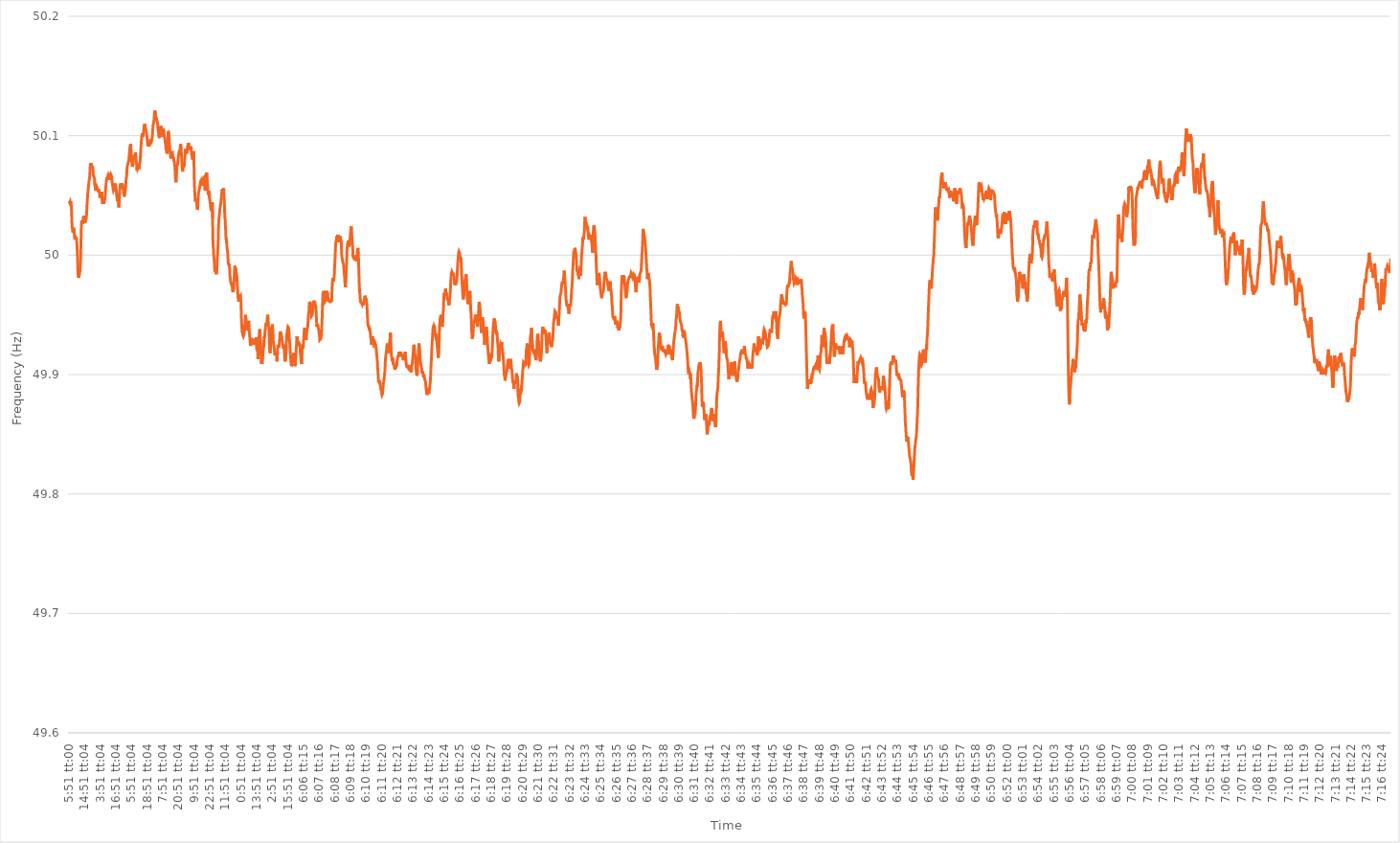
| Category | Series 0 |
|---|---|
| 0.24375 | 50.045 |
| 0.24376157407407406 | 50.045 |
| 0.24377314814814813 | 50.044 |
| 0.24378472222222222 | 50.044 |
| 0.2437962962962963 | 50.045 |
| 0.285462962962963 | 50.044 |
| 0.32712962962963 | 50.045 |
| 0.368796296296296 | 50.045 |
| 0.410462962962963 | 50.043 |
| 0.45212962962963 | 50.04 |
| 0.493796296296296 | 50.034 |
| 0.535462962962963 | 50.028 |
| 0.57712962962963 | 50.023 |
| 0.618796296296296 | 50.022 |
| 0.660462962962963 | 50.021 |
| 0.70212962962963 | 50.019 |
| 0.743796296296296 | 50.021 |
| 0.785462962962963 | 50.021 |
| 0.82712962962963 | 50.023 |
| 0.868796296296296 | 50.023 |
| 0.910462962962963 | 50.019 |
| 0.95212962962963 | 50.017 |
| 0.993796296296296 | 50.014 |
| 1900-01-01 00:51:04 | 50.013 |
| 1900-01-01 01:51:04 | 50.014 |
| 1900-01-01 02:51:04 | 50.014 |
| 1900-01-01 03:51:04 | 50.015 |
| 1900-01-01 04:51:04 | 50.015 |
| 1900-01-01 05:51:04 | 50.015 |
| 1900-01-01 06:51:04 | 50.014 |
| 1900-01-01 07:51:04 | 50.011 |
| 1900-01-01 08:51:04 | 50.008 |
| 1900-01-01 09:51:04 | 50.003 |
| 1900-01-01 10:51:04 | 49.998 |
| 1900-01-01 11:51:04 | 49.991 |
| 1900-01-01 12:51:04 | 49.984 |
| 1900-01-01 13:51:04 | 49.982 |
| 1900-01-01 14:51:04 | 49.981 |
| 1900-01-01 15:51:04 | 49.982 |
| 1900-01-01 16:51:04 | 49.982 |
| 1900-01-01 17:51:04 | 49.983 |
| 1900-01-01 18:51:04 | 49.985 |
| 1900-01-01 19:51:04 | 49.986 |
| 1900-01-01 20:51:04 | 49.987 |
| 1900-01-01 21:51:04 | 49.991 |
| 1900-01-01 22:51:04 | 49.997 |
| 1900-01-01 23:51:04 | 50.008 |
| 1900-01-02 00:51:04 | 50.017 |
| 1900-01-02 01:51:04 | 50.025 |
| 1900-01-02 02:51:04 | 50.029 |
| 1900-01-02 03:51:04 | 50.029 |
| 1900-01-02 04:51:04 | 50.028 |
| 1900-01-02 05:51:04 | 50.026 |
| 1900-01-02 06:51:04 | 50.028 |
| 1900-01-02 07:51:04 | 50.028 |
| 1900-01-02 08:51:04 | 50.03 |
| 1900-01-02 09:51:04 | 50.032 |
| 1900-01-02 10:51:04 | 50.033 |
| 1900-01-02 11:51:04 | 50.032 |
| 1900-01-02 12:51:04 | 50.029 |
| 1900-01-02 13:51:04 | 50.027 |
| 1900-01-02 14:51:04 | 50.029 |
| 1900-01-02 15:51:04 | 50.027 |
| 1900-01-02 16:51:04 | 50.027 |
| 1900-01-02 17:51:04 | 50.03 |
| 1900-01-02 18:51:04 | 50.029 |
| 1900-01-02 19:51:04 | 50.029 |
| 1900-01-02 20:51:04 | 50.032 |
| 1900-01-02 21:51:04 | 50.033 |
| 1900-01-02 22:51:04 | 50.037 |
| 1900-01-02 23:51:04 | 50.042 |
| 1900-01-03 00:51:04 | 50.045 |
| 1900-01-03 01:51:04 | 50.049 |
| 1900-01-03 02:51:04 | 50.052 |
| 1900-01-03 03:51:04 | 50.053 |
| 1900-01-03 04:51:04 | 50.056 |
| 1900-01-03 05:51:04 | 50.058 |
| 1900-01-03 06:51:04 | 50.06 |
| 1900-01-03 07:51:04 | 50.062 |
| 1900-01-03 08:51:04 | 50.062 |
| 1900-01-03 09:51:04 | 50.065 |
| 1900-01-03 10:51:04 | 50.068 |
| 1900-01-03 11:51:04 | 50.073 |
| 1900-01-03 12:51:04 | 50.076 |
| 1900-01-03 13:51:04 | 50.075 |
| 1900-01-03 14:51:04 | 50.077 |
| 1900-01-03 15:51:04 | 50.077 |
| 1900-01-03 16:51:04 | 50.076 |
| 1900-01-03 17:51:04 | 50.075 |
| 1900-01-03 18:51:04 | 50.075 |
| 1900-01-03 19:51:04 | 50.075 |
| 1900-01-03 20:51:04 | 50.074 |
| 1900-01-03 21:51:04 | 50.074 |
| 1900-01-03 22:51:04 | 50.073 |
| 1900-01-03 23:51:04 | 50.068 |
| 1900-01-04 00:51:04 | 50.067 |
| 1900-01-04 01:51:04 | 50.066 |
| 1900-01-04 02:51:04 | 50.066 |
| 1900-01-04 03:51:04 | 50.065 |
| 1900-01-04 04:51:04 | 50.064 |
| 1900-01-04 05:51:04 | 50.059 |
| 1900-01-04 06:51:04 | 50.058 |
| 1900-01-04 07:51:04 | 50.057 |
| 1900-01-04 08:51:04 | 50.055 |
| 1900-01-04 09:51:04 | 50.054 |
| 1900-01-04 10:51:04 | 50.057 |
| 1900-01-04 11:51:04 | 50.057 |
| 1900-01-04 12:51:04 | 50.058 |
| 1900-01-04 13:51:04 | 50.058 |
| 1900-01-04 14:51:04 | 50.057 |
| 1900-01-04 15:51:04 | 50.056 |
| 1900-01-04 16:51:04 | 50.055 |
| 1900-01-04 17:51:04 | 50.054 |
| 1900-01-04 18:51:04 | 50.055 |
| 1900-01-04 19:51:04 | 50.055 |
| 1900-01-04 20:51:04 | 50.053 |
| 1900-01-04 21:51:04 | 50.055 |
| 1900-01-04 22:51:04 | 50.054 |
| 1900-01-04 23:51:04 | 50.053 |
| 1900-01-05 00:51:04 | 50.051 |
| 1900-01-05 01:51:04 | 50.048 |
| 1900-01-05 02:51:04 | 50.049 |
| 1900-01-05 03:51:04 | 50.051 |
| 1900-01-05 04:51:04 | 50.051 |
| 1900-01-05 05:51:04 | 50.051 |
| 1900-01-05 06:51:04 | 50.051 |
| 1900-01-05 07:51:04 | 50.051 |
| 1900-01-05 08:51:04 | 50.053 |
| 1900-01-05 09:51:04 | 50.05 |
| 1900-01-05 10:51:04 | 50.046 |
| 1900-01-05 11:51:04 | 50.044 |
| 1900-01-05 12:51:04 | 50.043 |
| 1900-01-05 13:51:04 | 50.045 |
| 1900-01-05 14:51:04 | 50.046 |
| 1900-01-05 15:51:04 | 50.046 |
| 1900-01-05 16:51:04 | 50.044 |
| 1900-01-05 17:51:04 | 50.043 |
| 1900-01-05 18:51:04 | 50.044 |
| 1900-01-05 19:51:04 | 50.045 |
| 1900-01-05 20:51:04 | 50.045 |
| 1900-01-05 21:51:04 | 50.048 |
| 1900-01-05 22:51:04 | 50.05 |
| 1900-01-05 23:51:04 | 50.054 |
| 1900-01-06 00:51:04 | 50.057 |
| 1900-01-06 01:51:04 | 50.058 |
| 1900-01-06 02:51:04 | 50.061 |
| 1900-01-06 03:51:04 | 50.063 |
| 1900-01-06 04:51:04 | 50.064 |
| 1900-01-06 05:51:04 | 50.065 |
| 1900-01-06 06:51:04 | 50.064 |
| 1900-01-06 07:51:04 | 50.065 |
| 1900-01-06 08:51:04 | 50.065 |
| 1900-01-06 09:51:04 | 50.064 |
| 1900-01-06 10:51:04 | 50.066 |
| 1900-01-06 11:51:04 | 50.067 |
| 1900-01-06 12:51:04 | 50.067 |
| 1900-01-06 13:51:04 | 50.066 |
| 1900-01-06 14:51:04 | 50.065 |
| 1900-01-06 15:51:04 | 50.063 |
| 1900-01-06 16:51:04 | 50.065 |
| 1900-01-06 17:51:04 | 50.067 |
| 1900-01-06 18:51:04 | 50.067 |
| 1900-01-06 19:51:04 | 50.068 |
| 1900-01-06 20:51:04 | 50.068 |
| 1900-01-06 21:51:04 | 50.067 |
| 1900-01-06 22:51:04 | 50.067 |
| 1900-01-06 23:51:04 | 50.066 |
| 1900-01-07 00:51:04 | 50.065 |
| 1900-01-07 01:51:04 | 50.061 |
| 1900-01-07 02:51:04 | 50.06 |
| 1900-01-07 03:51:04 | 50.058 |
| 1900-01-07 04:51:04 | 50.057 |
| 1900-01-07 05:51:04 | 50.055 |
| 1900-01-07 06:51:04 | 50.054 |
| 1900-01-07 07:51:04 | 50.054 |
| 1900-01-07 08:51:04 | 50.055 |
| 1900-01-07 09:51:04 | 50.055 |
| 1900-01-07 10:51:04 | 50.056 |
| 1900-01-07 11:51:04 | 50.058 |
| 1900-01-07 12:51:04 | 50.057 |
| 1900-01-07 13:51:04 | 50.058 |
| 1900-01-07 14:51:04 | 50.06 |
| 1900-01-07 15:51:04 | 50.057 |
| 1900-01-07 16:51:04 | 50.056 |
| 1900-01-07 17:51:04 | 50.055 |
| 1900-01-07 18:51:04 | 50.052 |
| 1900-01-07 19:51:04 | 50.05 |
| 1900-01-07 20:51:04 | 50.048 |
| 1900-01-07 21:51:04 | 50.048 |
| 1900-01-07 22:51:04 | 50.048 |
| 1900-01-07 23:51:04 | 50.049 |
| 1900-01-08 00:51:04 | 50.047 |
| 1900-01-08 01:51:04 | 50.046 |
| 1900-01-08 02:51:04 | 50.043 |
| 1900-01-08 03:51:04 | 50.04 |
| 1900-01-08 04:51:04 | 50.042 |
| 1900-01-08 05:51:04 | 50.046 |
| 1900-01-08 06:51:04 | 50.05 |
| 1900-01-08 07:51:04 | 50.055 |
| 1900-01-08 08:51:04 | 50.058 |
| 1900-01-08 09:51:04 | 50.059 |
| 1900-01-08 10:51:04 | 50.06 |
| 1900-01-08 11:51:04 | 50.058 |
| 1900-01-08 12:51:04 | 50.056 |
| 1900-01-08 13:51:04 | 50.058 |
| 1900-01-08 14:51:04 | 50.057 |
| 1900-01-08 15:51:04 | 50.057 |
| 1900-01-08 16:51:04 | 50.06 |
| 1900-01-08 17:51:04 | 50.06 |
| 1900-01-08 18:51:04 | 50.058 |
| 1900-01-08 19:51:04 | 50.057 |
| 1900-01-08 20:51:04 | 50.056 |
| 1900-01-08 21:51:04 | 50.054 |
| 1900-01-08 22:51:04 | 50.052 |
| 1900-01-08 23:51:04 | 50.051 |
| 1900-01-09 00:51:04 | 50.049 |
| 1900-01-09 01:51:04 | 50.049 |
| 1900-01-09 02:51:04 | 50.051 |
| 1900-01-09 03:51:04 | 50.052 |
| 1900-01-09 04:51:04 | 50.053 |
| 1900-01-09 05:51:04 | 50.055 |
| 1900-01-09 06:51:04 | 50.058 |
| 1900-01-09 07:51:04 | 50.062 |
| 1900-01-09 08:51:04 | 50.064 |
| 1900-01-09 09:51:04 | 50.065 |
| 1900-01-09 10:51:04 | 50.068 |
| 1900-01-09 11:51:04 | 50.072 |
| 1900-01-09 12:51:04 | 50.074 |
| 1900-01-09 13:51:04 | 50.074 |
| 1900-01-09 14:51:04 | 50.076 |
| 1900-01-09 15:51:04 | 50.077 |
| 1900-01-09 16:51:04 | 50.077 |
| 1900-01-09 17:51:04 | 50.077 |
| 1900-01-09 18:51:04 | 50.079 |
| 1900-01-09 19:51:04 | 50.082 |
| 1900-01-09 20:51:04 | 50.084 |
| 1900-01-09 21:51:04 | 50.086 |
| 1900-01-09 22:51:04 | 50.089 |
| 1900-01-09 23:51:04 | 50.091 |
| 1900-01-10 00:51:04 | 50.092 |
| 1900-01-10 01:51:04 | 50.093 |
| 1900-01-10 02:51:04 | 50.092 |
| 1900-01-10 03:51:04 | 50.088 |
| 1900-01-10 04:51:04 | 50.083 |
| 1900-01-10 05:51:04 | 50.081 |
| 1900-01-10 06:51:04 | 50.077 |
| 1900-01-10 07:51:04 | 50.076 |
| 1900-01-10 08:51:04 | 50.074 |
| 1900-01-10 09:51:04 | 50.074 |
| 1900-01-10 10:51:04 | 50.074 |
| 1900-01-10 11:51:04 | 50.077 |
| 1900-01-10 12:51:04 | 50.08 |
| 1900-01-10 13:51:04 | 50.081 |
| 1900-01-10 14:51:04 | 50.083 |
| 1900-01-10 15:51:04 | 50.084 |
| 1900-01-10 16:51:04 | 50.082 |
| 1900-01-10 17:51:04 | 50.082 |
| 1900-01-10 18:51:04 | 50.083 |
| 1900-01-10 19:51:04 | 50.084 |
| 1900-01-10 20:51:04 | 50.086 |
| 1900-01-10 21:51:04 | 50.084 |
| 1900-01-10 22:51:04 | 50.082 |
| 1900-01-10 23:51:04 | 50.079 |
| 1900-01-11 00:51:04 | 50.077 |
| 1900-01-11 01:51:04 | 50.074 |
| 1900-01-11 02:51:04 | 50.071 |
| 1900-01-11 03:51:04 | 50.073 |
| 1900-01-11 04:51:04 | 50.072 |
| 1900-01-11 05:51:04 | 50.072 |
| 1900-01-11 06:51:04 | 50.073 |
| 1900-01-11 07:51:04 | 50.073 |
| 1900-01-11 08:51:04 | 50.074 |
| 1900-01-11 09:51:04 | 50.073 |
| 1900-01-11 10:51:04 | 50.072 |
| 1900-01-11 11:51:04 | 50.075 |
| 1900-01-11 12:51:04 | 50.076 |
| 1900-01-11 13:51:04 | 50.076 |
| 1900-01-11 14:51:04 | 50.078 |
| 1900-01-11 15:51:04 | 50.081 |
| 1900-01-11 16:51:04 | 50.085 |
| 1900-01-11 17:51:04 | 50.089 |
| 1900-01-11 18:51:04 | 50.092 |
| 1900-01-11 19:51:04 | 50.096 |
| 1900-01-11 20:51:04 | 50.097 |
| 1900-01-11 21:51:04 | 50.1 |
| 1900-01-11 22:51:04 | 50.1 |
| 1900-01-11 23:51:04 | 50.102 |
| 1900-01-12 00:51:04 | 50.1 |
| 1900-01-12 01:51:04 | 50.099 |
| 1900-01-12 02:51:04 | 50.1 |
| 1900-01-12 03:51:04 | 50.1 |
| 1900-01-12 04:51:04 | 50.104 |
| 1900-01-12 05:51:04 | 50.106 |
| 1900-01-12 06:51:04 | 50.108 |
| 1900-01-12 07:51:04 | 50.109 |
| 1900-01-12 08:51:04 | 50.11 |
| 1900-01-12 09:51:04 | 50.109 |
| 1900-01-12 10:51:04 | 50.108 |
| 1900-01-12 11:51:04 | 50.107 |
| 1900-01-12 12:51:04 | 50.107 |
| 1900-01-12 13:51:04 | 50.105 |
| 1900-01-12 14:51:04 | 50.104 |
| 1900-01-12 15:51:04 | 50.104 |
| 1900-01-12 16:51:04 | 50.1 |
| 1900-01-12 17:51:04 | 50.099 |
| 1900-01-12 18:51:04 | 50.097 |
| 1900-01-12 19:51:04 | 50.094 |
| 1900-01-12 20:51:04 | 50.094 |
| 1900-01-12 21:51:04 | 50.091 |
| 1900-01-12 22:51:04 | 50.092 |
| 1900-01-12 23:51:04 | 50.093 |
| 1900-01-13 00:51:04 | 50.092 |
| 1900-01-13 01:51:04 | 50.091 |
| 1900-01-13 02:51:04 | 50.091 |
| 1900-01-13 03:51:04 | 50.091 |
| 1900-01-13 04:51:04 | 50.094 |
| 1900-01-13 05:51:04 | 50.095 |
| 1900-01-13 06:51:04 | 50.096 |
| 1900-01-13 07:51:04 | 50.097 |
| 1900-01-13 08:51:04 | 50.094 |
| 1900-01-13 09:51:04 | 50.097 |
| 1900-01-13 10:51:04 | 50.097 |
| 1900-01-13 11:51:04 | 50.096 |
| 1900-01-13 12:51:04 | 50.097 |
| 1900-01-13 13:51:04 | 50.097 |
| 1900-01-13 14:51:04 | 50.1 |
| 1900-01-13 15:51:04 | 50.104 |
| 1900-01-13 16:51:04 | 50.106 |
| 1900-01-13 17:51:04 | 50.109 |
| 1900-01-13 18:51:04 | 50.11 |
| 1900-01-13 19:51:04 | 50.111 |
| 1900-01-13 20:51:04 | 50.111 |
| 1900-01-13 21:51:04 | 50.114 |
| 1900-01-13 22:51:04 | 50.118 |
| 1900-01-13 23:51:04 | 50.12 |
| 1900-01-14 00:51:04 | 50.121 |
| 1900-01-14 01:51:04 | 50.121 |
| 1900-01-14 02:51:04 | 50.119 |
| 1900-01-14 03:51:04 | 50.117 |
| 1900-01-14 04:51:04 | 50.113 |
| 1900-01-14 05:51:04 | 50.113 |
| 1900-01-14 06:51:04 | 50.115 |
| 1900-01-14 07:51:04 | 50.113 |
| 1900-01-14 08:51:04 | 50.113 |
| 1900-01-14 09:51:04 | 50.113 |
| 1900-01-14 10:51:04 | 50.111 |
| 1900-01-14 11:51:04 | 50.109 |
| 1900-01-14 12:51:04 | 50.105 |
| 1900-01-14 13:51:04 | 50.104 |
| 1900-01-14 14:51:04 | 50.103 |
| 1900-01-14 15:51:04 | 50.1 |
| 1900-01-14 16:51:04 | 50.099 |
| 1900-01-14 17:51:04 | 50.098 |
| 1900-01-14 18:51:04 | 50.1 |
| 1900-01-14 19:51:04 | 50.104 |
| 1900-01-14 20:51:04 | 50.106 |
| 1900-01-14 21:51:04 | 50.108 |
| 1900-01-14 22:51:04 | 50.108 |
| 1900-01-14 23:51:04 | 50.107 |
| 1900-01-15 00:51:04 | 50.108 |
| 1900-01-15 01:51:04 | 50.106 |
| 1900-01-15 02:51:04 | 50.104 |
| 1900-01-15 03:51:04 | 50.102 |
| 1900-01-15 04:51:04 | 50.099 |
| 1900-01-15 05:51:04 | 50.101 |
| 1900-01-15 06:51:04 | 50.103 |
| 1900-01-15 07:51:04 | 50.104 |
| 1900-01-15 08:51:04 | 50.106 |
| 1900-01-15 09:51:04 | 50.106 |
| 1900-01-15 10:51:04 | 50.105 |
| 1900-01-15 11:51:04 | 50.104 |
| 1900-01-15 12:51:04 | 50.101 |
| 1900-01-15 13:51:04 | 50.099 |
| 1900-01-15 14:51:04 | 50.099 |
| 1900-01-15 15:51:04 | 50.098 |
| 1900-01-15 16:51:04 | 50.095 |
| 1900-01-15 17:51:04 | 50.094 |
| 1900-01-15 18:51:04 | 50.092 |
| 1900-01-15 19:51:04 | 50.089 |
| 1900-01-15 20:51:04 | 50.089 |
| 1900-01-15 21:51:04 | 50.089 |
| 1900-01-15 22:51:04 | 50.086 |
| 1900-01-15 23:51:04 | 50.085 |
| 1900-01-16 00:51:04 | 50.087 |
| 1900-01-16 01:51:04 | 50.094 |
| 1900-01-16 02:51:04 | 50.098 |
| 1900-01-16 03:51:04 | 50.1 |
| 1900-01-16 04:51:04 | 50.104 |
| 1900-01-16 05:51:04 | 50.103 |
| 1900-01-16 06:51:04 | 50.102 |
| 1900-01-16 07:51:04 | 50.101 |
| 1900-01-16 08:51:04 | 50.095 |
| 1900-01-16 09:51:04 | 50.092 |
| 1900-01-16 10:51:04 | 50.089 |
| 1900-01-16 11:51:04 | 50.087 |
| 1900-01-16 12:51:04 | 50.085 |
| 1900-01-16 13:51:04 | 50.082 |
| 1900-01-16 14:51:04 | 50.081 |
| 1900-01-16 15:51:04 | 50.081 |
| 1900-01-16 16:51:04 | 50.084 |
| 1900-01-16 17:51:04 | 50.086 |
| 1900-01-16 18:51:04 | 50.085 |
| 1900-01-16 19:51:04 | 50.087 |
| 1900-01-16 20:51:04 | 50.086 |
| 1900-01-16 21:51:04 | 50.085 |
| 1900-01-16 22:51:04 | 50.083 |
| 1900-01-16 23:51:04 | 50.081 |
| 1900-01-17 00:51:04 | 50.082 |
| 1900-01-17 01:51:04 | 50.081 |
| 1900-01-17 02:51:04 | 50.079 |
| 1900-01-17 03:51:04 | 50.079 |
| 1900-01-17 04:51:04 | 50.078 |
| 1900-01-17 05:51:04 | 50.075 |
| 1900-01-17 06:51:04 | 50.074 |
| 1900-01-17 07:51:04 | 50.07 |
| 1900-01-17 08:51:04 | 50.065 |
| 1900-01-17 09:51:04 | 50.063 |
| 1900-01-17 10:51:04 | 50.061 |
| 1900-01-17 11:51:04 | 50.064 |
| 1900-01-17 12:51:04 | 50.066 |
| 1900-01-17 13:51:04 | 50.071 |
| 1900-01-17 14:51:04 | 50.074 |
| 1900-01-17 15:51:04 | 50.075 |
| 1900-01-17 16:51:04 | 50.076 |
| 1900-01-17 17:51:04 | 50.077 |
| 1900-01-17 18:51:04 | 50.08 |
| 1900-01-17 19:51:04 | 50.081 |
| 1900-01-17 20:51:04 | 50.084 |
| 1900-01-17 21:51:04 | 50.084 |
| 1900-01-17 22:51:04 | 50.086 |
| 1900-01-17 23:51:04 | 50.087 |
| 1900-01-18 00:51:04 | 50.087 |
| 1900-01-18 01:51:04 | 50.087 |
| 1900-01-18 02:51:04 | 50.088 |
| 1900-01-18 03:51:04 | 50.091 |
| 1900-01-18 04:51:04 | 50.093 |
| 1900-01-18 05:51:04 | 50.092 |
| 1900-01-18 06:51:04 | 50.091 |
| 1900-01-18 07:51:04 | 50.086 |
| 1900-01-18 08:51:04 | 50.083 |
| 1900-01-18 09:51:04 | 50.078 |
| 1900-01-18 10:51:04 | 50.073 |
| 1900-01-18 11:51:04 | 50.072 |
| 1900-01-18 12:51:04 | 50.07 |
| 1900-01-18 13:51:04 | 50.071 |
| 1900-01-18 14:51:04 | 50.075 |
| 1900-01-18 15:51:04 | 50.074 |
| 1900-01-18 16:51:04 | 50.074 |
| 1900-01-18 17:51:04 | 50.075 |
| 1900-01-18 18:51:04 | 50.074 |
| 1900-01-18 19:51:04 | 50.077 |
| 1900-01-18 20:51:04 | 50.08 |
| 1900-01-18 21:51:04 | 50.082 |
| 1900-01-18 22:51:04 | 50.087 |
| 1900-01-18 23:51:04 | 50.088 |
| 1900-01-19 00:51:04 | 50.089 |
| 1900-01-19 01:51:04 | 50.089 |
| 1900-01-19 02:51:04 | 50.087 |
| 1900-01-19 03:51:04 | 50.087 |
| 1900-01-19 04:51:04 | 50.085 |
| 1900-01-19 05:51:04 | 50.087 |
| 1900-01-19 06:51:04 | 50.088 |
| 1900-01-19 07:51:04 | 50.091 |
| 1900-01-19 08:51:04 | 50.091 |
| 1900-01-19 09:51:04 | 50.091 |
| 1900-01-19 10:51:04 | 50.093 |
| 1900-01-19 11:51:04 | 50.094 |
| 1900-01-19 12:51:04 | 50.094 |
| 1900-01-19 13:51:04 | 50.09 |
| 1900-01-19 14:51:04 | 50.089 |
| 1900-01-19 15:51:04 | 50.088 |
| 1900-01-19 16:51:04 | 50.089 |
| 1900-01-19 17:51:04 | 50.091 |
| 1900-01-19 18:51:04 | 50.089 |
| 1900-01-19 19:51:04 | 50.089 |
| 1900-01-19 20:51:04 | 50.091 |
| 1900-01-19 21:51:04 | 50.09 |
| 1900-01-19 22:51:04 | 50.089 |
| 1900-01-19 23:51:04 | 50.084 |
| 1900-01-20 00:51:04 | 50.084 |
| 1900-01-20 01:51:04 | 50.083 |
| 1900-01-20 02:51:04 | 50.081 |
| 1900-01-20 03:51:04 | 50.08 |
| 1900-01-20 04:51:04 | 50.082 |
| 1900-01-20 05:51:04 | 50.083 |
| 1900-01-20 06:51:04 | 50.086 |
| 1900-01-20 07:51:04 | 50.087 |
| 1900-01-20 08:51:04 | 50.084 |
| 1900-01-20 09:51:04 | 50.067 |
| 1900-01-20 10:51:04 | 50.06 |
| 1900-01-20 11:51:04 | 50.054 |
| 1900-01-20 12:51:04 | 50.05 |
| 1900-01-20 13:51:04 | 50.048 |
| 1900-01-20 14:51:04 | 50.045 |
| 1900-01-20 15:51:04 | 50.047 |
| 1900-01-20 16:51:04 | 50.047 |
| 1900-01-20 17:51:04 | 50.046 |
| 1900-01-20 18:51:04 | 50.046 |
| 1900-01-20 19:51:04 | 50.044 |
| 1900-01-20 20:51:04 | 50.041 |
| 1900-01-20 21:51:04 | 50.039 |
| 1900-01-20 22:51:04 | 50.038 |
| 1900-01-20 23:51:04 | 50.039 |
| 1900-01-21 00:51:04 | 50.043 |
| 1900-01-21 01:51:04 | 50.049 |
| 1900-01-21 02:51:04 | 50.052 |
| 1900-01-21 03:51:04 | 50.053 |
| 1900-01-21 04:51:04 | 50.053 |
| 1900-01-21 05:51:04 | 50.055 |
| 1900-01-21 06:51:04 | 50.055 |
| 1900-01-21 07:51:04 | 50.057 |
| 1900-01-21 08:51:04 | 50.059 |
| 1900-01-21 09:51:04 | 50.06 |
| 1900-01-21 10:51:04 | 50.062 |
| 1900-01-21 11:51:04 | 50.062 |
| 1900-01-21 12:51:04 | 50.062 |
| 1900-01-21 13:51:04 | 50.063 |
| 1900-01-21 14:51:04 | 50.06 |
| 1900-01-21 15:51:04 | 50.06 |
| 1900-01-21 16:51:04 | 50.058 |
| 1900-01-21 17:51:04 | 50.059 |
| 1900-01-21 18:51:04 | 50.062 |
| 1900-01-21 19:51:04 | 50.062 |
| 1900-01-21 20:51:04 | 50.063 |
| 1900-01-21 21:51:04 | 50.062 |
| 1900-01-21 22:51:04 | 50.063 |
| 1900-01-21 23:51:04 | 50.063 |
| 1900-01-22 00:51:04 | 50.064 |
| 1900-01-22 01:51:04 | 50.063 |
| 1900-01-22 02:51:04 | 50.059 |
| 1900-01-22 03:51:04 | 50.056 |
| 1900-01-22 04:51:04 | 50.054 |
| 1900-01-22 05:51:04 | 50.057 |
| 1900-01-22 06:51:04 | 50.059 |
| 1900-01-22 07:51:04 | 50.064 |
| 1900-01-22 08:51:04 | 50.068 |
| 1900-01-22 09:51:04 | 50.068 |
| 1900-01-22 10:51:04 | 50.069 |
| 1900-01-22 11:51:04 | 50.064 |
| 1900-01-22 12:51:04 | 50.063 |
| 1900-01-22 13:51:04 | 50.059 |
| 1900-01-22 14:51:04 | 50.058 |
| 1900-01-22 15:51:04 | 50.053 |
| 1900-01-22 16:51:04 | 50.051 |
| 1900-01-22 17:51:04 | 50.051 |
| 1900-01-22 18:51:04 | 50.054 |
| 1900-01-22 19:51:04 | 50.05 |
| 1900-01-22 20:51:04 | 50.053 |
| 1900-01-22 21:51:04 | 50.048 |
| 1900-01-22 22:51:04 | 50.046 |
| 1900-01-22 23:51:04 | 50.046 |
| 1900-01-23 00:51:04 | 50.043 |
| 1900-01-23 01:51:04 | 50.041 |
| 1900-01-23 02:51:04 | 50.039 |
| 1900-01-23 03:51:04 | 50.037 |
| 1900-01-23 04:51:04 | 50.039 |
| 1900-01-23 05:51:04 | 50.041 |
| 1900-01-23 06:51:04 | 50.044 |
| 1900-01-23 07:51:04 | 50.042 |
| 1900-01-23 08:51:04 | 50.044 |
| 1900-01-23 09:51:04 | 50.031 |
| 1900-01-23 10:51:04 | 50.016 |
| 1900-01-23 11:51:04 | 50.008 |
| 1900-01-23 12:51:04 | 50.007 |
| 1900-01-23 13:51:04 | 50.001 |
| 1900-01-23 14:51:04 | 49.998 |
| 1900-01-23 15:51:04 | 49.996 |
| 1900-01-23 16:51:04 | 49.994 |
| 1900-01-23 17:51:04 | 49.989 |
| 1900-01-23 18:51:04 | 49.986 |
| 1900-01-23 19:51:04 | 49.986 |
| 1900-01-23 20:51:04 | 49.987 |
| 1900-01-23 21:51:04 | 49.987 |
| 1900-01-23 22:51:04 | 49.987 |
| 1900-01-23 23:51:04 | 49.985 |
| 1900-01-24 00:51:04 | 49.984 |
| 1900-01-24 01:51:04 | 49.987 |
| 1900-01-24 02:51:04 | 49.989 |
| 1900-01-24 03:51:04 | 49.996 |
| 1900-01-24 04:51:04 | 50 |
| 1900-01-24 05:51:04 | 50.004 |
| 1900-01-24 06:51:04 | 50.008 |
| 1900-01-24 07:51:04 | 50.013 |
| 1900-01-24 08:51:04 | 50.024 |
| 1900-01-24 09:51:04 | 50.028 |
| 1900-01-24 10:51:04 | 50.031 |
| 1900-01-24 11:51:04 | 50.033 |
| 1900-01-24 12:51:04 | 50.035 |
| 1900-01-24 13:51:04 | 50.038 |
| 1900-01-24 14:51:04 | 50.039 |
| 1900-01-24 15:51:04 | 50.041 |
| 1900-01-24 16:51:04 | 50.042 |
| 1900-01-24 17:51:04 | 50.044 |
| 1900-01-24 18:51:04 | 50.046 |
| 1900-01-24 19:51:04 | 50.047 |
| 1900-01-24 20:51:04 | 50.051 |
| 1900-01-24 21:51:04 | 50.052 |
| 1900-01-24 22:51:04 | 50.055 |
| 1900-01-24 23:51:04 | 50.054 |
| 1900-01-25 00:51:04 | 50.055 |
| 1900-01-25 01:51:04 | 50.052 |
| 1900-01-25 02:51:04 | 50.054 |
| 1900-01-25 03:51:04 | 50.054 |
| 1900-01-25 04:51:04 | 50.056 |
| 1900-01-25 05:51:04 | 50.053 |
| 1900-01-25 06:51:04 | 50.048 |
| 1900-01-25 07:51:04 | 50.044 |
| 1900-01-25 08:51:04 | 50.036 |
| 1900-01-25 09:51:04 | 50.032 |
| 1900-01-25 10:51:04 | 50.03 |
| 1900-01-25 11:51:04 | 50.025 |
| 1900-01-25 12:51:04 | 50.021 |
| 1900-01-25 13:51:04 | 50.015 |
| 1900-01-25 14:51:04 | 50.013 |
| 1900-01-25 15:51:04 | 50.014 |
| 1900-01-25 16:51:04 | 50.01 |
| 1900-01-25 17:51:04 | 50.008 |
| 1900-01-25 18:51:04 | 50.005 |
| 1900-01-25 19:51:04 | 50.004 |
| 1900-01-25 20:51:04 | 50.002 |
| 1900-01-25 21:51:04 | 49.998 |
| 1900-01-25 22:51:04 | 49.994 |
| 1900-01-25 23:51:04 | 49.992 |
| 1900-01-26 00:51:04 | 49.992 |
| 1900-01-26 01:51:04 | 49.993 |
| 1900-01-26 02:51:04 | 49.991 |
| 1900-01-26 03:51:04 | 49.99 |
| 1900-01-26 04:51:04 | 49.987 |
| 1900-01-26 05:51:04 | 49.982 |
| 1900-01-26 06:51:04 | 49.981 |
| 1900-01-26 07:51:04 | 49.981 |
| 1900-01-26 08:51:04 | 49.977 |
| 1900-01-26 09:51:04 | 49.976 |
| 1900-01-26 10:51:04 | 49.977 |
| 1900-01-26 11:51:04 | 49.977 |
| 1900-01-26 12:51:04 | 49.975 |
| 1900-01-26 13:51:04 | 49.975 |
| 1900-01-26 14:51:04 | 49.973 |
| 1900-01-26 15:51:04 | 49.97 |
| 1900-01-26 16:51:04 | 49.97 |
| 1900-01-26 17:51:04 | 49.969 |
| 1900-01-26 18:51:04 | 49.969 |
| 1900-01-26 19:51:04 | 49.973 |
| 1900-01-26 20:51:04 | 49.976 |
| 1900-01-26 21:51:04 | 49.98 |
| 1900-01-26 22:51:04 | 49.984 |
| 1900-01-26 23:51:04 | 49.99 |
| 1900-01-27 00:51:04 | 49.991 |
| 1900-01-27 01:51:04 | 49.991 |
| 1900-01-27 02:51:04 | 49.988 |
| 1900-01-27 03:51:04 | 49.989 |
| 1900-01-27 04:51:04 | 49.989 |
| 1900-01-27 05:51:04 | 49.986 |
| 1900-01-27 06:51:04 | 49.985 |
| 1900-01-27 07:51:04 | 49.983 |
| 1900-01-27 08:51:04 | 49.982 |
| 1900-01-27 09:51:04 | 49.976 |
| 1900-01-27 10:51:04 | 49.973 |
| 1900-01-27 11:51:04 | 49.97 |
| 1900-01-27 12:51:04 | 49.966 |
| 1900-01-27 13:51:04 | 49.964 |
| 1900-01-27 14:51:04 | 49.965 |
| 1900-01-27 15:51:04 | 49.961 |
| 1900-01-27 16:51:04 | 49.961 |
| 1900-01-27 17:51:04 | 49.965 |
| 1900-01-27 18:51:04 | 49.967 |
| 1900-01-27 19:51:04 | 49.965 |
| 1900-01-27 20:51:04 | 49.965 |
| 1900-01-27 21:51:04 | 49.965 |
| 1900-01-27 22:51:04 | 49.966 |
| 1900-01-27 23:51:04 | 49.962 |
| 1900-01-28 00:51:04 | 49.961 |
| 1900-01-28 01:51:04 | 49.95 |
| 1900-01-28 02:51:04 | 49.944 |
| 1900-01-28 03:51:04 | 49.941 |
| 1900-01-28 04:51:04 | 49.936 |
| 1900-01-28 05:51:04 | 49.936 |
| 1900-01-28 06:51:04 | 49.935 |
| 1900-01-28 07:51:04 | 49.933 |
| 1900-01-28 08:51:04 | 49.933 |
| 1900-01-28 09:51:04 | 49.932 |
| 1900-01-28 10:51:04 | 49.932 |
| 1900-01-28 11:51:04 | 49.932 |
| 1900-01-28 12:51:04 | 49.934 |
| 1900-01-28 13:51:04 | 49.937 |
| 1900-01-28 14:51:04 | 49.94 |
| 1900-01-28 15:51:04 | 49.942 |
| 1900-01-28 16:51:04 | 49.945 |
| 1900-01-28 17:51:04 | 49.949 |
| 1900-01-28 18:51:04 | 49.95 |
| 1900-01-28 19:51:04 | 49.944 |
| 1900-01-28 20:51:04 | 49.941 |
| 1900-01-28 21:51:04 | 49.939 |
| 1900-01-28 22:51:04 | 49.937 |
| 1900-01-28 23:51:04 | 49.937 |
| 1900-01-29 00:51:04 | 49.938 |
| 1900-01-29 01:51:04 | 49.94 |
| 1900-01-29 02:51:04 | 49.941 |
| 1900-01-29 03:51:04 | 49.942 |
| 1900-01-29 04:51:04 | 49.944 |
| 1900-01-29 05:51:04 | 49.943 |
| 1900-01-29 06:51:04 | 49.945 |
| 1900-01-29 07:51:04 | 49.94 |
| 1900-01-29 08:51:04 | 49.937 |
| 1900-01-29 09:51:04 | 49.934 |
| 1900-01-29 10:51:04 | 49.932 |
| 1900-01-29 11:51:04 | 49.929 |
| 1900-01-29 12:51:04 | 49.927 |
| 1900-01-29 13:51:04 | 49.924 |
| 1900-01-29 14:51:04 | 49.927 |
| 1900-01-29 15:51:04 | 49.928 |
| 1900-01-29 16:51:04 | 49.928 |
| 1900-01-29 17:51:04 | 49.928 |
| 1900-01-29 18:51:04 | 49.929 |
| 1900-01-29 19:51:04 | 49.929 |
| 1900-01-29 20:51:04 | 49.928 |
| 1900-01-29 21:51:04 | 49.929 |
| 1900-01-29 22:51:04 | 49.93 |
| 1900-01-29 23:51:04 | 49.929 |
| 1900-01-30 00:51:04 | 49.925 |
| 1900-01-30 01:51:04 | 49.926 |
| 1900-01-30 02:51:04 | 49.925 |
| 1900-01-30 03:51:04 | 49.926 |
| 1900-01-30 04:51:04 | 49.928 |
| 1900-01-30 05:51:04 | 49.929 |
| 1900-01-30 06:51:04 | 49.927 |
| 1900-01-30 07:51:04 | 49.925 |
| 1900-01-30 08:51:04 | 49.926 |
| 1900-01-30 09:51:04 | 49.928 |
| 1900-01-30 10:51:04 | 49.93 |
| 1900-01-30 11:51:04 | 49.931 |
| 1900-01-30 12:51:04 | 49.925 |
| 1900-01-30 13:51:04 | 49.922 |
| 1900-01-30 14:51:04 | 49.921 |
| 1900-01-30 15:51:04 | 49.924 |
| 1900-01-30 16:51:04 | 49.92 |
| 1900-01-30 17:51:04 | 49.919 |
| 1900-01-30 18:51:04 | 49.913 |
| 1900-01-30 19:51:04 | 49.914 |
| 1900-01-30 20:51:04 | 49.918 |
| 1900-01-30 21:51:04 | 49.924 |
| 1900-01-30 22:51:04 | 49.928 |
| 1900-01-30 23:51:04 | 49.934 |
| 1900-01-31 00:51:04 | 49.936 |
| 1900-01-31 01:51:04 | 49.938 |
| 1900-01-31 02:51:04 | 49.936 |
| 1900-01-31 03:51:04 | 49.933 |
| 1900-01-31 04:51:04 | 49.928 |
| 1900-01-31 05:51:04 | 49.922 |
| 1900-01-31 06:51:04 | 49.917 |
| 1900-01-31 07:51:04 | 49.91 |
| 1900-01-31 08:51:04 | 49.909 |
| 1900-01-31 09:51:04 | 49.91 |
| 1900-01-31 10:51:04 | 49.909 |
| 1900-01-31 11:51:04 | 49.912 |
| 1900-01-31 12:51:04 | 49.913 |
| 1900-01-31 13:51:04 | 49.916 |
| 1900-01-31 14:51:04 | 49.917 |
| 1900-01-31 15:51:04 | 49.923 |
| 1900-01-31 16:51:04 | 49.924 |
| 1900-01-31 17:51:04 | 49.923 |
| 1900-01-31 18:51:04 | 49.929 |
| 1900-01-31 19:51:04 | 49.932 |
| 1900-01-31 20:51:04 | 49.931 |
| 1900-01-31 21:51:04 | 49.934 |
| 1900-01-31 22:51:04 | 49.937 |
| 1900-01-31 23:51:04 | 49.938 |
| 1900-02-01 00:51:04 | 49.941 |
| 1900-02-01 01:51:04 | 49.943 |
| 1900-02-01 02:51:04 | 49.943 |
| 1900-02-01 03:51:04 | 49.941 |
| 1900-02-01 04:51:04 | 49.942 |
| 1900-02-01 05:51:04 | 49.943 |
| 1900-02-01 06:51:04 | 49.946 |
| 1900-02-01 07:51:04 | 49.949 |
| 1900-02-01 08:51:04 | 49.95 |
| 1900-02-01 09:51:04 | 49.949 |
| 1900-02-01 10:51:04 | 49.945 |
| 1900-02-01 11:51:04 | 49.941 |
| 1900-02-01 12:51:04 | 49.94 |
| 1900-02-01 13:51:04 | 49.939 |
| 1900-02-01 14:51:04 | 49.931 |
| 1900-02-01 15:51:04 | 49.924 |
| 1900-02-01 16:51:04 | 49.92 |
| 1900-02-01 17:51:04 | 49.918 |
| 1900-02-01 18:51:04 | 49.919 |
| 1900-02-01 19:51:04 | 49.921 |
| 1900-02-01 20:51:04 | 49.926 |
| 1900-02-01 21:51:04 | 49.929 |
| 1900-02-01 22:51:04 | 49.935 |
| 1900-02-01 23:51:04 | 49.939 |
| 1900-02-02 00:51:04 | 49.938 |
| 1900-02-02 01:51:04 | 49.94 |
| 1900-02-02 02:51:04 | 49.942 |
| 1900-02-02 03:51:04 | 49.939 |
| 1900-02-02 04:51:04 | 49.938 |
| 1900-02-02 05:51:04 | 49.933 |
| 1900-02-02 06:51:04 | 49.927 |
| 1900-02-02 07:51:04 | 49.927 |
| 1900-02-02 08:51:04 | 49.924 |
| 1900-02-02 09:51:04 | 49.923 |
| 1900-02-02 10:51:04 | 49.921 |
| 1900-02-02 11:51:04 | 49.918 |
| 1900-02-02 12:51:04 | 49.916 |
| 1900-02-02 13:51:04 | 49.917 |
| 1900-02-02 14:51:04 | 49.917 |
| 1900-02-02 15:51:04 | 49.919 |
| 1900-02-02 16:51:04 | 49.919 |
| 1900-02-02 17:51:04 | 49.917 |
| 1900-02-02 18:51:04 | 49.919 |
| 1900-02-02 19:51:04 | 49.916 |
| 1900-02-02 20:51:04 | 49.911 |
| 1900-02-02 21:51:04 | 49.913 |
| 1900-02-02 22:51:04 | 49.919 |
| 1900-02-02 23:51:04 | 49.923 |
| 1900-02-03 00:51:04 | 49.925 |
| 1900-02-03 01:51:04 | 49.925 |
| 1900-02-03 02:51:04 | 49.923 |
| 1900-02-03 03:51:04 | 49.924 |
| 1900-02-03 04:51:04 | 49.923 |
| 1900-02-03 05:51:04 | 49.924 |
| 1900-02-03 06:51:04 | 49.929 |
| 1900-02-03 07:51:04 | 49.93 |
| 1900-02-03 08:51:04 | 49.934 |
| 1900-02-03 09:51:04 | 49.936 |
| 1900-02-03 10:51:04 | 49.936 |
| 1900-02-03 11:51:04 | 49.935 |
| 1900-02-03 12:51:04 | 49.934 |
| 1900-02-03 13:51:04 | 49.934 |
| 1900-02-03 14:51:04 | 49.933 |
| 1900-02-03 15:51:04 | 49.931 |
| 1900-02-03 16:51:04 | 49.929 |
| 1900-02-03 17:51:04 | 49.929 |
| 1900-02-03 18:51:04 | 49.926 |
| 1900-02-03 19:51:04 | 49.926 |
| 1900-02-03 20:51:04 | 49.926 |
| 1900-02-03 21:51:04 | 49.922 |
| 1900-02-03 22:51:04 | 49.925 |
| 1900-02-03 23:51:04 | 49.924 |
| 1900-02-04 00:51:04 | 49.922 |
| 1900-02-04 01:51:04 | 49.921 |
| 1900-02-04 02:51:04 | 49.916 |
| 1900-02-04 03:51:04 | 49.912 |
| 1900-02-04 04:51:04 | 49.911 |
| 1900-02-04 05:51:04 | 49.912 |
| 1900-02-04 06:51:04 | 49.913 |
| 1900-02-04 07:51:04 | 49.913 |
| 1900-02-04 08:51:04 | 49.919 |
| 1900-02-04 09:51:04 | 49.927 |
| 1900-02-04 10:51:04 | 49.933 |
| 1900-02-04 11:51:04 | 49.933 |
| 1900-02-04 12:51:04 | 49.935 |
| 1900-02-04 13:51:04 | 49.938 |
| 1900-02-04 14:51:04 | 49.939 |
| 1900-02-04 15:51:04 | 49.94 |
| 1900-02-04 16:51:04 | 49.94 |
| 1900-02-04 17:51:04 | 49.94 |
| 1900-02-04 18:51:04 | 49.939 |
| 1900-02-04 19:51:04 | 49.937 |
| 1900-02-04 20:51:04 | 49.931 |
| 1900-02-04 21:51:04 | 49.929 |
| 1900-02-04 22:51:04 | 49.927 |
| 1900-02-04 23:51:04 | 49.923 |
| 1900-02-05 00:51:04 | 49.919 |
| 1900-02-05 01:51:04 | 49.916 |
| 1900-02-05 02:51:04 | 49.913 |
| 1900-02-05 03:51:04 | 49.91 |
| 1900-02-05 04:51:04 | 49.908 |
| 1900-02-05 05:51:04 | 49.907 |
| 1900-02-05 06:51:04 | 49.907 |
| 1900-02-05 07:51:04 | 49.907 |
| 1900-02-05 08:51:04 | 49.909 |
| 1900-02-05 09:51:04 | 49.911 |
| 1900-02-05 10:51:04 | 49.913 |
| 1900-02-05 11:51:04 | 49.914 |
| 1900-02-05 12:51:04 | 49.915 |
| 1900-02-05 13:51:04 | 49.917 |
| 1900-02-05 14:51:04 | 49.918 |
| 1900-02-05 15:51:04 | 49.918 |
| 1900-02-05 16:51:04 | 49.912 |
| 1900-02-05 17:51:04 | 49.911 |
| 1900-02-05 18:51:04 | 49.907 |
| 1900-02-05 19:51:04 | 49.907 |
| 1900-02-05 20:51:04 | 49.909 |
| 1900-02-05 21:51:04 | 49.913 |
| 1900-02-05 22:51:04 | 49.914 |
| 1900-02-05 23:51:04 | 49.921 |
| 1900-02-06 00:51:04 | 49.923 |
| 1900-02-06 01:51:04 | 49.927 |
| 1900-02-06 02:51:04 | 49.932 |
| 1900-02-06 03:51:04 | 49.932 |
| 1900-02-06 04:51:04 | 49.929 |
| 1900-02-06 05:51:04 | 49.929 |
| 1900-02-06 06:51:04 | 49.929 |
| 1900-02-06 07:51:04 | 49.927 |
| 1900-02-06 08:51:04 | 49.927 |
| 1900-02-06 09:51:04 | 49.926 |
| 1900-02-06 10:51:04 | 49.924 |
| 1900-02-06 11:51:04 | 49.926 |
| 1900-02-06 12:51:04 | 49.926 |
| 0.25416666666666665 | 49.926 |
| 0.25417824074074075 | 49.925 |
| 0.2541898148148148 | 49.919 |
| 0.2542013888888889 | 49.919 |
| 0.254212962962963 | 49.915 |
| 0.254224537037037 | 49.912 |
| 0.2542361111111111 | 49.91 |
| 0.2542476851851852 | 49.909 |
| 0.25425925925925924 | 49.91 |
| 0.25427083333333333 | 49.918 |
| 0.25428240740740743 | 49.922 |
| 0.25429398148148147 | 49.925 |
| 0.25430555555555556 | 49.924 |
| 0.25431712962962966 | 49.922 |
| 0.2543287037037037 | 49.924 |
| 0.2543402777777778 | 49.927 |
| 0.2543518518518519 | 49.931 |
| 0.2543634259259259 | 49.935 |
| 0.254375 | 49.935 |
| 0.25438657407407406 | 49.939 |
| 0.25439814814814815 | 49.939 |
| 0.2544097222222222 | 49.939 |
| 0.2544212962962963 | 49.935 |
| 0.2544328703703704 | 49.932 |
| 0.2544444444444444 | 49.931 |
| 0.2544560185185185 | 49.929 |
| 0.2544675925925926 | 49.93 |
| 0.25447916666666665 | 49.934 |
| 0.25449074074074074 | 49.937 |
| 0.25450231481481483 | 49.938 |
| 0.2545138888888889 | 49.938 |
| 0.25452546296296297 | 49.939 |
| 0.25453703703703706 | 49.943 |
| 0.2545486111111111 | 49.946 |
| 0.2545601851851852 | 49.95 |
| 0.2545717592592593 | 49.951 |
| 0.25458333333333333 | 49.953 |
| 0.2545949074074074 | 49.958 |
| 0.2546064814814815 | 49.961 |
| 0.25461805555555556 | 49.961 |
| 0.2546296296296296 | 49.96 |
| 0.2546412037037037 | 49.959 |
| 0.2546527777777778 | 49.958 |
| 0.2546643518518518 | 49.958 |
| 0.2546759259259259 | 49.957 |
| 0.2546875 | 49.953 |
| 0.25469907407407405 | 49.949 |
| 0.25471064814814814 | 49.949 |
| 0.25472222222222224 | 49.949 |
| 0.2547337962962963 | 49.95 |
| 0.25474537037037037 | 49.952 |
| 0.25475694444444447 | 49.957 |
| 0.2547685185185185 | 49.96 |
| 0.2547800925925926 | 49.96 |
| 0.2547916666666667 | 49.961 |
| 0.25480324074074073 | 49.962 |
| 0.2548148148148148 | 49.961 |
| 0.2548263888888889 | 49.961 |
| 0.25483796296296296 | 49.96 |
| 0.25484953703703705 | 49.961 |
| 0.2548611111111111 | 49.96 |
| 0.2548726851851852 | 49.957 |
| 0.2548842592592592 | 49.958 |
| 0.2548958333333333 | 49.955 |
| 0.2549074074074074 | 49.953 |
| 0.25491898148148145 | 49.947 |
| 0.25493055555555555 | 49.943 |
| 0.25494212962962964 | 49.94 |
| 0.2549537037037037 | 49.941 |
| 0.2549652777777778 | 49.941 |
| 0.25497685185185187 | 49.942 |
| 0.2549884259259259 | 49.94 |
| 0.255 | 49.94 |
| 0.2550115740740741 | 49.94 |
| 0.25502314814814814 | 49.938 |
| 0.25503472222222223 | 49.936 |
| 0.2550462962962963 | 49.936 |
| 0.25505787037037037 | 49.932 |
| 0.25506944444444446 | 49.929 |
| 0.25508101851851855 | 49.929 |
| 0.2550925925925926 | 49.929 |
| 0.25510416666666663 | 49.929 |
| 0.2551157407407407 | 49.93 |
| 0.2551273148148148 | 49.931 |
| 0.25513888888888886 | 49.932 |
| 0.25515046296296295 | 49.934 |
| 0.25516203703703705 | 49.939 |
| 0.2551736111111111 | 49.945 |
| 0.2551851851851852 | 49.952 |
| 0.2551967592592593 | 49.959 |
| 0.2552083333333333 | 49.964 |
| 0.2552199074074074 | 49.968 |
| 0.2552314814814815 | 49.969 |
| 0.25524305555555554 | 49.97 |
| 0.25525462962962964 | 49.969 |
| 0.25526620370370373 | 49.968 |
| 0.25527777777777777 | 49.966 |
| 0.25528935185185186 | 49.962 |
| 0.25530092592592596 | 49.961 |
| 0.2553125 | 49.961 |
| 0.2553240740740741 | 49.962 |
| 0.25533564814814813 | 49.963 |
| 0.2553472222222222 | 49.963 |
| 0.25535879629629626 | 49.966 |
| 0.25537037037037036 | 49.968 |
| 0.25538194444444445 | 49.97 |
| 0.2553935185185185 | 49.968 |
| 0.2554050925925926 | 49.969 |
| 0.2554166666666667 | 49.969 |
| 0.2554282407407407 | 49.967 |
| 0.2554398148148148 | 49.964 |
| 0.2554513888888889 | 49.963 |
| 0.25546296296296295 | 49.961 |
| 0.25547453703703704 | 49.962 |
| 0.25548611111111114 | 49.962 |
| 0.2554976851851852 | 49.962 |
| 0.25550925925925927 | 49.962 |
| 0.25552083333333336 | 49.961 |
| 0.2555324074074074 | 49.96 |
| 0.2555439814814815 | 49.961 |
| 0.2555555555555556 | 49.961 |
| 0.25556712962962963 | 49.962 |
| 0.25557870370370367 | 49.961 |
| 0.25559027777777776 | 49.962 |
| 0.25560185185185186 | 49.961 |
| 0.2556134259259259 | 49.964 |
| 0.255625 | 49.972 |
| 0.2556365740740741 | 49.975 |
| 0.2556481481481481 | 49.978 |
| 0.2556597222222222 | 49.981 |
| 0.2556712962962963 | 49.981 |
| 0.25568287037037035 | 49.979 |
| 0.25569444444444445 | 49.978 |
| 0.25570601851851854 | 49.979 |
| 0.2557175925925926 | 49.981 |
| 0.2557291666666667 | 49.984 |
| 0.25574074074074077 | 49.99 |
| 0.2557523148148148 | 49.993 |
| 0.2557638888888889 | 49.998 |
| 0.255775462962963 | 50.004 |
| 0.25578703703703703 | 50.008 |
| 0.2557986111111111 | 50.011 |
| 0.25581018518518517 | 50.011 |
| 0.25582175925925926 | 50.013 |
| 0.2558333333333333 | 50.014 |
| 0.2558449074074074 | 50.016 |
| 0.2558564814814815 | 50.015 |
| 0.25586805555555553 | 50.015 |
| 0.2558796296296296 | 50.015 |
| 0.2558912037037037 | 50.017 |
| 0.25590277777777776 | 50.016 |
| 0.25591435185185185 | 50.013 |
| 0.25592592592592595 | 50.011 |
| 0.2559375 | 50.012 |
| 0.2559490740740741 | 50.011 |
| 0.2559606481481482 | 50.012 |
| 0.2559722222222222 | 50.014 |
| 0.2559837962962963 | 50.016 |
| 0.2559953703703704 | 50.015 |
| 0.25600694444444444 | 50.014 |
| 0.25601851851851853 | 50.013 |
| 0.25603009259259263 | 50.013 |
| 0.25604166666666667 | 50.012 |
| 0.2560532407407407 | 50.005 |
| 0.2560648148148148 | 50 |
| 0.2560763888888889 | 49.998 |
| 0.25608796296296293 | 49.997 |
| 0.25609953703703703 | 49.996 |
| 0.2561111111111111 | 49.994 |
| 0.25612268518518516 | 49.994 |
| 0.25613425925925926 | 49.993 |
| 0.25614583333333335 | 49.992 |
| 0.2561574074074074 | 49.989 |
| 0.2561689814814815 | 49.989 |
| 0.2561805555555556 | 49.984 |
| 0.2561921296296296 | 49.982 |
| 0.2562037037037037 | 49.978 |
| 0.2562152777777778 | 49.976 |
| 0.25622685185185184 | 49.973 |
| 0.25623842592592594 | 49.974 |
| 0.25625000000000003 | 49.978 |
| 0.25626157407407407 | 49.981 |
| 0.25627314814814817 | 49.99 |
| 0.2562847222222222 | 49.993 |
| 0.2562962962962963 | 50.002 |
| 0.25630787037037034 | 50.006 |
| 0.25631944444444443 | 50.008 |
| 0.2563310185185185 | 50.008 |
| 0.25634259259259257 | 50.011 |
| 0.25635416666666666 | 50.012 |
| 0.25636574074074076 | 50.011 |
| 0.2563773148148148 | 50.011 |
| 0.2563888888888889 | 50.007 |
| 0.256400462962963 | 50.009 |
| 0.256412037037037 | 50.008 |
| 0.2564236111111111 | 50.011 |
| 0.2564351851851852 | 50.014 |
| 0.25644675925925925 | 50.015 |
| 0.25645833333333334 | 50.018 |
| 0.25646990740740744 | 50.021 |
| 0.2564814814814815 | 50.023 |
| 0.25649305555555557 | 50.024 |
| 0.25650462962962967 | 50.021 |
| 0.2565162037037037 | 50.017 |
| 0.25652777777777774 | 50.013 |
| 0.25653935185185184 | 50.011 |
| 0.25655092592592593 | 50.008 |
| 0.25656249999999997 | 50.005 |
| 0.25657407407407407 | 49.999 |
| 0.25658564814814816 | 50 |
| 0.2565972222222222 | 49.998 |
| 0.2566087962962963 | 49.997 |
| 0.2566203703703704 | 49.998 |
| 0.2566319444444444 | 49.999 |
| 0.2566435185185185 | 49.996 |
| 0.2566550925925926 | 49.996 |
| 0.25666666666666665 | 49.996 |
| 0.25667824074074075 | 49.996 |
| 0.25668981481481484 | 50 |
| 0.2567013888888889 | 49.999 |
| 0.256712962962963 | 49.995 |
| 0.25672453703703707 | 49.995 |
| 0.2567361111111111 | 49.996 |
| 0.25674768518518515 | 49.998 |
| 0.25675925925925924 | 50.001 |
| 0.25677083333333334 | 50.004 |
| 0.2567824074074074 | 50.004 |
| 0.25679398148148147 | 50.006 |
| 0.25680555555555556 | 50.005 |
| 0.2568171296296296 | 50 |
| 0.2568287037037037 | 49.992 |
| 0.2568402777777778 | 49.984 |
| 0.25685185185185183 | 49.977 |
| 0.2568634259259259 | 49.972 |
| 0.256875 | 49.969 |
| 0.25688657407407406 | 49.967 |
| 0.25689814814814815 | 49.963 |
| 0.25690972222222225 | 49.961 |
| 0.2569212962962963 | 49.96 |
| 0.2569328703703704 | 49.961 |
| 0.2569444444444445 | 49.961 |
| 0.2569560185185185 | 49.961 |
| 0.2569675925925926 | 49.961 |
| 0.2569791666666667 | 49.959 |
| 0.25699074074074074 | 49.96 |
| 0.2570023148148148 | 49.961 |
| 0.2570138888888889 | 49.96 |
| 0.25702546296296297 | 49.959 |
| 0.257037037037037 | 49.959 |
| 0.2570486111111111 | 49.958 |
| 0.2570601851851852 | 49.96 |
| 0.25707175925925924 | 49.961 |
| 0.25708333333333333 | 49.961 |
| 0.2570949074074074 | 49.964 |
| 0.25710648148148146 | 49.966 |
| 0.25711805555555556 | 49.966 |
| 0.25712962962962965 | 49.965 |
| 0.2571412037037037 | 49.962 |
| 0.2571527777777778 | 49.962 |
| 0.2571643518518519 | 49.964 |
| 0.2571759259259259 | 49.962 |
| 0.2571875 | 49.962 |
| 0.2571990740740741 | 49.959 |
| 0.25721064814814815 | 49.954 |
| 0.25722222222222224 | 49.95 |
| 0.2572337962962963 | 49.946 |
| 0.2572453703703704 | 49.942 |
| 0.2572569444444444 | 49.942 |
| 0.2572685185185185 | 49.94 |
| 0.2572800925925926 | 49.941 |
| 0.25729166666666664 | 49.94 |
| 0.25730324074074074 | 49.937 |
| 0.25731481481481483 | 49.939 |
| 0.25732638888888887 | 49.938 |
| 0.25733796296296296 | 49.937 |
| 0.25734953703703706 | 49.937 |
| 0.2573611111111111 | 49.934 |
| 0.2573726851851852 | 49.931 |
| 0.2573842592592593 | 49.93 |
| 0.2573958333333333 | 49.928 |
| 0.2574074074074074 | 49.925 |
| 0.2574189814814815 | 49.926 |
| 0.25743055555555555 | 49.929 |
| 0.25744212962962965 | 49.931 |
| 0.2574537037037037 | 49.932 |
| 0.2574652777777778 | 49.931 |
| 0.2574768518518518 | 49.928 |
| 0.2574884259259259 | 49.927 |
| 0.2575 | 49.926 |
| 0.25751157407407405 | 49.925 |
| 0.25752314814814814 | 49.925 |
| 0.25753472222222223 | 49.925 |
| 0.2575462962962963 | 49.925 |
| 0.25755787037037037 | 49.927 |
| 0.25756944444444446 | 49.927 |
| 0.2575810185185185 | 49.927 |
| 0.2575925925925926 | 49.925 |
| 0.2576041666666667 | 49.924 |
| 0.25761574074074073 | 49.923 |
| 0.2576273148148148 | 49.92 |
| 0.2576388888888889 | 49.917 |
| 0.25765046296296296 | 49.916 |
| 0.25766203703703705 | 49.913 |
| 0.25767361111111114 | 49.911 |
| 0.2576851851851852 | 49.906 |
| 0.2576967592592592 | 49.903 |
| 0.2577083333333333 | 49.9 |
| 0.2577199074074074 | 49.896 |
| 0.25773148148148145 | 49.894 |
| 0.25774305555555554 | 49.894 |
| 0.25775462962962964 | 49.894 |
| 0.2577662037037037 | 49.893 |
| 0.2577777777777778 | 49.895 |
| 0.25778935185185187 | 49.894 |
| 0.2578009259259259 | 49.892 |
| 0.2578125 | 49.89 |
| 0.2578240740740741 | 49.889 |
| 0.25783564814814813 | 49.887 |
| 0.2578472222222222 | 49.888 |
| 0.2578587962962963 | 49.887 |
| 0.25787037037037036 | 49.884 |
| 0.25788194444444446 | 49.883 |
| 0.25789351851851855 | 49.883 |
| 0.2579050925925926 | 49.884 |
| 0.2579166666666667 | 49.887 |
| 0.2579282407407408 | 49.889 |
| 0.2579398148148148 | 49.892 |
| 0.25795138888888886 | 49.893 |
| 0.25796296296296295 | 49.893 |
| 0.25797453703703704 | 49.896 |
| 0.2579861111111111 | 49.898 |
| 0.2579976851851852 | 49.898 |
| 0.25800925925925927 | 49.902 |
| 0.2580208333333333 | 49.906 |
| 0.2580324074074074 | 49.911 |
| 0.2580439814814815 | 49.914 |
| 0.25805555555555554 | 49.916 |
| 0.25806712962962963 | 49.917 |
| 0.2580787037037037 | 49.919 |
| 0.25809027777777777 | 49.921 |
| 0.25810185185185186 | 49.924 |
| 0.25811342592592595 | 49.925 |
| 0.258125 | 49.926 |
| 0.2581365740740741 | 49.925 |
| 0.2581481481481482 | 49.921 |
| 0.2581597222222222 | 49.92 |
| 0.2581712962962963 | 49.919 |
| 0.25818287037037035 | 49.918 |
| 0.25819444444444445 | 49.922 |
| 0.2582060185185185 | 49.925 |
| 0.2582175925925926 | 49.926 |
| 0.2582291666666667 | 49.928 |
| 0.2582407407407407 | 49.93 |
| 0.2582523148148148 | 49.931 |
| 0.2582638888888889 | 49.935 |
| 0.25827546296296294 | 49.93 |
| 0.25828703703703704 | 49.925 |
| 0.25829861111111113 | 49.92 |
| 0.25831018518518517 | 49.916 |
| 0.25832175925925926 | 49.915 |
| 0.25833333333333336 | 49.912 |
| 0.2583449074074074 | 49.911 |
| 0.2583564814814815 | 49.912 |
| 0.2583680555555556 | 49.914 |
| 0.2583796296296296 | 49.912 |
| 0.2583912037037037 | 49.908 |
| 0.25840277777777776 | 49.908 |
| 0.25841435185185185 | 49.909 |
| 0.2584259259259259 | 49.909 |
| 0.2584375 | 49.907 |
| 0.2584490740740741 | 49.907 |
| 0.2584606481481481 | 49.904 |
| 0.2584722222222222 | 49.905 |
| 0.2584837962962963 | 49.905 |
| 0.25849537037037035 | 49.906 |
| 0.25850694444444444 | 49.905 |
| 0.25851851851851854 | 49.908 |
| 0.2585300925925926 | 49.907 |
| 0.25854166666666667 | 49.907 |
| 0.25855324074074076 | 49.909 |
| 0.2585648148148148 | 49.912 |
| 0.2585763888888889 | 49.913 |
| 0.258587962962963 | 49.913 |
| 0.25859953703703703 | 49.915 |
| 0.2586111111111111 | 49.915 |
| 0.2586226851851852 | 49.916 |
| 0.25863425925925926 | 49.917 |
| 0.2586458333333333 | 49.919 |
| 0.2586574074074074 | 49.919 |
| 0.2586689814814815 | 49.918 |
| 0.2586805555555555 | 49.919 |
| 0.2586921296296296 | 49.919 |
| 0.2587037037037037 | 49.917 |
| 0.25871527777777775 | 49.919 |
| 0.25872685185185185 | 49.919 |
| 0.25873842592592594 | 49.918 |
| 0.25875 | 49.918 |
| 0.2587615740740741 | 49.915 |
| 0.25877314814814817 | 49.915 |
| 0.2587847222222222 | 49.917 |
| 0.2587962962962963 | 49.916 |
| 0.2588078703703704 | 49.915 |
| 0.25881944444444444 | 49.915 |
| 0.25883101851851853 | 49.914 |
| 0.2588425925925926 | 49.912 |
| 0.25885416666666666 | 49.914 |
| 0.25886574074074076 | 49.912 |
| 0.25887731481481485 | 49.912 |
| 0.2588888888888889 | 49.913 |
| 0.25890046296296293 | 49.915 |
| 0.258912037037037 | 49.917 |
| 0.2589236111111111 | 49.919 |
| 0.25893518518518516 | 49.918 |
| 0.25894675925925925 | 49.916 |
| 0.25895833333333335 | 49.914 |
| 0.2589699074074074 | 49.911 |
| 0.2589814814814815 | 49.908 |
| 0.2589930555555556 | 49.908 |
| 0.2590046296296296 | 49.908 |
| 0.2590162037037037 | 49.906 |
| 0.2590277777777778 | 49.908 |
| 0.25903935185185184 | 49.908 |
| 0.25905092592592593 | 49.906 |
| 0.25906250000000003 | 49.906 |
| 0.25907407407407407 | 49.906 |
| 0.25908564814814816 | 49.905 |
| 0.25909722222222226 | 49.906 |
| 0.2591087962962963 | 49.905 |
| 0.25912037037037033 | 49.906 |
| 0.25913194444444443 | 49.907 |
| 0.2591435185185185 | 49.908 |
| 0.25915509259259256 | 49.907 |
| 0.25916666666666666 | 49.906 |
| 0.25917824074074075 | 49.905 |
| 0.2591898148148148 | 49.902 |
| 0.2592013888888889 | 49.903 |
| 0.259212962962963 | 49.905 |
| 0.259224537037037 | 49.907 |
| 0.2592361111111111 | 49.908 |
| 0.2592476851851852 | 49.909 |
| 0.25925925925925924 | 49.912 |
| 0.25927083333333334 | 49.913 |
| 0.25928240740740743 | 49.916 |
| 0.2592939814814815 | 49.919 |
| 0.25930555555555557 | 49.923 |
| 0.25931712962962966 | 49.925 |
| 0.2593287037037037 | 49.925 |
| 0.2593402777777778 | 49.923 |
| 0.25935185185185183 | 49.921 |
| 0.25936342592592593 | 49.917 |
| 0.25937499999999997 | 49.916 |
| 0.25938657407407406 | 49.915 |
| 0.25939814814814816 | 49.911 |
| 0.2594097222222222 | 49.907 |
| 0.2594212962962963 | 49.904 |
| 0.2594328703703704 | 49.905 |
| 0.2594444444444444 | 49.901 |
| 0.2594560185185185 | 49.899 |
| 0.2594675925925926 | 49.899 |
| 0.25947916666666665 | 49.901 |
| 0.25949074074074074 | 49.907 |
| 0.25950231481481484 | 49.911 |
| 0.2595138888888889 | 49.915 |
| 0.25952546296296297 | 49.918 |
| 0.25953703703703707 | 49.922 |
| 0.2595486111111111 | 49.926 |
| 0.2595601851851852 | 49.925 |
| 0.2595717592592593 | 49.924 |
| 0.25958333333333333 | 49.921 |
| 0.25959490740740737 | 49.918 |
| 0.25960648148148147 | 49.914 |
| 0.25961805555555556 | 49.911 |
| 0.2596296296296296 | 49.91 |
| 0.2596412037037037 | 49.908 |
| 0.2596527777777778 | 49.907 |
| 0.2596643518518518 | 49.906 |
| 0.2596759259259259 | 49.905 |
| 0.2596875 | 49.902 |
| 0.25969907407407405 | 49.903 |
| 0.25971064814814815 | 49.901 |
| 0.25972222222222224 | 49.902 |
| 0.2597337962962963 | 49.901 |
| 0.2597453703703704 | 49.9 |
| 0.25975694444444447 | 49.898 |
| 0.2597685185185185 | 49.9 |
| 0.2597800925925926 | 49.9 |
| 0.2597916666666667 | 49.898 |
| 0.25980324074074074 | 49.897 |
| 0.25981481481481483 | 49.897 |
| 0.2598263888888889 | 49.895 |
| 0.25983796296296297 | 49.895 |
| 0.259849537037037 | 49.894 |
| 0.2598611111111111 | 49.891 |
| 0.2598726851851852 | 49.888 |
| 0.25988425925925923 | 49.887 |
| 0.2598958333333333 | 49.885 |
| 0.2599074074074074 | 49.883 |
| 0.25991898148148146 | 49.883 |
| 0.25993055555555555 | 49.884 |
| 0.25994212962962965 | 49.887 |
| 0.2599537037037037 | 49.887 |
| 0.2599652777777778 | 49.887 |
| 0.2599768518518519 | 49.886 |
| 0.2599884259259259 | 49.884 |
| 0.26 | 49.884 |
| 0.2600115740740741 | 49.885 |
| 0.26002314814814814 | 49.887 |
| 0.26003472222222224 | 49.889 |
| 0.26004629629629633 | 49.891 |
| 0.26005787037037037 | 49.893 |
| 0.2600694444444444 | 49.896 |
| 0.2600810185185185 | 49.901 |
| 0.2600925925925926 | 49.906 |
| 0.26010416666666664 | 49.91 |
| 0.26011574074074073 | 49.915 |
| 0.2601273148148148 | 49.92 |
| 0.26013888888888886 | 49.923 |
| 0.26015046296296296 | 49.928 |
| 0.26016203703703705 | 49.931 |
| 0.2601736111111111 | 49.935 |
| 0.2601851851851852 | 49.939 |
| 0.2601967592592593 | 49.94 |
| 0.2602083333333333 | 49.941 |
| 0.2602199074074074 | 49.94 |
| 0.2602314814814815 | 49.941 |
| 0.26024305555555555 | 49.941 |
| 0.26025462962962964 | 49.94 |
| 0.26026620370370374 | 49.938 |
| 0.2602777777777778 | 49.935 |
| 0.26028935185185187 | 49.933 |
| 0.2603009259259259 | 49.932 |
| 0.2603125 | 49.932 |
| 0.26032407407407404 | 49.933 |
| 0.26033564814814814 | 49.934 |
| 0.26034722222222223 | 49.934 |
| 0.26035879629629627 | 49.929 |
| 0.26037037037037036 | 49.924 |
| 0.26038194444444446 | 49.923 |
| 0.2603935185185185 | 49.92 |
| 0.2604050925925926 | 49.918 |
| 0.2604166666666667 | 49.914 |
| 0.2604282407407407 | 49.915 |
| 0.2604398148148148 | 49.916 |
| 0.2604513888888889 | 49.921 |
| 0.26046296296296295 | 49.927 |
| 0.26047453703703705 | 49.936 |
| 0.26048611111111114 | 49.942 |
| 0.2604976851851852 | 49.945 |
| 0.2605092592592593 | 49.947 |
| 0.26052083333333337 | 49.947 |
| 0.2605324074074074 | 49.949 |
| 0.26054398148148145 | 49.95 |
| 0.26055555555555554 | 49.949 |
| 0.26056712962962963 | 49.945 |
| 0.2605787037037037 | 49.943 |
| 0.26059027777777777 | 49.941 |
| 0.26060185185185186 | 49.94 |
| 0.2606134259259259 | 49.941 |
| 0.260625 | 49.943 |
| 0.2606365740740741 | 49.949 |
| 0.26064814814814813 | 49.953 |
| 0.2606597222222222 | 49.956 |
| 0.2606712962962963 | 49.962 |
| 0.26068287037037036 | 49.967 |
| 0.26069444444444445 | 49.968 |
| 0.26070601851851855 | 49.968 |
| 0.2607175925925926 | 49.966 |
| 0.2607291666666667 | 49.966 |
| 0.2607407407407408 | 49.97 |
| 0.2607523148148148 | 49.972 |
| 0.2607638888888889 | 49.97 |
| 0.260775462962963 | 49.969 |
| 0.26078703703703704 | 49.969 |
| 0.2607986111111111 | 49.968 |
| 0.2608101851851852 | 49.968 |
| 0.26082175925925927 | 49.965 |
| 0.2608333333333333 | 49.963 |
| 0.2608449074074074 | 49.964 |
| 0.2608564814814815 | 49.964 |
| 0.26086805555555553 | 49.962 |
| 0.26087962962962963 | 49.961 |
| 0.2608912037037037 | 49.959 |
| 0.26090277777777776 | 49.958 |
| 0.26091435185185186 | 49.958 |
| 0.26092592592592595 | 49.961 |
| 0.2609375 | 49.964 |
| 0.2609490740740741 | 49.965 |
| 0.2609606481481482 | 49.968 |
| 0.2609722222222222 | 49.972 |
| 0.2609837962962963 | 49.976 |
| 0.2609953703703704 | 49.98 |
| 0.26100694444444444 | 49.983 |
| 0.2610185185185185 | 49.986 |
| 0.2610300925925926 | 49.985 |
| 0.26104166666666667 | 49.986 |
| 0.2610532407407407 | 49.986 |
| 0.2610648148148148 | 49.985 |
| 0.2610763888888889 | 49.983 |
| 0.26108796296296294 | 49.983 |
| 0.26109953703703703 | 49.984 |
| 0.2611111111111111 | 49.985 |
| 0.26112268518518517 | 49.984 |
| 0.26113425925925926 | 49.982 |
| 0.26114583333333335 | 49.979 |
| 0.2611574074074074 | 49.976 |
| 0.2611689814814815 | 49.977 |
| 0.2611805555555556 | 49.975 |
| 0.2611921296296296 | 49.976 |
| 0.2612037037037037 | 49.975 |
| 0.2612152777777778 | 49.975 |
| 0.26122685185185185 | 49.977 |
| 0.26123842592592594 | 49.977 |
| 0.26125 | 49.978 |
| 0.2612615740740741 | 49.978 |
| 0.2612731481481481 | 49.982 |
| 0.2612847222222222 | 49.987 |
| 0.2612962962962963 | 49.991 |
| 0.26130787037037034 | 49.994 |
| 0.26131944444444444 | 49.997 |
| 0.26133101851851853 | 50 |
| 0.26134259259259257 | 50.002 |
| 0.26135416666666667 | 50.003 |
| 0.26136574074074076 | 50.003 |
| 0.2613773148148148 | 50.002 |
| 0.2613888888888889 | 50.002 |
| 0.261400462962963 | 50 |
| 0.261412037037037 | 49.998 |
| 0.2614236111111111 | 49.997 |
| 0.2614351851851852 | 49.998 |
| 0.26144675925925925 | 49.997 |
| 0.26145833333333335 | 49.994 |
| 0.26146990740740744 | 49.989 |
| 0.2614814814814815 | 49.982 |
| 0.2614930555555555 | 49.979 |
| 0.2615046296296296 | 49.975 |
| 0.2615162037037037 | 49.971 |
| 0.26152777777777775 | 49.968 |
| 0.26153935185185184 | 49.965 |
| 0.26155092592592594 | 49.963 |
| 0.2615625 | 49.964 |
| 0.26157407407407407 | 49.965 |
| 0.26158564814814816 | 49.967 |
| 0.2615972222222222 | 49.969 |
| 0.2616087962962963 | 49.971 |
| 0.2616203703703704 | 49.974 |
| 0.26163194444444443 | 49.978 |
| 0.2616435185185185 | 49.981 |
| 0.2616550925925926 | 49.982 |
| 0.26166666666666666 | 49.983 |
| 0.26167824074074075 | 49.984 |
| 0.26168981481481485 | 49.982 |
| 0.2617013888888889 | 49.979 |
| 0.261712962962963 | 49.973 |
| 0.261724537037037 | 49.967 |
| 0.2617361111111111 | 49.964 |
| 0.26174768518518515 | 49.962 |
| 0.26175925925925925 | 49.959 |
| 0.26177083333333334 | 49.959 |
| 0.2617824074074074 | 49.96 |
| 0.2617939814814815 | 49.96 |
| 0.26180555555555557 | 49.96 |
| 0.2618171296296296 | 49.961 |
| 0.2618287037037037 | 49.964 |
| 0.2618402777777778 | 49.965 |
| 0.26185185185185184 | 49.97 |
| 0.26186342592592593 | 49.964 |
| 0.261875 | 49.962 |
| 0.26188657407407406 | 49.955 |
| 0.26189814814814816 | 49.953 |
| 0.26190972222222225 | 49.949 |
| 0.2619212962962963 | 49.941 |
| 0.2619328703703704 | 49.936 |
| 0.2619444444444445 | 49.934 |
| 0.2619560185185185 | 49.93 |
| 0.26196759259259256 | 49.93 |
| 0.26197916666666665 | 49.93 |
| 0.26199074074074075 | 49.933 |
| 0.2620023148148148 | 49.937 |
| 0.2620138888888889 | 49.94 |
| 0.262025462962963 | 49.942 |
| 0.262037037037037 | 49.942 |
| 0.2620486111111111 | 49.944 |
| 0.2620601851851852 | 49.945 |
| 0.26207175925925924 | 49.945 |
| 0.26208333333333333 | 49.948 |
| 0.26209490740740743 | 49.95 |
| 0.26210648148148147 | 49.949 |
| 0.26211805555555556 | 49.948 |
| 0.26212962962962966 | 49.949 |
| 0.2621412037037037 | 49.95 |
| 0.2621527777777778 | 49.948 |
| 0.2621643518518519 | 49.945 |
| 0.2621759259259259 | 49.942 |
| 0.2621875 | 49.941 |
| 0.26219907407407406 | 49.94 |
| 0.26221064814814815 | 49.943 |
| 0.2622222222222222 | 49.944 |
| 0.2622337962962963 | 49.946 |
| 0.2622453703703704 | 49.952 |
| 0.2622569444444444 | 49.958 |
| 0.2622685185185185 | 49.961 |
| 0.2622800925925926 | 49.96 |
| 0.26229166666666665 | 49.959 |
| 0.26230324074074074 | 49.957 |
| 0.26231481481481483 | 49.954 |
| 0.2623263888888889 | 49.951 |
| 0.26233796296296297 | 49.946 |
| 0.26234953703703706 | 49.941 |
| 0.2623611111111111 | 49.936 |
| 0.2623726851851852 | 49.935 |
| 0.2623842592592593 | 49.939 |
| 0.26239583333333333 | 49.942 |
| 0.2624074074074074 | 49.947 |
| 0.2624189814814815 | 49.948 |
| 0.26243055555555556 | 49.948 |
| 0.2624421296296296 | 49.948 |
| 0.2624537037037037 | 49.944 |
| 0.2624652777777778 | 49.939 |
| 0.2624768518518518 | 49.934 |
| 0.2624884259259259 | 49.933 |
| 0.2625 | 49.93 |
| 0.26251157407407405 | 49.925 |
| 0.26252314814814814 | 49.925 |
| 0.26253472222222224 | 49.929 |
| 0.2625462962962963 | 49.936 |
| 0.26255787037037037 | 49.938 |
| 0.26256944444444447 | 49.938 |
| 0.2625810185185185 | 49.939 |
| 0.2625925925925926 | 49.94 |
| 0.2626041666666667 | 49.938 |
| 0.26261574074074073 | 49.937 |
| 0.2626273148148148 | 49.932 |
| 0.2626388888888889 | 49.93 |
| 0.26265046296296296 | 49.925 |
| 0.26266203703703705 | 49.923 |
| 0.2626736111111111 | 49.92 |
| 0.2626851851851852 | 49.917 |
| 0.2626967592592592 | 49.913 |
| 0.2627083333333333 | 49.912 |
| 0.2627199074074074 | 49.911 |
| 0.26273148148148145 | 49.909 |
| 0.26274305555555555 | 49.912 |
| 0.26275462962962964 | 49.912 |
| 0.2627662037037037 | 49.914 |
| 0.2627777777777778 | 49.915 |
| 0.26278935185185187 | 49.915 |
| 0.2628009259259259 | 49.914 |
| 0.2628125 | 49.915 |
| 0.2628240740740741 | 49.914 |
| 0.26283564814814814 | 49.914 |
| 0.26284722222222223 | 49.915 |
| 0.2628587962962963 | 49.922 |
| 0.26287037037037037 | 49.924 |
| 0.26288194444444446 | 49.932 |
| 0.26289351851851855 | 49.935 |
| 0.2629050925925926 | 49.939 |
| 0.26291666666666663 | 49.942 |
| 0.2629282407407407 | 49.944 |
| 0.2629398148148148 | 49.944 |
| 0.26295138888888886 | 49.947 |
| 0.26296296296296295 | 49.946 |
| 0.26297453703703705 | 49.945 |
| 0.2629861111111111 | 49.945 |
| 0.2629976851851852 | 49.944 |
| 0.2630092592592593 | 49.94 |
| 0.2630208333333333 | 49.936 |
| 0.2630324074074074 | 49.935 |
| 0.2630439814814815 | 49.937 |
| 0.26305555555555554 | 49.934 |
| 0.26306712962962964 | 49.935 |
| 0.26307870370370373 | 49.933 |
| 0.26309027777777777 | 49.931 |
| 0.26310185185185186 | 49.928 |
| 0.26311342592592596 | 49.925 |
| 0.263125 | 49.922 |
| 0.2631365740740741 | 49.915 |
| 0.26314814814814813 | 49.912 |
| 0.2631597222222222 | 49.911 |
| 0.26317129629629626 | 49.913 |
| 0.26318287037037036 | 49.915 |
| 0.26319444444444445 | 49.917 |
| 0.2632060185185185 | 49.92 |
| 0.2632175925925926 | 49.923 |
| 0.2632291666666667 | 49.925 |
| 0.2632407407407407 | 49.926 |
| 0.2632523148148148 | 49.926 |
| 0.2632638888888889 | 49.925 |
| 0.26327546296296295 | 49.925 |
| 0.26328703703703704 | 49.927 |
| 0.26329861111111114 | 49.926 |
| 0.2633101851851852 | 49.922 |
| 0.26332175925925927 | 49.92 |
| 0.26333333333333336 | 49.919 |
| 0.2633449074074074 | 49.917 |
| 0.2633564814814815 | 49.915 |
| 0.2633680555555556 | 49.91 |
| 0.26337962962962963 | 49.909 |
| 0.26339120370370367 | 49.904 |
| 0.26340277777777776 | 49.9 |
| 0.26341435185185186 | 49.899 |
| 0.2634259259259259 | 49.898 |
| 0.2634375 | 49.895 |
| 0.2634490740740741 | 49.896 |
| 0.2634606481481481 | 49.897 |
| 0.2634722222222222 | 49.897 |
| 0.2634837962962963 | 49.9 |
| 0.26349537037037035 | 49.901 |
| 0.26350694444444445 | 49.902 |
| 0.26351851851851854 | 49.902 |
| 0.2635300925925926 | 49.904 |
| 0.2635416666666667 | 49.907 |
| 0.26355324074074077 | 49.907 |
| 0.2635648148148148 | 49.911 |
| 0.2635763888888889 | 49.913 |
| 0.263587962962963 | 49.912 |
| 0.26359953703703703 | 49.911 |
| 0.26361111111111113 | 49.911 |
| 0.26362268518518517 | 49.91 |
| 0.26363425925925926 | 49.909 |
| 0.2636458333333333 | 49.907 |
| 0.2636574074074074 | 49.905 |
| 0.2636689814814815 | 49.91 |
| 0.26368055555555553 | 49.912 |
| 0.2636921296296296 | 49.913 |
| 0.2637037037037037 | 49.912 |
| 0.26371527777777776 | 49.909 |
| 0.26372685185185185 | 49.905 |
| 0.26373842592592595 | 49.905 |
| 0.26375 | 49.904 |
| 0.2637615740740741 | 49.901 |
| 0.2637731481481482 | 49.897 |
| 0.2637847222222222 | 49.895 |
| 0.2637962962962963 | 49.893 |
| 0.2638078703703704 | 49.894 |
| 0.26381944444444444 | 49.893 |
| 0.26383101851851853 | 49.893 |
| 0.26384259259259263 | 49.888 |
| 0.26385416666666667 | 49.89 |
| 0.2638657407407407 | 49.895 |
| 0.2638773148148148 | 49.894 |
| 0.2638888888888889 | 49.892 |
| 0.26390046296296293 | 49.894 |
| 0.26391203703703703 | 49.893 |
| 0.2639236111111111 | 49.893 |
| 0.26393518518518516 | 49.895 |
| 0.26394675925925926 | 49.9 |
| 0.26395833333333335 | 49.901 |
| 0.2639699074074074 | 49.897 |
| 0.2639814814814815 | 49.899 |
| 0.2639930555555556 | 49.898 |
| 0.2640046296296296 | 49.895 |
| 0.2640162037037037 | 49.889 |
| 0.2640277777777778 | 49.882 |
| 0.26403935185185184 | 49.881 |
| 0.26405092592592594 | 49.88 |
| 0.26406250000000003 | 49.877 |
| 0.26407407407407407 | 49.876 |
| 0.26408564814814817 | 49.876 |
| 0.2640972222222222 | 49.877 |
| 0.2641087962962963 | 49.88 |
| 0.26412037037037034 | 49.883 |
| 0.26413194444444443 | 49.884 |
| 0.2641435185185185 | 49.887 |
| 0.26415509259259257 | 49.888 |
| 0.26416666666666666 | 49.888 |
| 0.26417824074074076 | 49.887 |
| 0.2641898148148148 | 49.888 |
| 0.2642013888888889 | 49.894 |
| 0.264212962962963 | 49.896 |
| 0.264224537037037 | 49.899 |
| 0.2642361111111111 | 49.903 |
| 0.2642476851851852 | 49.905 |
| 0.26425925925925925 | 49.908 |
| 0.26427083333333334 | 49.91 |
| 0.26428240740740744 | 49.91 |
| 0.2642939814814815 | 49.91 |
| 0.26430555555555557 | 49.909 |
| 0.26431712962962967 | 49.908 |
| 0.2643287037037037 | 49.908 |
| 0.26434027777777774 | 49.909 |
| 0.26435185185185184 | 49.908 |
| 0.26436342592592593 | 49.907 |
| 0.26437499999999997 | 49.911 |
| 0.26438657407407407 | 49.916 |
| 0.26439814814814816 | 49.92 |
| 0.2644097222222222 | 49.92 |
| 0.2644212962962963 | 49.923 |
| 0.2644328703703704 | 49.926 |
| 0.2644444444444444 | 49.925 |
| 0.2644560185185185 | 49.925 |
| 0.2644675925925926 | 49.921 |
| 0.26447916666666665 | 49.917 |
| 0.26449074074074075 | 49.911 |
| 0.26450231481481484 | 49.911 |
| 0.2645138888888889 | 49.908 |
| 0.264525462962963 | 49.908 |
| 0.26453703703703707 | 49.909 |
| 0.2645486111111111 | 49.915 |
| 0.26456018518518515 | 49.921 |
| 0.26457175925925924 | 49.924 |
| 0.26458333333333334 | 49.931 |
| 0.2645949074074074 | 49.933 |
| 0.26460648148148147 | 49.934 |
| 0.26461805555555556 | 49.936 |
| 0.2646296296296296 | 49.939 |
| 0.2646412037037037 | 49.937 |
| 0.2646527777777778 | 49.933 |
| 0.26466435185185183 | 49.93 |
| 0.2646759259259259 | 49.927 |
| 0.2646875 | 49.922 |
| 0.26469907407407406 | 49.92 |
| 0.26471064814814815 | 49.919 |
| 0.26472222222222225 | 49.919 |
| 0.2647337962962963 | 49.919 |
| 0.2647453703703704 | 49.918 |
| 0.2647569444444445 | 49.918 |
| 0.2647685185185185 | 49.918 |
| 0.2647800925925926 | 49.919 |
| 0.2647916666666667 | 49.918 |
| 0.26480324074074074 | 49.916 |
| 0.2648148148148148 | 49.914 |
| 0.2648263888888889 | 49.914 |
| 0.26483796296296297 | 49.912 |
| 0.264849537037037 | 49.913 |
| 0.2648611111111111 | 49.916 |
| 0.2648726851851852 | 49.92 |
| 0.26488425925925924 | 49.928 |
| 0.26489583333333333 | 49.932 |
| 0.2649074074074074 | 49.933 |
| 0.26491898148148146 | 49.934 |
| 0.26493055555555556 | 49.931 |
| 0.26494212962962965 | 49.929 |
| 0.2649537037037037 | 49.928 |
| 0.2649652777777778 | 49.925 |
| 0.2649768518518519 | 49.921 |
| 0.2649884259259259 | 49.917 |
| 0.265 | 49.917 |
| 0.2650115740740741 | 49.913 |
| 0.26502314814814815 | 49.913 |
| 0.2650347222222222 | 49.911 |
| 0.2650462962962963 | 49.911 |
| 0.2650578703703704 | 49.913 |
| 0.2650694444444444 | 49.916 |
| 0.2650810185185185 | 49.918 |
| 0.2650925925925926 | 49.923 |
| 0.26510416666666664 | 49.929 |
| 0.26511574074074074 | 49.935 |
| 0.26512731481481483 | 49.938 |
| 0.26513888888888887 | 49.94 |
| 0.26515046296296296 | 49.939 |
| 0.26516203703703706 | 49.937 |
| 0.2651736111111111 | 49.937 |
| 0.2651851851851852 | 49.934 |
| 0.2651967592592593 | 49.935 |
| 0.2652083333333333 | 49.935 |
| 0.2652199074074074 | 49.936 |
| 0.2652314814814815 | 49.935 |
| 0.26524305555555555 | 49.937 |
| 0.26525462962962965 | 49.937 |
| 0.26526620370370374 | 49.936 |
| 0.2652777777777778 | 49.934 |
| 0.2652893518518518 | 49.93 |
| 0.2653009259259259 | 49.927 |
| 0.2653125 | 49.922 |
| 0.26532407407407405 | 49.919 |
| 0.26533564814814814 | 49.918 |
| 0.26534722222222223 | 49.923 |
| 0.2653587962962963 | 49.925 |
| 0.26537037037037037 | 49.926 |
| 0.26538194444444446 | 49.928 |
| 0.2653935185185185 | 49.931 |
| 0.2654050925925926 | 49.933 |
| 0.2654166666666667 | 49.935 |
| 0.26542824074074073 | 49.935 |
| 0.2654398148148148 | 49.934 |
| 0.2654513888888889 | 49.931 |
| 0.26546296296296296 | 49.929 |
| 0.26547453703703705 | 49.929 |
| 0.26548611111111114 | 49.926 |
| 0.2654976851851852 | 49.926 |
| 0.2655092592592592 | 49.925 |
| 0.2655208333333333 | 49.925 |
| 0.2655324074074074 | 49.924 |
| 0.26554398148148145 | 49.923 |
| 0.26555555555555554 | 49.926 |
| 0.26556712962962964 | 49.926 |
| 0.2655787037037037 | 49.928 |
| 0.2655902777777778 | 49.929 |
| 0.26560185185185187 | 49.932 |
| 0.2656134259259259 | 49.936 |
| 0.265625 | 49.942 |
| 0.2656365740740741 | 49.944 |
| 0.26564814814814813 | 49.946 |
| 0.2656597222222222 | 49.947 |
| 0.2656712962962963 | 49.95 |
| 0.26568287037037036 | 49.951 |
| 0.26569444444444446 | 49.953 |
| 0.26570601851851855 | 49.953 |
| 0.2657175925925926 | 49.953 |
| 0.2657291666666667 | 49.952 |
| 0.2657407407407408 | 49.949 |
| 0.2657523148148148 | 49.948 |
| 0.26576388888888886 | 49.947 |
| 0.26577546296296295 | 49.949 |
| 0.26578703703703704 | 49.949 |
| 0.2657986111111111 | 49.947 |
| 0.2658101851851852 | 49.947 |
| 0.26582175925925927 | 49.946 |
| 0.2658333333333333 | 49.943 |
| 0.2658449074074074 | 49.941 |
| 0.2658564814814815 | 49.943 |
| 0.26586805555555554 | 49.948 |
| 0.26587962962962963 | 49.95 |
| 0.2658912037037037 | 49.954 |
| 0.26590277777777777 | 49.959 |
| 0.26591435185185186 | 49.963 |
| 0.26592592592592595 | 49.966 |
| 0.2659375 | 49.966 |
| 0.2659490740740741 | 49.966 |
| 0.2659606481481482 | 49.968 |
| 0.2659722222222222 | 49.969 |
| 0.26598379629629626 | 49.969 |
| 0.26599537037037035 | 49.975 |
| 0.26600694444444445 | 49.976 |
| 0.2660185185185185 | 49.977 |
| 0.2660300925925926 | 49.978 |
| 0.2660416666666667 | 49.976 |
| 0.2660532407407407 | 49.976 |
| 0.2660648148148148 | 49.977 |
| 0.2660763888888889 | 49.979 |
| 0.26608796296296294 | 49.982 |
| 0.26609953703703704 | 49.985 |
| 0.26611111111111113 | 49.987 |
| 0.26612268518518517 | 49.985 |
| 0.26613425925925926 | 49.983 |
| 0.26614583333333336 | 49.979 |
| 0.2661574074074074 | 49.975 |
| 0.2661689814814815 | 49.972 |
| 0.2661805555555556 | 49.967 |
| 0.2661921296296296 | 49.963 |
| 0.2662037037037037 | 49.962 |
| 0.2662152777777778 | 49.962 |
| 0.26622685185185185 | 49.958 |
| 0.2662384259259259 | 49.957 |
| 0.26625 | 49.958 |
| 0.2662615740740741 | 49.959 |
| 0.2662731481481481 | 49.958 |
| 0.2662847222222222 | 49.956 |
| 0.2662962962962963 | 49.955 |
| 0.26630787037037035 | 49.956 |
| 0.26631944444444444 | 49.951 |
| 0.26633101851851854 | 49.952 |
| 0.2663425925925926 | 49.955 |
| 0.26635416666666667 | 49.959 |
| 0.26636574074074076 | 49.959 |
| 0.2663773148148148 | 49.958 |
| 0.2663888888888889 | 49.957 |
| 0.266400462962963 | 49.958 |
| 0.26641203703703703 | 49.961 |
| 0.2664236111111111 | 49.963 |
| 0.2664351851851852 | 49.968 |
| 0.26644675925925926 | 49.971 |
| 0.2664583333333333 | 49.973 |
| 0.2664699074074074 | 49.976 |
| 0.2664814814814815 | 49.979 |
| 0.2664930555555555 | 49.987 |
| 0.2665046296296296 | 49.99 |
| 0.2665162037037037 | 49.994 |
| 0.26652777777777775 | 49.998 |
| 0.26653935185185185 | 50.002 |
| 0.26655092592592594 | 50.003 |
| 0.2665625 | 50.003 |
| 0.2665740740740741 | 50.004 |
| 0.26658564814814817 | 50.006 |
| 0.2665972222222222 | 50.006 |
| 0.2666087962962963 | 50.005 |
| 0.2666203703703704 | 50.003 |
| 0.26663194444444444 | 50.001 |
| 0.26664351851851853 | 50.002 |
| 0.2666550925925926 | 49.998 |
| 0.26666666666666666 | 49.993 |
| 0.26667824074074076 | 49.988 |
| 0.26668981481481485 | 49.987 |
| 0.2667013888888889 | 49.987 |
| 0.26671296296296293 | 49.986 |
| 0.266724537037037 | 49.987 |
| 0.2667361111111111 | 49.987 |
| 0.26674768518518516 | 49.983 |
| 0.26675925925925925 | 49.982 |
| 0.26677083333333335 | 49.98 |
| 0.2667824074074074 | 49.984 |
| 0.2667939814814815 | 49.987 |
| 0.2668055555555556 | 49.988 |
| 0.2668171296296296 | 49.988 |
| 0.2668287037037037 | 49.987 |
| 0.2668402777777778 | 49.985 |
| 0.26685185185185184 | 49.983 |
| 0.26686342592592593 | 49.985 |
| 0.26687500000000003 | 49.991 |
| 0.26688657407407407 | 49.996 |
| 0.26689814814814816 | 50.001 |
| 0.26690972222222226 | 50.002 |
| 0.2669212962962963 | 50.006 |
| 0.26693287037037033 | 50.008 |
| 0.26694444444444443 | 50.011 |
| 0.2669560185185185 | 50.014 |
| 0.26696759259259256 | 50.015 |
| 0.26697916666666666 | 50.013 |
| 0.26699074074074075 | 50.015 |
| 0.2670023148148148 | 50.017 |
| 0.2670138888888889 | 50.018 |
| 0.267025462962963 | 50.023 |
| 0.267037037037037 | 50.028 |
| 0.2670486111111111 | 50.032 |
| 0.2670601851851852 | 50.031 |
| 0.26707175925925924 | 50.031 |
| 0.26708333333333334 | 50.028 |
| 0.26709490740740743 | 50.027 |
| 0.2671064814814815 | 50.026 |
| 0.26711805555555557 | 50.027 |
| 0.26712962962962966 | 50.024 |
| 0.2671412037037037 | 50.022 |
| 0.2671527777777778 | 50.021 |
| 0.26716435185185183 | 50.024 |
| 0.26717592592592593 | 50.023 |
| 0.26718749999999997 | 50.02 |
| 0.26719907407407406 | 50.016 |
| 0.26721064814814816 | 50.015 |
| 0.2672222222222222 | 50.013 |
| 0.2672337962962963 | 50.014 |
| 0.2672453703703704 | 50.016 |
| 0.2672569444444444 | 50.017 |
| 0.2672685185185185 | 50.017 |
| 0.2672800925925926 | 50.017 |
| 0.26729166666666665 | 50.016 |
| 0.26730324074074074 | 50.017 |
| 0.26731481481481484 | 50.016 |
| 0.2673263888888889 | 50.015 |
| 0.26733796296296297 | 50.012 |
| 0.26734953703703707 | 50.012 |
| 0.2673611111111111 | 50.01 |
| 0.2673726851851852 | 50.007 |
| 0.2673842592592593 | 50.004 |
| 0.26739583333333333 | 50.002 |
| 0.26740740740740737 | 50.009 |
| 0.26741898148148147 | 50.016 |
| 0.26743055555555556 | 50.023 |
| 0.2674421296296296 | 50.024 |
| 0.2674537037037037 | 50.025 |
| 0.2674652777777778 | 50.024 |
| 0.2674768518518518 | 50.023 |
| 0.2674884259259259 | 50.021 |
| 0.2675 | 50.017 |
| 0.26751157407407405 | 50.012 |
| 0.26752314814814815 | 50.008 |
| 0.26753472222222224 | 50.003 |
| 0.2675462962962963 | 50 |
| 0.2675578703703704 | 49.993 |
| 0.26756944444444447 | 49.988 |
| 0.2675810185185185 | 49.983 |
| 0.2675925925925926 | 49.978 |
| 0.2676041666666667 | 49.975 |
| 0.26761574074074074 | 49.977 |
| 0.26762731481481483 | 49.979 |
| 0.26763888888888887 | 49.979 |
| 0.26765046296296297 | 49.979 |
| 0.267662037037037 | 49.983 |
| 0.2676736111111111 | 49.985 |
| 0.2676851851851852 | 49.985 |
| 0.26769675925925923 | 49.984 |
| 0.2677083333333333 | 49.981 |
| 0.2677199074074074 | 49.977 |
| 0.26773148148148146 | 49.974 |
| 0.26774305555555555 | 49.972 |
| 0.26775462962962965 | 49.971 |
| 0.2677662037037037 | 49.968 |
| 0.2677777777777778 | 49.967 |
| 0.2677893518518519 | 49.965 |
| 0.2678009259259259 | 49.964 |
| 0.2678125 | 49.965 |
| 0.2678240740740741 | 49.966 |
| 0.26783564814814814 | 49.968 |
| 0.26784722222222224 | 49.968 |
| 0.26785879629629633 | 49.968 |
| 0.26787037037037037 | 49.968 |
| 0.2678819444444444 | 49.97 |
| 0.2678935185185185 | 49.973 |
| 0.2679050925925926 | 49.977 |
| 0.26791666666666664 | 49.979 |
| 0.26792824074074073 | 49.982 |
| 0.2679398148148148 | 49.983 |
| 0.26795138888888886 | 49.985 |
| 0.26796296296296296 | 49.986 |
| 0.26797453703703705 | 49.985 |
| 0.2679861111111111 | 49.985 |
| 0.2679976851851852 | 49.984 |
| 0.2680092592592593 | 49.981 |
| 0.2680208333333333 | 49.981 |
| 0.2680324074074074 | 49.981 |
| 0.2680439814814815 | 49.979 |
| 0.26805555555555555 | 49.979 |
| 0.26806712962962964 | 49.978 |
| 0.26807870370370374 | 49.975 |
| 0.2680902777777778 | 49.975 |
| 0.26810185185185187 | 49.973 |
| 0.2681134259259259 | 49.972 |
| 0.268125 | 49.97 |
| 0.26813657407407404 | 49.97 |
| 0.26814814814814814 | 49.97 |
| 0.26815972222222223 | 49.972 |
| 0.26817129629629627 | 49.975 |
| 0.26818287037037036 | 49.978 |
| 0.26819444444444446 | 49.977 |
| 0.2682060185185185 | 49.972 |
| 0.2682175925925926 | 49.971 |
| 0.2682291666666667 | 49.971 |
| 0.2682407407407407 | 49.968 |
| 0.2682523148148148 | 49.965 |
| 0.2682638888888889 | 49.96 |
| 0.26827546296296295 | 49.958 |
| 0.26828703703703705 | 49.956 |
| 0.26829861111111114 | 49.95 |
| 0.2683101851851852 | 49.948 |
| 0.2683217592592593 | 49.948 |
| 0.26833333333333337 | 49.948 |
| 0.2683449074074074 | 49.947 |
| 0.26835648148148145 | 49.947 |
| 0.26836805555555554 | 49.948 |
| 0.26837962962962963 | 49.948 |
| 0.2683912037037037 | 49.949 |
| 0.26840277777777777 | 49.947 |
| 0.26841435185185186 | 49.944 |
| 0.2684259259259259 | 49.942 |
| 0.2684375 | 49.943 |
| 0.2684490740740741 | 49.943 |
| 0.26846064814814813 | 49.944 |
| 0.2684722222222222 | 49.944 |
| 0.2684837962962963 | 49.943 |
| 0.26849537037037036 | 49.945 |
| 0.26850694444444445 | 49.944 |
| 0.26851851851851855 | 49.941 |
| 0.2685300925925926 | 49.939 |
| 0.2685416666666667 | 49.94 |
| 0.2685532407407408 | 49.939 |
| 0.2685648148148148 | 49.938 |
| 0.2685763888888889 | 49.937 |
| 0.26858796296296295 | 49.938 |
| 0.26859953703703704 | 49.94 |
| 0.2686111111111111 | 49.94 |
| 0.2686226851851852 | 49.939 |
| 0.26863425925925927 | 49.941 |
| 0.2686458333333333 | 49.944 |
| 0.2686574074074074 | 49.946 |
| 0.2686689814814815 | 49.951 |
| 0.26868055555555553 | 49.962 |
| 0.26869212962962963 | 49.971 |
| 0.2687037037037037 | 49.976 |
| 0.26871527777777776 | 49.978 |
| 0.26872685185185186 | 49.982 |
| 0.26873842592592595 | 49.983 |
| 0.26875 | 49.98 |
| 0.2687615740740741 | 49.98 |
| 0.2687731481481482 | 49.979 |
| 0.2687847222222222 | 49.98 |
| 0.2687962962962963 | 49.982 |
| 0.2688078703703704 | 49.983 |
| 0.26881944444444444 | 49.981 |
| 0.2688310185185185 | 49.979 |
| 0.2688425925925926 | 49.977 |
| 0.26885416666666667 | 49.974 |
| 0.2688657407407407 | 49.972 |
| 0.2688773148148148 | 49.969 |
| 0.2688888888888889 | 49.966 |
| 0.26890046296296294 | 49.964 |
| 0.26891203703703703 | 49.964 |
| 0.2689236111111111 | 49.966 |
| 0.26893518518518517 | 49.968 |
| 0.26894675925925926 | 49.969 |
| 0.26895833333333335 | 49.971 |
| 0.2689699074074074 | 49.975 |
| 0.2689814814814815 | 49.977 |
| 0.2689930555555556 | 49.978 |
| 0.2690046296296296 | 49.978 |
| 0.2690162037037037 | 49.98 |
| 0.2690277777777778 | 49.98 |
| 0.26903935185185185 | 49.98 |
| 0.26905092592592594 | 49.98 |
| 0.2690625 | 49.982 |
| 0.2690740740740741 | 49.982 |
| 0.2690856481481481 | 49.982 |
| 0.2690972222222222 | 49.982 |
| 0.2691087962962963 | 49.982 |
| 0.26912037037037034 | 49.984 |
| 0.26913194444444444 | 49.985 |
| 0.26914351851851853 | 49.985 |
| 0.26915509259259257 | 49.984 |
| 0.26916666666666667 | 49.983 |
| 0.26917824074074076 | 49.982 |
| 0.2691898148148148 | 49.982 |
| 0.2692013888888889 | 49.981 |
| 0.269212962962963 | 49.982 |
| 0.269224537037037 | 49.984 |
| 0.2692361111111111 | 49.983 |
| 0.2692476851851852 | 49.984 |
| 0.26925925925925925 | 49.984 |
| 0.26927083333333335 | 49.984 |
| 0.26928240740740744 | 49.983 |
| 0.2692939814814815 | 49.982 |
| 0.2693055555555555 | 49.981 |
| 0.2693171296296296 | 49.978 |
| 0.2693287037037037 | 49.974 |
| 0.26934027777777775 | 49.97 |
| 0.26935185185185184 | 49.969 |
| 0.26936342592592594 | 49.97 |
| 0.269375 | 49.973 |
| 0.26938657407407407 | 49.977 |
| 0.26939814814814816 | 49.979 |
| 0.2694097222222222 | 49.979 |
| 0.2694212962962963 | 49.978 |
| 0.2694328703703704 | 49.981 |
| 0.26944444444444443 | 49.982 |
| 0.2694560185185185 | 49.98 |
| 0.2694675925925926 | 49.979 |
| 0.26947916666666666 | 49.977 |
| 0.26949074074074075 | 49.978 |
| 0.26950231481481485 | 49.978 |
| 0.2695138888888889 | 49.98 |
| 0.269525462962963 | 49.984 |
| 0.269537037037037 | 49.984 |
| 0.2695486111111111 | 49.985 |
| 0.26956018518518515 | 49.985 |
| 0.26957175925925925 | 49.985 |
| 0.26958333333333334 | 49.987 |
| 0.2695949074074074 | 49.991 |
| 0.2696064814814815 | 49.995 |
| 0.26961805555555557 | 50 |
| 0.2696296296296296 | 50.002 |
| 0.2696412037037037 | 50.006 |
| 0.2696527777777778 | 50.011 |
| 0.26966435185185184 | 50.018 |
| 0.26967592592592593 | 50.022 |
| 0.2696875 | 50.021 |
| 0.26969907407407406 | 50.021 |
| 0.26971064814814816 | 50.019 |
| 0.26972222222222225 | 50.017 |
| 0.2697337962962963 | 50.016 |
| 0.2697453703703704 | 50.016 |
| 0.2697569444444445 | 50.016 |
| 0.2697685185185185 | 50.011 |
| 0.26978009259259256 | 50.008 |
| 0.26979166666666665 | 50.003 |
| 0.26980324074074075 | 50.001 |
| 0.2698148148148148 | 49.997 |
| 0.2698263888888889 | 49.993 |
| 0.269837962962963 | 49.988 |
| 0.269849537037037 | 49.987 |
| 0.2698611111111111 | 49.983 |
| 0.2698726851851852 | 49.98 |
| 0.26988425925925924 | 49.983 |
| 0.26989583333333333 | 49.984 |
| 0.26990740740740743 | 49.985 |
| 0.26991898148148147 | 49.984 |
| 0.26993055555555556 | 49.982 |
| 0.26994212962962966 | 49.981 |
| 0.2699537037037037 | 49.98 |
| 0.2699652777777778 | 49.978 |
| 0.2699768518518519 | 49.975 |
| 0.2699884259259259 | 49.972 |
| 0.27 | 49.965 |
| 0.27001157407407406 | 49.961 |
| 0.27002314814814815 | 49.954 |
| 0.2700347222222222 | 49.95 |
| 0.2700462962962963 | 49.943 |
| 0.2700578703703704 | 49.941 |
| 0.2700694444444444 | 49.941 |
| 0.2700810185185185 | 49.94 |
| 0.2700925925925926 | 49.94 |
| 0.27010416666666665 | 49.942 |
| 0.27011574074074074 | 49.943 |
| 0.27012731481481483 | 49.94 |
| 0.2701388888888889 | 49.938 |
| 0.27015046296296297 | 49.932 |
| 0.27016203703703706 | 49.928 |
| 0.2701736111111111 | 49.923 |
| 0.2701851851851852 | 49.921 |
| 0.2701967592592593 | 49.917 |
| 0.27020833333333333 | 49.917 |
| 0.2702199074074074 | 49.916 |
| 0.2702314814814815 | 49.915 |
| 0.27024305555555556 | 49.912 |
| 0.2702546296296296 | 49.912 |
| 0.2702662037037037 | 49.908 |
| 0.2702777777777778 | 49.905 |
| 0.2702893518518518 | 49.904 |
| 0.2703009259259259 | 49.905 |
| 0.2703125 | 49.906 |
| 0.27032407407407405 | 49.907 |
| 0.27033564814814814 | 49.914 |
| 0.27034722222222224 | 49.919 |
| 0.2703587962962963 | 49.923 |
| 0.27037037037037037 | 49.926 |
| 0.27038194444444447 | 49.929 |
| 0.2703935185185185 | 49.933 |
| 0.2704050925925926 | 49.935 |
| 0.2704166666666667 | 49.934 |
| 0.27042824074074073 | 49.934 |
| 0.2704398148148148 | 49.933 |
| 0.2704513888888889 | 49.93 |
| 0.27046296296296296 | 49.927 |
| 0.27047453703703705 | 49.925 |
| 0.2704861111111111 | 49.923 |
| 0.2704976851851852 | 49.922 |
| 0.2705092592592592 | 49.921 |
| 0.2705208333333333 | 49.92 |
| 0.2705324074074074 | 49.923 |
| 0.27054398148148145 | 49.924 |
| 0.27055555555555555 | 49.923 |
| 0.27056712962962964 | 49.922 |
| 0.2705787037037037 | 49.92 |
| 0.2705902777777778 | 49.92 |
| 0.27060185185185187 | 49.919 |
| 0.2706134259259259 | 49.921 |
| 0.270625 | 49.921 |
| 0.2706365740740741 | 49.92 |
| 0.27064814814814814 | 49.92 |
| 0.27065972222222223 | 49.921 |
| 0.2706712962962963 | 49.919 |
| 0.27068287037037037 | 49.919 |
| 0.27069444444444446 | 49.918 |
| 0.27070601851851855 | 49.917 |
| 0.2707175925925926 | 49.917 |
| 0.27072916666666663 | 49.918 |
| 0.2707407407407407 | 49.919 |
| 0.2707523148148148 | 49.919 |
| 0.27076388888888886 | 49.919 |
| 0.27077546296296295 | 49.917 |
| 0.27078703703703705 | 49.92 |
| 0.2707986111111111 | 49.923 |
| 0.2708101851851852 | 49.925 |
| 0.2708217592592593 | 49.924 |
| 0.2708333333333333 | 49.923 |
| 0.2708449074074074 | 49.923 |
| 0.2708564814814815 | 49.924 |
| 0.27086805555555554 | 49.919 |
| 0.27087962962962964 | 49.918 |
| 0.27089120370370373 | 49.917 |
| 0.27090277777777777 | 49.917 |
| 0.27091435185185186 | 49.92 |
| 0.27092592592592596 | 49.921 |
| 0.2709375 | 49.918 |
| 0.2709490740740741 | 49.916 |
| 0.27096064814814813 | 49.917 |
| 0.2709722222222222 | 49.914 |
| 0.27098379629629626 | 49.913 |
| 0.27099537037037036 | 49.913 |
| 0.27100694444444445 | 49.912 |
| 0.2710185185185185 | 49.916 |
| 0.2710300925925926 | 49.918 |
| 0.2710416666666667 | 49.923 |
| 0.2710532407407407 | 49.926 |
| 0.2710648148148148 | 49.929 |
| 0.2710763888888889 | 49.93 |
| 0.27108796296296295 | 49.932 |
| 0.27109953703703704 | 49.932 |
| 0.27111111111111114 | 49.935 |
| 0.2711226851851852 | 49.935 |
| 0.27113425925925927 | 49.938 |
| 0.27114583333333336 | 49.94 |
| 0.2711574074074074 | 49.944 |
| 0.2711689814814815 | 49.947 |
| 0.27118055555555554 | 49.948 |
| 0.27119212962962963 | 49.951 |
| 0.27120370370370367 | 49.955 |
| 0.27121527777777776 | 49.959 |
| 0.27122685185185186 | 49.959 |
| 0.2712384259259259 | 49.956 |
| 0.27125 | 49.957 |
| 0.2712615740740741 | 49.955 |
| 0.2712731481481481 | 49.954 |
| 0.2712847222222222 | 49.954 |
| 0.2712962962962963 | 49.952 |
| 0.27130787037037035 | 49.953 |
| 0.27131944444444445 | 49.951 |
| 0.27133101851851854 | 49.948 |
| 0.2713425925925926 | 49.946 |
| 0.2713541666666667 | 49.945 |
| 0.27136574074074077 | 49.944 |
| 0.2713773148148148 | 49.943 |
| 0.2713888888888889 | 49.943 |
| 0.271400462962963 | 49.942 |
| 0.27141203703703703 | 49.941 |
| 0.2714236111111111 | 49.938 |
| 0.2714351851851852 | 49.937 |
| 0.27144675925925926 | 49.938 |
| 0.2714583333333333 | 49.936 |
| 0.2714699074074074 | 49.932 |
| 0.2714814814814815 | 49.933 |
| 0.27149305555555553 | 49.933 |
| 0.2715046296296296 | 49.931 |
| 0.2715162037037037 | 49.934 |
| 0.27152777777777776 | 49.937 |
| 0.27153935185185185 | 49.937 |
| 0.27155092592592595 | 49.937 |
| 0.2715625 | 49.932 |
| 0.2715740740740741 | 49.931 |
| 0.2715856481481482 | 49.93 |
| 0.2715972222222222 | 49.929 |
| 0.2716087962962963 | 49.927 |
| 0.2716203703703704 | 49.926 |
| 0.27163194444444444 | 49.923 |
| 0.27164351851851853 | 49.922 |
| 0.27165509259259263 | 49.919 |
| 0.27166666666666667 | 49.917 |
| 0.2716782407407407 | 49.914 |
| 0.2716898148148148 | 49.911 |
| 0.2717013888888889 | 49.906 |
| 0.27171296296296293 | 49.903 |
| 0.27172453703703703 | 49.903 |
| 0.2717361111111111 | 49.903 |
| 0.27174768518518516 | 49.904 |
| 0.27175925925925926 | 49.903 |
| 0.27177083333333335 | 49.902 |
| 0.2717824074074074 | 49.902 |
| 0.2717939814814815 | 49.899 |
| 0.2718055555555556 | 49.901 |
| 0.2718171296296296 | 49.896 |
| 0.2718287037037037 | 49.897 |
| 0.2718402777777778 | 49.892 |
| 0.27185185185185184 | 49.887 |
| 0.27186342592592594 | 49.884 |
| 0.27187500000000003 | 49.884 |
| 0.27188657407407407 | 49.88 |
| 0.27189814814814817 | 49.878 |
| 0.2719097222222222 | 49.877 |
| 0.2719212962962963 | 49.874 |
| 0.27193287037037034 | 49.87 |
| 0.27194444444444443 | 49.866 |
| 0.2719560185185185 | 49.866 |
| 0.27196759259259257 | 49.863 |
| 0.27197916666666666 | 49.863 |
| 0.27199074074074076 | 49.866 |
| 0.2720023148148148 | 49.87 |
| 0.2720138888888889 | 49.867 |
| 0.272025462962963 | 49.868 |
| 0.272037037037037 | 49.871 |
| 0.2720486111111111 | 49.875 |
| 0.2720601851851852 | 49.881 |
| 0.27207175925925925 | 49.885 |
| 0.27208333333333334 | 49.886 |
| 0.27209490740740744 | 49.888 |
| 0.2721064814814815 | 49.891 |
| 0.27211805555555557 | 49.89 |
| 0.2721296296296296 | 49.894 |
| 0.2721412037037037 | 49.898 |
| 0.27215277777777774 | 49.902 |
| 0.27216435185185184 | 49.903 |
| 0.27217592592592593 | 49.903 |
| 0.27218749999999997 | 49.907 |
| 0.27219907407407407 | 49.906 |
| 0.27221064814814816 | 49.909 |
| 0.2722222222222222 | 49.908 |
| 0.2722337962962963 | 49.91 |
| 0.2722453703703704 | 49.908 |
| 0.2722569444444444 | 49.91 |
| 0.2722685185185185 | 49.908 |
| 0.2722800925925926 | 49.905 |
| 0.27229166666666665 | 49.904 |
| 0.27230324074074075 | 49.898 |
| 0.27231481481481484 | 49.892 |
| 0.2723263888888889 | 49.882 |
| 0.272337962962963 | 49.876 |
| 0.272349537037037 | 49.873 |
| 0.2723611111111111 | 49.875 |
| 0.27237268518518515 | 49.876 |
| 0.2723842592592593 | 49.877 |
| 0.27239583333333334 | 49.877 |
| 0.2724074074074074 | 49.875 |
| 0.27241898148148147 | 49.871 |
| 0.27243055555555556 | 49.868 |
| 0.2724421296296296 | 49.866 |
| 0.2724537037037037 | 49.862 |
| 0.2724652777777778 | 49.866 |
| 0.27247685185185183 | 49.864 |
| 0.2724884259259259 | 49.865 |
| 0.2725 | 49.866 |
| 0.27251157407407406 | 49.867 |
| 0.27252314814814815 | 49.863 |
| 0.27253472222222225 | 49.86 |
| 0.2725462962962963 | 49.855 |
| 0.2725578703703704 | 49.852 |
| 0.2725694444444445 | 49.85 |
| 0.2725810185185185 | 49.852 |
| 0.27259259259259255 | 49.853 |
| 0.2726041666666667 | 49.856 |
| 0.27261574074074074 | 49.857 |
| 0.27262731481481484 | 49.857 |
| 0.2726388888888889 | 49.857 |
| 0.27265046296296297 | 49.859 |
| 0.272662037037037 | 49.858 |
| 0.2726736111111111 | 49.862 |
| 0.2726851851851852 | 49.864 |
| 0.27269675925925924 | 49.866 |
| 0.27270833333333333 | 49.866 |
| 0.2727199074074074 | 49.865 |
| 0.27273148148148146 | 49.866 |
| 0.27274305555555556 | 49.867 |
| 0.27275462962962965 | 49.871 |
| 0.2727662037037037 | 49.872 |
| 0.2727777777777778 | 49.872 |
| 0.2727893518518519 | 49.87 |
| 0.2728009259259259 | 49.865 |
| 0.2728125 | 49.865 |
| 0.2728240740740741 | 49.864 |
| 0.27283564814814815 | 49.861 |
| 0.27284722222222224 | 49.863 |
| 0.2728587962962963 | 49.864 |
| 0.2728703703703704 | 49.867 |
| 0.2728819444444444 | 49.867 |
| 0.2728935185185185 | 49.865 |
| 0.2729050925925926 | 49.863 |
| 0.27291666666666664 | 49.859 |
| 0.27292824074074074 | 49.858 |
| 0.27293981481481483 | 49.856 |
| 0.27295138888888887 | 49.856 |
| 0.27296296296296296 | 49.86 |
| 0.27297453703703706 | 49.867 |
| 0.2729861111111111 | 49.873 |
| 0.2729976851851852 | 49.88 |
| 0.2730092592592593 | 49.883 |
| 0.2730208333333333 | 49.885 |
| 0.2730324074074074 | 49.885 |
| 0.2730439814814815 | 49.888 |
| 0.27305555555555555 | 49.891 |
| 0.27306712962962965 | 49.898 |
| 0.2730787037037037 | 49.901 |
| 0.2730902777777778 | 49.905 |
| 0.2731018518518518 | 49.912 |
| 0.2731134259259259 | 49.918 |
| 0.273125 | 49.929 |
| 0.27313657407407405 | 49.937 |
| 0.27314814814814814 | 49.942 |
| 0.27315972222222223 | 49.944 |
| 0.2731712962962963 | 49.945 |
| 0.27318287037037037 | 49.942 |
| 0.27319444444444446 | 49.938 |
| 0.2732060185185185 | 49.934 |
| 0.2732175925925926 | 49.931 |
| 0.2732291666666667 | 49.933 |
| 0.27324074074074073 | 49.933 |
| 0.2732523148148148 | 49.936 |
| 0.2732638888888889 | 49.936 |
| 0.27327546296296296 | 49.933 |
| 0.27328703703703705 | 49.93 |
| 0.2732986111111111 | 49.927 |
| 0.2733101851851852 | 49.922 |
| 0.2733217592592592 | 49.919 |
| 0.2733333333333334 | 49.918 |
| 0.2733449074074074 | 49.919 |
| 0.27335648148148145 | 49.922 |
| 0.27336805555555554 | 49.926 |
| 0.27337962962962964 | 49.928 |
| 0.2733912037037037 | 49.927 |
| 0.2734027777777778 | 49.926 |
| 0.27341435185185187 | 49.923 |
| 0.2734259259259259 | 49.922 |
| 0.2734375 | 49.916 |
| 0.2734490740740741 | 49.914 |
| 0.27346064814814813 | 49.914 |
| 0.2734722222222222 | 49.913 |
| 0.2734837962962963 | 49.912 |
| 0.27349537037037036 | 49.91 |
| 0.27350694444444446 | 49.905 |
| 0.27351851851851855 | 49.905 |
| 0.2735300925925926 | 49.901 |
| 0.2735416666666666 | 49.896 |
| 0.2735532407407408 | 49.898 |
| 0.2735648148148148 | 49.899 |
| 0.2735763888888889 | 49.9 |
| 0.27358796296296295 | 49.899 |
| 0.27359953703703704 | 49.901 |
| 0.2736111111111111 | 49.902 |
| 0.2736226851851852 | 49.906 |
| 0.27363425925925927 | 49.909 |
| 0.2736458333333333 | 49.91 |
| 0.2736574074074074 | 49.909 |
| 0.2736689814814815 | 49.91 |
| 0.27368055555555554 | 49.903 |
| 0.27369212962962963 | 49.901 |
| 0.2737037037037037 | 49.9 |
| 0.27371527777777777 | 49.9 |
| 0.27372685185185186 | 49.9 |
| 0.27373842592592595 | 49.9 |
| 0.27375 | 49.9 |
| 0.2737615740740741 | 49.901 |
| 0.2737731481481482 | 49.906 |
| 0.2737847222222222 | 49.909 |
| 0.2737962962962963 | 49.91 |
| 0.27380787037037035 | 49.911 |
| 0.27381944444444445 | 49.908 |
| 0.2738310185185185 | 49.907 |
| 0.2738425925925926 | 49.903 |
| 0.2738541666666667 | 49.901 |
| 0.2738657407407407 | 49.899 |
| 0.2738773148148148 | 49.897 |
| 0.2738888888888889 | 49.896 |
| 0.27390046296296294 | 49.896 |
| 0.27391203703703704 | 49.894 |
| 0.27392361111111113 | 49.895 |
| 0.27393518518518517 | 49.895 |
| 0.27394675925925926 | 49.895 |
| 0.27395833333333336 | 49.898 |
| 0.2739699074074074 | 49.903 |
| 0.2739814814814815 | 49.903 |
| 0.2739930555555556 | 49.905 |
| 0.2740046296296296 | 49.907 |
| 0.2740162037037037 | 49.91 |
| 0.27402777777777776 | 49.91 |
| 0.27403935185185185 | 49.91 |
| 0.2740509259259259 | 49.913 |
| 0.2740625 | 49.915 |
| 0.2740740740740741 | 49.917 |
| 0.2740856481481481 | 49.918 |
| 0.2740972222222222 | 49.918 |
| 0.2741087962962963 | 49.919 |
| 0.27412037037037035 | 49.919 |
| 0.27413194444444444 | 49.921 |
| 0.27414351851851854 | 49.918 |
| 0.2741550925925926 | 49.917 |
| 0.27416666666666667 | 49.917 |
| 0.27417824074074076 | 49.919 |
| 0.2741898148148148 | 49.919 |
| 0.2742013888888889 | 49.92 |
| 0.274212962962963 | 49.917 |
| 0.27422453703703703 | 49.917 |
| 0.2742361111111111 | 49.921 |
| 0.27424768518518516 | 49.924 |
| 0.27425925925925926 | 49.922 |
| 0.2742708333333333 | 49.921 |
| 0.27428240740740745 | 49.918 |
| 0.2742939814814815 | 49.917 |
| 0.2743055555555555 | 49.917 |
| 0.2743171296296296 | 49.916 |
| 0.2743287037037037 | 49.913 |
| 0.27434027777777775 | 49.914 |
| 0.27435185185185185 | 49.913 |
| 0.27436342592592594 | 49.912 |
| 0.274375 | 49.911 |
| 0.2743865740740741 | 49.908 |
| 0.27439814814814817 | 49.905 |
| 0.2744097222222222 | 49.905 |
| 0.2744212962962963 | 49.906 |
| 0.2744328703703704 | 49.905 |
| 0.27444444444444444 | 49.906 |
| 0.27445601851851853 | 49.908 |
| 0.2744675925925926 | 49.909 |
| 0.27447916666666666 | 49.909 |
| 0.2744907407407407 | 49.909 |
| 0.27450231481481485 | 49.909 |
| 0.2745138888888889 | 49.907 |
| 0.274525462962963 | 49.906 |
| 0.274537037037037 | 49.906 |
| 0.2745486111111111 | 49.908 |
| 0.27456018518518516 | 49.906 |
| 0.27457175925925925 | 49.906 |
| 0.27458333333333335 | 49.905 |
| 0.2745949074074074 | 49.908 |
| 0.2746064814814815 | 49.909 |
| 0.2746180555555556 | 49.913 |
| 0.2746296296296296 | 49.916 |
| 0.2746412037037037 | 49.919 |
| 0.2746527777777778 | 49.92 |
| 0.27466435185185184 | 49.922 |
| 0.27467592592592593 | 49.925 |
| 0.27468750000000003 | 49.926 |
| 0.27469907407407407 | 49.924 |
| 0.27471064814814816 | 49.923 |
| 0.27472222222222226 | 49.922 |
| 0.2747337962962963 | 49.923 |
| 0.2747453703703704 | 49.923 |
| 0.27475694444444443 | 49.921 |
| 0.2747685185185185 | 49.92 |
| 0.27478009259259256 | 49.92 |
| 0.27479166666666666 | 49.919 |
| 0.27480324074074075 | 49.919 |
| 0.2748148148148148 | 49.916 |
| 0.2748263888888889 | 49.916 |
| 0.274837962962963 | 49.918 |
| 0.274849537037037 | 49.924 |
| 0.2748611111111111 | 49.927 |
| 0.2748726851851852 | 49.931 |
| 0.27488425925925924 | 49.932 |
| 0.27489583333333334 | 49.931 |
| 0.27490740740740743 | 49.926 |
| 0.2749189814814815 | 49.924 |
| 0.27493055555555557 | 49.921 |
| 0.27494212962962966 | 49.921 |
| 0.2749537037037037 | 49.921 |
| 0.2749652777777778 | 49.921 |
| 0.27497685185185183 | 49.922 |
| 0.27498842592592593 | 49.926 |
| 0.27499999999999997 | 49.929 |
| 0.27501157407407406 | 49.929 |
| 0.27502314814814816 | 49.926 |
| 0.2750347222222222 | 49.928 |
| 0.2750462962962963 | 49.928 |
| 0.2750578703703704 | 49.928 |
| 0.2750694444444444 | 49.928 |
| 0.2750810185185185 | 49.927 |
| 0.2750925925925926 | 49.929 |
| 0.27510416666666665 | 49.932 |
| 0.27511574074074074 | 49.935 |
| 0.27512731481481484 | 49.937 |
| 0.2751388888888889 | 49.938 |
| 0.27515046296296297 | 49.938 |
| 0.27516203703703707 | 49.938 |
| 0.2751736111111111 | 49.938 |
| 0.2751851851851852 | 49.936 |
| 0.27519675925925924 | 49.934 |
| 0.27520833333333333 | 49.933 |
| 0.27521990740740737 | 49.932 |
| 0.2752314814814815 | 49.929 |
| 0.27524305555555556 | 49.93 |
| 0.2752546296296296 | 49.928 |
| 0.2752662037037037 | 49.924 |
| 0.2752777777777778 | 49.923 |
| 0.2752893518518518 | 49.923 |
| 0.2753009259259259 | 49.923 |
| 0.2753125 | 49.923 |
| 0.27532407407407405 | 49.924 |
| 0.27533564814814815 | 49.926 |
| 0.27534722222222224 | 49.926 |
| 0.2753587962962963 | 49.927 |
| 0.2753703703703704 | 49.93 |
| 0.27538194444444447 | 49.934 |
| 0.2753935185185185 | 49.936 |
| 0.2754050925925926 | 49.937 |
| 0.2754166666666667 | 49.937 |
| 0.27542824074074074 | 49.937 |
| 0.2754398148148148 | 49.937 |
| 0.2754513888888889 | 49.937 |
| 0.27546296296296297 | 49.936 |
| 0.275474537037037 | 49.935 |
| 0.2754861111111111 | 49.937 |
| 0.2754976851851852 | 49.94 |
| 0.27550925925925923 | 49.945 |
| 0.2755208333333333 | 49.948 |
| 0.2755324074074074 | 49.949 |
| 0.27554398148148146 | 49.949 |
| 0.27555555555555555 | 49.949 |
| 0.27556712962962965 | 49.951 |
| 0.2755787037037037 | 49.953 |
| 0.2755902777777778 | 49.952 |
| 0.2756018518518519 | 49.949 |
| 0.2756134259259259 | 49.948 |
| 0.275625 | 49.948 |
| 0.2756365740740741 | 49.948 |
| 0.27564814814814814 | 49.947 |
| 0.27565972222222224 | 49.949 |
| 0.27567129629629633 | 49.953 |
| 0.27568287037037037 | 49.951 |
| 0.27569444444444446 | 49.946 |
| 0.2757060185185185 | 49.94 |
| 0.2757175925925926 | 49.934 |
| 0.27572916666666664 | 49.933 |
| 0.27574074074074073 | 49.932 |
| 0.2757523148148148 | 49.93 |
| 0.27576388888888886 | 49.932 |
| 0.27577546296296296 | 49.935 |
| 0.27578703703703705 | 49.939 |
| 0.2757986111111111 | 49.945 |
| 0.2758101851851852 | 49.947 |
| 0.2758217592592593 | 49.947 |
| 0.2758333333333333 | 49.949 |
| 0.2758449074074074 | 49.95 |
| 0.2758564814814815 | 49.95 |
| 0.27586805555555555 | 49.953 |
| 0.27587962962962964 | 49.958 |
| 0.27589120370370374 | 49.96 |
| 0.2759027777777778 | 49.962 |
| 0.27591435185185187 | 49.965 |
| 0.2759259259259259 | 49.967 |
| 0.2759375 | 49.967 |
| 0.27594907407407404 | 49.967 |
| 0.27596064814814814 | 49.964 |
| 0.27597222222222223 | 49.961 |
| 0.27598379629629627 | 49.959 |
| 0.27599537037037036 | 49.959 |
| 0.27600694444444446 | 49.96 |
| 0.2760185185185185 | 49.959 |
| 0.2760300925925926 | 49.96 |
| 0.2760416666666667 | 49.96 |
| 0.2760532407407407 | 49.96 |
| 0.2760648148148148 | 49.96 |
| 0.2760763888888889 | 49.959 |
| 0.27608796296296295 | 49.961 |
| 0.27609953703703705 | 49.959 |
| 0.27611111111111114 | 49.958 |
| 0.2761226851851852 | 49.958 |
| 0.2761342592592593 | 49.958 |
| 0.2761458333333333 | 49.96 |
| 0.2761574074074074 | 49.965 |
| 0.27616898148148145 | 49.969 |
| 0.2761805555555556 | 49.972 |
| 0.27619212962962963 | 49.974 |
| 0.2762037037037037 | 49.975 |
| 0.27621527777777777 | 49.973 |
| 0.27622685185185186 | 49.974 |
| 0.2762384259259259 | 49.974 |
| 0.27625 | 49.975 |
| 0.2762615740740741 | 49.976 |
| 0.27627314814814813 | 49.977 |
| 0.2762847222222222 | 49.976 |
| 0.2762962962962963 | 49.98 |
| 0.27630787037037036 | 49.985 |
| 0.27631944444444445 | 49.986 |
| 0.27633101851851855 | 49.989 |
| 0.2763425925925926 | 49.991 |
| 0.2763541666666667 | 49.994 |
| 0.2763657407407408 | 49.995 |
| 0.2763773148148148 | 49.993 |
| 0.27638888888888885 | 49.99 |
| 0.276400462962963 | 49.99 |
| 0.27641203703703704 | 49.989 |
| 0.2764236111111111 | 49.987 |
| 0.2764351851851852 | 49.987 |
| 0.27644675925925927 | 49.983 |
| 0.2764583333333333 | 49.98 |
| 0.2764699074074074 | 49.98 |
| 0.2764814814814815 | 49.978 |
| 0.27649305555555553 | 49.976 |
| 0.27650462962962963 | 49.976 |
| 0.2765162037037037 | 49.976 |
| 0.27652777777777776 | 49.977 |
| 0.27653935185185186 | 49.979 |
| 0.27655092592592595 | 49.979 |
| 0.2765625 | 49.978 |
| 0.2765740740740741 | 49.981 |
| 0.2765856481481482 | 49.981 |
| 0.2765972222222222 | 49.981 |
| 0.2766087962962963 | 49.98 |
| 0.2766203703703704 | 49.977 |
| 0.27663194444444444 | 49.975 |
| 0.27664351851851854 | 49.976 |
| 0.2766550925925926 | 49.977 |
| 0.27666666666666667 | 49.978 |
| 0.2766782407407407 | 49.979 |
| 0.2766898148148148 | 49.979 |
| 0.2767013888888889 | 49.978 |
| 0.27671296296296294 | 49.976 |
| 0.27672453703703703 | 49.976 |
| 0.2767361111111111 | 49.977 |
| 0.27674768518518517 | 49.977 |
| 0.27675925925925926 | 49.978 |
| 0.27677083333333335 | 49.979 |
| 0.2767824074074074 | 49.978 |
| 0.2767939814814815 | 49.979 |
| 0.2768055555555556 | 49.98 |
| 0.2768171296296296 | 49.98 |
| 0.2768287037037037 | 49.977 |
| 0.2768402777777778 | 49.974 |
| 0.27685185185185185 | 49.971 |
| 0.27686342592592594 | 49.967 |
| 0.276875 | 49.965 |
| 0.2768865740740741 | 49.962 |
| 0.2768981481481481 | 49.96 |
| 0.2769097222222222 | 49.954 |
| 0.2769212962962963 | 49.949 |
| 0.27693287037037034 | 49.947 |
| 0.27694444444444444 | 49.947 |
| 0.27695601851851853 | 49.947 |
| 0.27696759259259257 | 49.95 |
| 0.27697916666666667 | 49.953 |
| 0.27699074074074076 | 49.953 |
| 0.2770023148148148 | 49.949 |
| 0.2770138888888889 | 49.943 |
| 0.277025462962963 | 49.937 |
| 0.277037037037037 | 49.927 |
| 0.2770486111111111 | 49.918 |
| 0.2770601851851852 | 49.91 |
| 0.27707175925925925 | 49.902 |
| 0.27708333333333335 | 49.893 |
| 0.2770949074074074 | 49.888 |
| 0.2771064814814815 | 49.89 |
| 0.2771180555555555 | 49.891 |
| 0.27712962962962967 | 49.891 |
| 0.2771412037037037 | 49.893 |
| 0.27715277777777775 | 49.896 |
| 0.27716435185185184 | 49.896 |
| 0.27717592592592594 | 49.894 |
| 0.2771875 | 49.895 |
| 0.27719907407407407 | 49.895 |
| 0.27721064814814816 | 49.893 |
| 0.2772222222222222 | 49.892 |
| 0.2772337962962963 | 49.892 |
| 0.2772453703703704 | 49.894 |
| 0.27725694444444443 | 49.893 |
| 0.2772685185185185 | 49.895 |
| 0.2772800925925926 | 49.898 |
| 0.27729166666666666 | 49.896 |
| 0.27730324074074075 | 49.9 |
| 0.27731481481481485 | 49.901 |
| 0.2773263888888889 | 49.9 |
| 0.2773379629629629 | 49.901 |
| 0.2773495370370371 | 49.903 |
| 0.2773611111111111 | 49.904 |
| 0.27737268518518515 | 49.905 |
| 0.27738425925925925 | 49.905 |
| 0.27739583333333334 | 49.905 |
| 0.2774074074074074 | 49.907 |
| 0.2774189814814815 | 49.906 |
| 0.27743055555555557 | 49.906 |
| 0.2774421296296296 | 49.907 |
| 0.2774537037037037 | 49.906 |
| 0.2774652777777778 | 49.905 |
| 0.27747685185185184 | 49.906 |
| 0.27748842592592593 | 49.905 |
| 0.2775 | 49.904 |
| 0.27751157407407406 | 49.905 |
| 0.27752314814814816 | 49.905 |
| 0.27753472222222225 | 49.908 |
| 0.2775462962962963 | 49.912 |
| 0.27755787037037033 | 49.913 |
| 0.2775694444444445 | 49.916 |
| 0.2775810185185185 | 49.915 |
| 0.2775925925925926 | 49.91 |
| 0.27760416666666665 | 49.907 |
| 0.27761574074074075 | 49.905 |
| 0.2776273148148148 | 49.905 |
| 0.2776388888888889 | 49.904 |
| 0.277650462962963 | 49.904 |
| 0.277662037037037 | 49.907 |
| 0.2776736111111111 | 49.913 |
| 0.2776851851851852 | 49.917 |
| 0.27769675925925924 | 49.917 |
| 0.27770833333333333 | 49.919 |
| 0.27771990740740743 | 49.924 |
| 0.27773148148148147 | 49.926 |
| 0.27774305555555556 | 49.933 |
| 0.27775462962962966 | 49.932 |
| 0.2777662037037037 | 49.931 |
| 0.2777777777777778 | 49.929 |
| 0.2777893518518519 | 49.927 |
| 0.2778009259259259 | 49.923 |
| 0.2778125 | 49.926 |
| 0.27782407407407406 | 49.932 |
| 0.27783564814814815 | 49.936 |
| 0.2778472222222222 | 49.939 |
| 0.2778587962962963 | 49.937 |
| 0.2778703703703704 | 49.934 |
| 0.2778819444444444 | 49.936 |
| 0.2778935185185185 | 49.935 |
| 0.2779050925925926 | 49.934 |
| 0.27791666666666665 | 49.931 |
| 0.27792824074074074 | 49.925 |
| 0.27793981481481483 | 49.92 |
| 0.2779513888888889 | 49.918 |
| 0.27796296296296297 | 49.911 |
| 0.27797453703703706 | 49.909 |
| 0.2779861111111111 | 49.911 |
| 0.2779976851851852 | 49.91 |
| 0.2780092592592593 | 49.911 |
| 0.27802083333333333 | 49.912 |
| 0.2780324074074074 | 49.909 |
| 0.27804398148148146 | 49.91 |
| 0.27805555555555556 | 49.91 |
| 0.2780671296296296 | 49.911 |
| 0.2780787037037037 | 49.911 |
| 0.2780902777777778 | 49.909 |
| 0.2781018518518518 | 49.915 |
| 0.2781134259259259 | 49.914 |
| 0.278125 | 49.917 |
| 0.27813657407407405 | 49.919 |
| 0.27814814814814814 | 49.922 |
| 0.27815972222222224 | 49.927 |
| 0.2781712962962963 | 49.929 |
| 0.27818287037037037 | 49.934 |
| 0.27819444444444447 | 49.937 |
| 0.2782060185185185 | 49.939 |
| 0.2782175925925926 | 49.941 |
| 0.2782291666666667 | 49.94 |
| 0.27824074074074073 | 49.942 |
| 0.2782523148148148 | 49.939 |
| 0.2782638888888889 | 49.935 |
| 0.27827546296296296 | 49.928 |
| 0.278287037037037 | 49.921 |
| 0.27829861111111115 | 49.917 |
| 0.2783101851851852 | 49.915 |
| 0.2783217592592592 | 49.915 |
| 0.2783333333333333 | 49.918 |
| 0.2783449074074074 | 49.921 |
| 0.27835648148148145 | 49.922 |
| 0.27836805555555555 | 49.926 |
| 0.27837962962962964 | 49.926 |
| 0.2783912037037037 | 49.925 |
| 0.2784027777777778 | 49.925 |
| 0.27841435185185187 | 49.923 |
| 0.2784259259259259 | 49.922 |
| 0.2784375 | 49.921 |
| 0.2784490740740741 | 49.921 |
| 0.27846064814814814 | 49.921 |
| 0.27847222222222223 | 49.924 |
| 0.2784837962962963 | 49.924 |
| 0.27849537037037037 | 49.922 |
| 0.2785069444444444 | 49.923 |
| 0.27851851851851855 | 49.922 |
| 0.2785300925925926 | 49.92 |
| 0.2785416666666667 | 49.92 |
| 0.2785532407407407 | 49.919 |
| 0.2785648148148148 | 49.917 |
| 0.27857638888888886 | 49.917 |
| 0.27858796296296295 | 49.919 |
| 0.27859953703703705 | 49.92 |
| 0.2786111111111111 | 49.921 |
| 0.2786226851851852 | 49.92 |
| 0.2786342592592593 | 49.923 |
| 0.2786458333333333 | 49.924 |
| 0.2786574074074074 | 49.924 |
| 0.2786689814814815 | 49.922 |
| 0.27868055555555554 | 49.921 |
| 0.27869212962962964 | 49.918 |
| 0.27870370370370373 | 49.917 |
| 0.27871527777777777 | 49.92 |
| 0.27872685185185186 | 49.923 |
| 0.27873842592592596 | 49.925 |
| 0.27875 | 49.927 |
| 0.2787615740740741 | 49.929 |
| 0.27877314814814813 | 49.93 |
| 0.2787847222222222 | 49.931 |
| 0.27879629629629626 | 49.931 |
| 0.27880787037037036 | 49.932 |
| 0.27881944444444445 | 49.932 |
| 0.2788310185185185 | 49.931 |
| 0.2788425925925926 | 49.932 |
| 0.2788541666666667 | 49.932 |
| 0.2788657407407407 | 49.932 |
| 0.2788773148148148 | 49.932 |
| 0.2788888888888889 | 49.931 |
| 0.27890046296296295 | 49.932 |
| 0.27891203703703704 | 49.932 |
| 0.27892361111111114 | 49.931 |
| 0.2789351851851852 | 49.929 |
| 0.27894675925925927 | 49.93 |
| 0.27895833333333336 | 49.93 |
| 0.2789699074074074 | 49.928 |
| 0.2789814814814815 | 49.926 |
| 0.27899305555555554 | 49.923 |
| 0.27900462962962963 | 49.923 |
| 0.27901620370370367 | 49.926 |
| 0.27902777777777776 | 49.925 |
| 0.27903935185185186 | 49.927 |
| 0.2790509259259259 | 49.929 |
| 0.2790625 | 49.929 |
| 0.2790740740740741 | 49.929 |
| 0.2790856481481481 | 49.928 |
| 0.2790972222222222 | 49.926 |
| 0.2791087962962963 | 49.928 |
| 0.27912037037037035 | 49.927 |
| 0.27913194444444445 | 49.923 |
| 0.27914351851851854 | 49.922 |
| 0.2791550925925926 | 49.919 |
| 0.2791666666666667 | 49.913 |
| 0.27917824074074077 | 49.906 |
| 0.2791898148148148 | 49.899 |
| 0.2792013888888889 | 49.893 |
| 0.279212962962963 | 49.893 |
| 0.27922453703703703 | 49.895 |
| 0.2792361111111111 | 49.895 |
| 0.2792476851851852 | 49.897 |
| 0.27925925925925926 | 49.9 |
| 0.2792708333333333 | 49.9 |
| 0.2792824074074074 | 49.897 |
| 0.2792939814814815 | 49.895 |
| 0.27930555555555553 | 49.895 |
| 0.2793171296296296 | 49.893 |
| 0.2793287037037037 | 49.895 |
| 0.27934027777777776 | 49.9 |
| 0.27935185185185185 | 49.903 |
| 0.27936342592592595 | 49.908 |
| 0.279375 | 49.911 |
| 0.2793865740740741 | 49.91 |
| 0.2793981481481482 | 49.909 |
| 0.2794097222222222 | 49.909 |
| 0.2794212962962963 | 49.91 |
| 0.2794328703703704 | 49.911 |
| 0.27944444444444444 | 49.911 |
| 0.2794560185185185 | 49.912 |
| 0.27946759259259263 | 49.911 |
| 0.27947916666666667 | 49.911 |
| 0.27949074074074076 | 49.914 |
| 0.2795023148148148 | 49.913 |
| 0.2795138888888889 | 49.914 |
| 0.27952546296296293 | 49.914 |
| 0.27953703703703703 | 49.913 |
| 0.2795486111111111 | 49.912 |
| 0.27956018518518516 | 49.911 |
| 0.27957175925925926 | 49.91 |
| 0.27958333333333335 | 49.91 |
| 0.2795949074074074 | 49.911 |
| 0.2796064814814815 | 49.91 |
| 0.2796180555555556 | 49.907 |
| 0.2796296296296296 | 49.904 |
| 0.2796412037037037 | 49.902 |
| 0.2796527777777778 | 49.897 |
| 0.27966435185185184 | 49.894 |
| 0.27967592592592594 | 49.893 |
| 0.27968750000000003 | 49.892 |
| 0.27969907407407407 | 49.892 |
| 0.27971064814814817 | 49.894 |
| 0.2797222222222222 | 49.892 |
| 0.2797337962962963 | 49.888 |
| 0.27974537037037034 | 49.886 |
| 0.27975694444444443 | 49.884 |
| 0.2797685185185185 | 49.883 |
| 0.27978009259259257 | 49.881 |
| 0.27979166666666666 | 49.881 |
| 0.27980324074074076 | 49.88 |
| 0.2798148148148148 | 49.879 |
| 0.2798263888888889 | 49.88 |
| 0.279837962962963 | 49.882 |
| 0.279849537037037 | 49.883 |
| 0.2798611111111111 | 49.884 |
| 0.2798726851851852 | 49.883 |
| 0.27988425925925925 | 49.881 |
| 0.27989583333333334 | 49.88 |
| 0.27990740740740744 | 49.879 |
| 0.2799189814814815 | 49.879 |
| 0.27993055555555557 | 49.881 |
| 0.2799421296296296 | 49.884 |
| 0.2799537037037037 | 49.887 |
| 0.27996527777777774 | 49.887 |
| 0.27997685185185184 | 49.888 |
| 0.27998842592592593 | 49.888 |
| 0.27999999999999997 | 49.886 |
| 0.28001157407407407 | 49.883 |
| 0.28002314814814816 | 49.881 |
| 0.2800347222222222 | 49.878 |
| 0.2800462962962963 | 49.875 |
| 0.2800578703703704 | 49.872 |
| 0.2800694444444444 | 49.874 |
| 0.2800810185185185 | 49.875 |
| 0.2800925925925926 | 49.874 |
| 0.28010416666666665 | 49.876 |
| 0.28011574074074075 | 49.877 |
| 0.28012731481481484 | 49.88 |
| 0.2801388888888889 | 49.885 |
| 0.280150462962963 | 49.891 |
| 0.280162037037037 | 49.897 |
| 0.2801736111111111 | 49.901 |
| 0.28018518518518515 | 49.902 |
| 0.2801967592592593 | 49.904 |
| 0.28020833333333334 | 49.906 |
| 0.2802199074074074 | 49.905 |
| 0.28023148148148147 | 49.903 |
| 0.28024305555555556 | 49.9 |
| 0.2802546296296296 | 49.9 |
| 0.2802662037037037 | 49.899 |
| 0.2802777777777778 | 49.897 |
| 0.28028935185185183 | 49.896 |
| 0.2803009259259259 | 49.897 |
| 0.2803125 | 49.895 |
| 0.28032407407407406 | 49.889 |
| 0.28033564814814815 | 49.888 |
| 0.28034722222222225 | 49.888 |
| 0.2803587962962963 | 49.885 |
| 0.2803703703703704 | 49.886 |
| 0.2803819444444445 | 49.889 |
| 0.2803935185185185 | 49.89 |
| 0.28040509259259255 | 49.889 |
| 0.2804166666666667 | 49.89 |
| 0.28042824074074074 | 49.888 |
| 0.28043981481481484 | 49.888 |
| 0.2804513888888889 | 49.89 |
| 0.28046296296296297 | 49.888 |
| 0.280474537037037 | 49.887 |
| 0.2804861111111111 | 49.887 |
| 0.2804976851851852 | 49.889 |
| 0.28050925925925924 | 49.895 |
| 0.28052083333333333 | 49.899 |
| 0.2805324074074074 | 49.898 |
| 0.28054398148148146 | 49.897 |
| 0.28055555555555556 | 49.896 |
| 0.28056712962962965 | 49.893 |
| 0.2805787037037037 | 49.893 |
| 0.2805902777777778 | 49.891 |
| 0.2806018518518519 | 49.887 |
| 0.2806134259259259 | 49.883 |
| 0.280625 | 49.88 |
| 0.2806365740740741 | 49.875 |
| 0.28064814814814815 | 49.872 |
| 0.28065972222222224 | 49.871 |
| 0.2806712962962963 | 49.871 |
| 0.2806828703703704 | 49.872 |
| 0.2806944444444444 | 49.874 |
| 0.2807060185185185 | 49.876 |
| 0.2807175925925926 | 49.878 |
| 0.28072916666666664 | 49.876 |
| 0.28074074074074074 | 49.872 |
| 0.28075231481481483 | 49.871 |
| 0.28076388888888887 | 49.871 |
| 0.28077546296296296 | 49.876 |
| 0.28078703703703706 | 49.882 |
| 0.2807986111111111 | 49.888 |
| 0.2808101851851852 | 49.896 |
| 0.2808217592592593 | 49.9 |
| 0.2808333333333333 | 49.905 |
| 0.2808449074074074 | 49.909 |
| 0.2808564814814815 | 49.909 |
| 0.28086805555555555 | 49.909 |
| 0.28087962962962965 | 49.91 |
| 0.2808912037037037 | 49.911 |
| 0.2809027777777778 | 49.91 |
| 0.2809143518518518 | 49.908 |
| 0.2809259259259259 | 49.909 |
| 0.2809375 | 49.91 |
| 0.28094907407407405 | 49.912 |
| 0.28096064814814814 | 49.915 |
| 0.28097222222222223 | 49.916 |
| 0.2809837962962963 | 49.914 |
| 0.28099537037037037 | 49.915 |
| 0.28100694444444446 | 49.914 |
| 0.2810185185185185 | 49.913 |
| 0.2810300925925926 | 49.913 |
| 0.2810416666666667 | 49.912 |
| 0.28105324074074073 | 49.911 |
| 0.2810648148148148 | 49.91 |
| 0.2810763888888889 | 49.912 |
| 0.28108796296296296 | 49.911 |
| 0.28109953703703705 | 49.91 |
| 0.2811111111111111 | 49.905 |
| 0.2811226851851852 | 49.903 |
| 0.2811342592592592 | 49.899 |
| 0.2811458333333334 | 49.899 |
| 0.2811574074074074 | 49.9 |
| 0.28116898148148145 | 49.9 |
| 0.28118055555555554 | 49.899 |
| 0.28119212962962964 | 49.9 |
| 0.2812037037037037 | 49.9 |
| 0.2812152777777778 | 49.901 |
| 0.28122685185185187 | 49.899 |
| 0.2812384259259259 | 49.899 |
| 0.28125 | 49.898 |
| 0.2812615740740741 | 49.895 |
| 0.28127314814814813 | 49.895 |
| 0.2812847222222222 | 49.896 |
| 0.2812962962962963 | 49.896 |
| 0.28130787037037036 | 49.896 |
| 0.28131944444444446 | 49.895 |
| 0.28133101851851855 | 49.892 |
| 0.2813425925925926 | 49.89 |
| 0.2813541666666666 | 49.889 |
| 0.2813657407407408 | 49.885 |
| 0.2813773148148148 | 49.884 |
| 0.2813888888888889 | 49.881 |
| 0.28140046296296295 | 49.882 |
| 0.28141203703703704 | 49.885 |
| 0.2814236111111111 | 49.886 |
| 0.2814351851851852 | 49.887 |
| 0.28144675925925927 | 49.887 |
| 0.2814583333333333 | 49.887 |
| 0.2814699074074074 | 49.884 |
| 0.2814814814814815 | 49.878 |
| 0.28149305555555554 | 49.872 |
| 0.28150462962962963 | 49.866 |
| 0.2815162037037037 | 49.859 |
| 0.28152777777777777 | 49.857 |
| 0.28153935185185186 | 49.855 |
| 0.28155092592592595 | 49.85 |
| 0.2815625 | 49.848 |
| 0.2815740740740741 | 49.846 |
| 0.2815856481481482 | 49.844 |
| 0.2815972222222222 | 49.846 |
| 0.2816087962962963 | 49.847 |
| 0.28162037037037035 | 49.847 |
| 0.28163194444444445 | 49.848 |
| 0.2816435185185185 | 49.845 |
| 0.2816550925925926 | 49.843 |
| 0.2816666666666667 | 49.841 |
| 0.2816782407407407 | 49.838 |
| 0.2816898148148148 | 49.836 |
| 0.2817013888888889 | 49.834 |
| 0.28171296296296294 | 49.831 |
| 0.28172453703703704 | 49.831 |
| 0.28173611111111113 | 49.83 |
| 0.28174768518518517 | 49.828 |
| 0.28175925925925926 | 49.827 |
| 0.28177083333333336 | 49.825 |
| 0.2817824074074074 | 49.822 |
| 0.2817939814814815 | 49.818 |
| 0.2818055555555556 | 49.816 |
| 0.2818171296296296 | 49.815 |
| 0.2818287037037037 | 49.816 |
| 0.28184027777777776 | 49.818 |
| 0.28185185185185185 | 49.815 |
| 0.2818634259259259 | 49.812 |
| 0.281875 | 49.813 |
| 0.2818865740740741 | 49.817 |
| 0.2818981481481481 | 49.82 |
| 0.2819097222222222 | 49.826 |
| 0.2819212962962963 | 49.831 |
| 0.28193287037037035 | 49.834 |
| 0.28194444444444444 | 49.838 |
| 0.28195601851851854 | 49.84 |
| 0.2819675925925926 | 49.841 |
| 0.28197916666666667 | 49.844 |
| 0.28199074074074076 | 49.846 |
| 0.2820023148148148 | 49.846 |
| 0.2820138888888889 | 49.848 |
| 0.282025462962963 | 49.852 |
| 0.28203703703703703 | 49.856 |
| 0.2820486111111111 | 49.861 |
| 0.28206018518518516 | 49.866 |
| 0.28207175925925926 | 49.87 |
| 0.2820833333333333 | 49.877 |
| 0.28209490740740745 | 49.888 |
| 0.2821064814814815 | 49.896 |
| 0.2821180555555555 | 49.904 |
| 0.2821296296296296 | 49.908 |
| 0.2821412037037037 | 49.912 |
| 0.28215277777777775 | 49.916 |
| 0.28216435185185185 | 49.917 |
| 0.28217592592592594 | 49.917 |
| 0.2821875 | 49.916 |
| 0.2821990740740741 | 49.912 |
| 0.28221064814814817 | 49.911 |
| 0.2822222222222222 | 49.91 |
| 0.2822337962962963 | 49.91 |
| 0.2822453703703704 | 49.908 |
| 0.28225694444444444 | 49.908 |
| 0.28226851851851853 | 49.909 |
| 0.2822800925925926 | 49.913 |
| 0.28229166666666666 | 49.916 |
| 0.2823032407407407 | 49.918 |
| 0.28231481481481485 | 49.919 |
| 0.2823263888888889 | 49.921 |
| 0.282337962962963 | 49.92 |
| 0.282349537037037 | 49.918 |
| 0.2823611111111111 | 49.918 |
| 0.28237268518518516 | 49.915 |
| 0.28238425925925925 | 49.913 |
| 0.28239583333333335 | 49.912 |
| 0.2824074074074074 | 49.91 |
| 0.2824189814814815 | 49.91 |
| 0.2824305555555556 | 49.914 |
| 0.2824421296296296 | 49.917 |
| 0.2824537037037037 | 49.92 |
| 0.2824652777777778 | 49.922 |
| 0.28247685185185184 | 49.921 |
| 0.28248842592592593 | 49.926 |
| 0.28250000000000003 | 49.931 |
| 0.28251157407407407 | 49.933 |
| 0.28252314814814816 | 49.937 |
| 0.28253472222222226 | 49.942 |
| 0.2825462962962963 | 49.949 |
| 0.2825578703703704 | 49.955 |
| 0.28256944444444443 | 49.96 |
| 0.2825810185185185 | 49.965 |
| 0.28259259259259256 | 49.971 |
| 0.28260416666666666 | 49.976 |
| 0.28261574074074075 | 49.977 |
| 0.2826273148148148 | 49.979 |
| 0.2826388888888889 | 49.977 |
| 0.282650462962963 | 49.976 |
| 0.282662037037037 | 49.974 |
| 0.2826736111111111 | 49.974 |
| 0.2826851851851852 | 49.972 |
| 0.28269675925925924 | 49.973 |
| 0.28270833333333334 | 49.976 |
| 0.28271990740740743 | 49.98 |
| 0.2827314814814815 | 49.984 |
| 0.28274305555555557 | 49.988 |
| 0.28275462962962966 | 49.991 |
| 0.2827662037037037 | 49.993 |
| 0.2827777777777778 | 49.997 |
| 0.28278935185185183 | 49.998 |
| 0.28280092592592593 | 50 |
| 0.28281249999999997 | 50.006 |
| 0.28282407407407406 | 50.011 |
| 0.28283564814814816 | 50.018 |
| 0.2828472222222222 | 50.025 |
| 0.2828587962962963 | 50.032 |
| 0.2828703703703704 | 50.038 |
| 0.2828819444444444 | 50.04 |
| 0.2828935185185185 | 50.039 |
| 0.2829050925925926 | 50.037 |
| 0.28291666666666665 | 50.035 |
| 0.28292824074074074 | 50.031 |
| 0.28293981481481484 | 50.031 |
| 0.2829513888888889 | 50.031 |
| 0.28296296296296297 | 50.029 |
| 0.28297453703703707 | 50.029 |
| 0.2829861111111111 | 50.031 |
| 0.2829976851851852 | 50.035 |
| 0.28300925925925924 | 50.039 |
| 0.28302083333333333 | 50.043 |
| 0.28303240740740737 | 50.044 |
| 0.2830439814814815 | 50.049 |
| 0.28305555555555556 | 50.049 |
| 0.2830671296296296 | 50.048 |
| 0.2830787037037037 | 50.051 |
| 0.2830902777777778 | 50.053 |
| 0.2831018518518518 | 50.056 |
| 0.2831134259259259 | 50.059 |
| 0.283125 | 50.062 |
| 0.28313657407407405 | 50.065 |
| 0.28314814814814815 | 50.066 |
| 0.28315972222222224 | 50.067 |
| 0.2831712962962963 | 50.069 |
| 0.2831828703703704 | 50.066 |
| 0.28319444444444447 | 50.063 |
| 0.2832060185185185 | 50.06 |
| 0.2832175925925926 | 50.06 |
| 0.2832291666666667 | 50.059 |
| 0.28324074074074074 | 50.056 |
| 0.2832523148148148 | 50.056 |
| 0.2832638888888889 | 50.059 |
| 0.28327546296296297 | 50.058 |
| 0.283287037037037 | 50.057 |
| 0.2832986111111111 | 50.059 |
| 0.2833101851851852 | 50.059 |
| 0.28332175925925923 | 50.061 |
| 0.2833333333333333 | 50.061 |
| 0.2833449074074074 | 50.059 |
| 0.28335648148148146 | 50.059 |
| 0.28336805555555555 | 50.059 |
| 0.28337962962962965 | 50.056 |
| 0.2833912037037037 | 50.054 |
| 0.2834027777777778 | 50.056 |
| 0.2834143518518519 | 50.055 |
| 0.2834259259259259 | 50.055 |
| 0.2834375 | 50.054 |
| 0.2834490740740741 | 50.054 |
| 0.28346064814814814 | 50.054 |
| 0.28347222222222224 | 50.055 |
| 0.28348379629629633 | 50.055 |
| 0.28349537037037037 | 50.053 |
| 0.28350694444444446 | 50.05 |
| 0.2835185185185185 | 50.048 |
| 0.2835300925925926 | 50.049 |
| 0.28354166666666664 | 50.052 |
| 0.28355324074074073 | 50.053 |
| 0.2835648148148148 | 50.054 |
| 0.28357638888888886 | 50.052 |
| 0.28358796296296296 | 50.052 |
| 0.28359953703703705 | 50.052 |
| 0.2836111111111111 | 50.05 |
| 0.2836226851851852 | 50.051 |
| 0.2836342592592593 | 50.049 |
| 0.2836458333333333 | 50.051 |
| 0.2836574074074074 | 50.052 |
| 0.2836689814814815 | 50.05 |
| 0.28368055555555555 | 50.047 |
| 0.28369212962962964 | 50.045 |
| 0.28370370370370374 | 50.046 |
| 0.2837152777777778 | 50.048 |
| 0.28372685185185187 | 50.053 |
| 0.2837384259259259 | 50.055 |
| 0.28375 | 50.056 |
| 0.28376157407407404 | 50.055 |
| 0.28377314814814814 | 50.054 |
| 0.28378472222222223 | 50.052 |
| 0.28379629629629627 | 50.05 |
| 0.28380787037037036 | 50.049 |
| 0.28381944444444446 | 50.046 |
| 0.2838310185185185 | 50.043 |
| 0.2838425925925926 | 50.046 |
| 0.2838541666666667 | 50.047 |
| 0.2838657407407407 | 50.05 |
| 0.2838773148148148 | 50.053 |
| 0.2838888888888889 | 50.054 |
| 0.28390046296296295 | 50.052 |
| 0.28391203703703705 | 50.051 |
| 0.28392361111111114 | 50.053 |
| 0.2839351851851852 | 50.054 |
| 0.2839467592592593 | 50.053 |
| 0.2839583333333333 | 50.054 |
| 0.2839699074074074 | 50.055 |
| 0.28398148148148145 | 50.055 |
| 0.2839930555555556 | 50.056 |
| 0.28400462962962963 | 50.054 |
| 0.2840162037037037 | 50.054 |
| 0.28402777777777777 | 50.054 |
| 0.28403935185185186 | 50.052 |
| 0.2840509259259259 | 50.05 |
| 0.2840625 | 50.047 |
| 0.2840740740740741 | 50.042 |
| 0.28408564814814813 | 50.039 |
| 0.2840972222222222 | 50.04 |
| 0.2841087962962963 | 50.04 |
| 0.28412037037037036 | 50.04 |
| 0.28413194444444445 | 50.041 |
| 0.28414351851851855 | 50.04 |
| 0.2841550925925926 | 50.035 |
| 0.2841666666666667 | 50.032 |
| 0.2841782407407408 | 50.027 |
| 0.2841898148148148 | 50.021 |
| 0.28420138888888885 | 50.017 |
| 0.284212962962963 | 50.013 |
| 0.28422453703703704 | 50.009 |
| 0.2842361111111111 | 50.008 |
| 0.2842476851851852 | 50.007 |
| 0.28425925925925927 | 50.006 |
| 0.2842708333333333 | 50.008 |
| 0.2842824074074074 | 50.013 |
| 0.2842939814814815 | 50.016 |
| 0.28430555555555553 | 50.019 |
| 0.28431712962962963 | 50.025 |
| 0.2843287037037037 | 50.027 |
| 0.28434027777777776 | 50.025 |
| 0.28435185185185186 | 50.025 |
| 0.28436342592592595 | 50.027 |
| 0.284375 | 50.028 |
| 0.2843865740740741 | 50.028 |
| 0.2843981481481482 | 50.031 |
| 0.2844097222222222 | 50.033 |
| 0.2844212962962963 | 50.033 |
| 0.2844328703703704 | 50.032 |
| 0.28444444444444444 | 50.032 |
| 0.28445601851851854 | 50.029 |
| 0.2844675925925926 | 50.029 |
| 0.28447916666666667 | 50.025 |
| 0.2844907407407407 | 50.024 |
| 0.2845023148148148 | 50.021 |
| 0.2845138888888889 | 50.019 |
| 0.28452546296296294 | 50.014 |
| 0.28453703703703703 | 50.011 |
| 0.2845486111111111 | 50.01 |
| 0.28456018518518517 | 50.009 |
| 0.28457175925925926 | 50.008 |
| 0.28458333333333335 | 50.01 |
| 0.2845949074074074 | 50.014 |
| 0.2846064814814815 | 50.018 |
| 0.2846180555555556 | 50.021 |
| 0.2846296296296296 | 50.024 |
| 0.2846412037037037 | 50.027 |
| 0.2846527777777778 | 50.029 |
| 0.28466435185185185 | 50.033 |
| 0.28467592592592594 | 50.033 |
| 0.2846875 | 50.033 |
| 0.2846990740740741 | 50.033 |
| 0.2847106481481481 | 50.031 |
| 0.2847222222222222 | 50.027 |
| 0.2847337962962963 | 50.025 |
| 0.28474537037037034 | 50.026 |
| 0.28475694444444444 | 50.028 |
| 0.28476851851851853 | 50.032 |
| 0.28478009259259257 | 50.036 |
| 0.28479166666666667 | 50.04 |
| 0.28480324074074076 | 50.045 |
| 0.2848148148148148 | 50.05 |
| 0.2848263888888889 | 50.056 |
| 0.284837962962963 | 50.06 |
| 0.284849537037037 | 50.061 |
| 0.2848611111111111 | 50.061 |
| 0.2848726851851852 | 50.058 |
| 0.28488425925925925 | 50.054 |
| 0.28489583333333335 | 50.053 |
| 0.2849074074074074 | 50.054 |
| 0.2849189814814815 | 50.056 |
| 0.2849305555555555 | 50.057 |
| 0.28494212962962967 | 50.057 |
| 0.2849537037037037 | 50.058 |
| 0.28496527777777775 | 50.057 |
| 0.28497685185185184 | 50.054 |
| 0.28498842592592594 | 50.052 |
| 0.285 | 50.052 |
| 0.28501157407407407 | 50.049 |
| 0.28502314814814816 | 50.048 |
| 0.2850347222222222 | 50.046 |
| 0.2850462962962963 | 50.047 |
| 0.2850578703703704 | 50.048 |
| 0.28506944444444443 | 50.047 |
| 0.2850810185185185 | 50.047 |
| 0.2850925925925926 | 50.048 |
| 0.28510416666666666 | 50.047 |
| 0.28511574074074075 | 50.049 |
| 0.28512731481481485 | 50.05 |
| 0.2851388888888889 | 50.052 |
| 0.2851504629629629 | 50.051 |
| 0.2851620370370371 | 50.053 |
| 0.2851736111111111 | 50.054 |
| 0.28518518518518515 | 50.052 |
| 0.28519675925925925 | 50.049 |
| 0.28520833333333334 | 50.048 |
| 0.2852199074074074 | 50.047 |
| 0.2852314814814815 | 50.048 |
| 0.28524305555555557 | 50.051 |
| 0.2852546296296296 | 50.052 |
| 0.2852662037037037 | 50.053 |
| 0.2852777777777778 | 50.055 |
| 0.28528935185185184 | 50.056 |
| 0.28530092592592593 | 50.056 |
| 0.2853125 | 50.055 |
| 0.28532407407407406 | 50.051 |
| 0.28533564814814816 | 50.049 |
| 0.28534722222222225 | 50.051 |
| 0.2853587962962963 | 50.05 |
| 0.28537037037037033 | 50.046 |
| 0.2853819444444445 | 50.049 |
| 0.2853935185185185 | 50.053 |
| 0.2854050925925926 | 50.054 |
| 0.28541666666666665 | 50.055 |
| 0.28542824074074075 | 50.052 |
| 0.2854398148148148 | 50.051 |
| 0.2854513888888889 | 50.053 |
| 0.285462962962963 | 50.054 |
| 0.285474537037037 | 50.054 |
| 0.2854861111111111 | 50.054 |
| 0.2854976851851852 | 50.052 |
| 0.28550925925925924 | 50.052 |
| 0.28552083333333333 | 50.052 |
| 0.28553240740740743 | 50.051 |
| 0.28554398148148147 | 50.05 |
| 0.28555555555555556 | 50.046 |
| 0.28556712962962966 | 50.042 |
| 0.2855787037037037 | 50.039 |
| 0.2855902777777778 | 50.037 |
| 0.2856018518518519 | 50.036 |
| 0.2856134259259259 | 50.034 |
| 0.285625 | 50.032 |
| 0.28563657407407406 | 50.034 |
| 0.28564814814814815 | 50.032 |
| 0.2856597222222222 | 50.028 |
| 0.2856712962962963 | 50.026 |
| 0.2856828703703704 | 50.021 |
| 0.2856944444444444 | 50.016 |
| 0.2857060185185185 | 50.015 |
| 0.2857175925925926 | 50.014 |
| 0.28572916666666665 | 50.016 |
| 0.28574074074074074 | 50.019 |
| 0.28575231481481483 | 50.019 |
| 0.2857638888888889 | 50.021 |
| 0.28577546296296297 | 50.022 |
| 0.28578703703703706 | 50.021 |
| 0.2857986111111111 | 50.02 |
| 0.2858101851851852 | 50.018 |
| 0.2858217592592593 | 50.018 |
| 0.28583333333333333 | 50.019 |
| 0.2858449074074074 | 50.019 |
| 0.28585648148148146 | 50.022 |
| 0.28586805555555556 | 50.024 |
| 0.2858796296296296 | 50.024 |
| 0.2858912037037037 | 50.028 |
| 0.2859027777777778 | 50.032 |
| 0.2859143518518518 | 50.032 |
| 0.2859259259259259 | 50.032 |
| 0.2859375 | 50.031 |
| 0.28594907407407405 | 50.03 |
| 0.28596064814814814 | 50.032 |
| 0.28597222222222224 | 50.035 |
| 0.2859837962962963 | 50.036 |
| 0.28599537037037037 | 50.035 |
| 0.28600694444444447 | 50.031 |
| 0.2860185185185185 | 50.027 |
| 0.2860300925925926 | 50.026 |
| 0.2860416666666667 | 50.027 |
| 0.28605324074074073 | 50.026 |
| 0.2860648148148148 | 50.031 |
| 0.2860763888888889 | 50.035 |
| 0.28608796296296296 | 50.033 |
| 0.286099537037037 | 50.031 |
| 0.28611111111111115 | 50.03 |
| 0.2861226851851852 | 50.03 |
| 0.2861342592592592 | 50.03 |
| 0.2861458333333333 | 50.031 |
| 0.2861574074074074 | 50.03 |
| 0.28616898148148145 | 50.029 |
| 0.28618055555555555 | 50.032 |
| 0.28619212962962964 | 50.035 |
| 0.2862037037037037 | 50.037 |
| 0.2862152777777778 | 50.036 |
| 0.28622685185185187 | 50.037 |
| 0.2862384259259259 | 50.035 |
| 0.28625 | 50.033 |
| 0.2862615740740741 | 50.033 |
| 0.28627314814814814 | 50.03 |
| 0.28628472222222223 | 50.026 |
| 0.2862962962962963 | 50.022 |
| 0.28630787037037037 | 50.017 |
| 0.2863194444444444 | 50.012 |
| 0.28633101851851855 | 50.008 |
| 0.2863425925925926 | 50.003 |
| 0.2863541666666667 | 49.999 |
| 0.2863657407407407 | 49.997 |
| 0.2863773148148148 | 49.992 |
| 0.28638888888888886 | 49.99 |
| 0.28640046296296295 | 49.989 |
| 0.28641203703703705 | 49.989 |
| 0.2864236111111111 | 49.988 |
| 0.2864351851851852 | 49.989 |
| 0.2864467592592593 | 49.99 |
| 0.2864583333333333 | 49.988 |
| 0.2864699074074074 | 49.988 |
| 0.2864814814814815 | 49.986 |
| 0.28649305555555554 | 49.984 |
| 0.28650462962962964 | 49.984 |
| 0.28651620370370373 | 49.984 |
| 0.28652777777777777 | 49.98 |
| 0.28653935185185186 | 49.976 |
| 0.28655092592592596 | 49.967 |
| 0.2865625 | 49.967 |
| 0.2865740740740741 | 49.963 |
| 0.28658564814814813 | 49.961 |
| 0.2865972222222222 | 49.963 |
| 0.28660879629629626 | 49.963 |
| 0.28662037037037036 | 49.965 |
| 0.28663194444444445 | 49.97 |
| 0.2866435185185185 | 49.975 |
| 0.2866550925925926 | 49.978 |
| 0.2866666666666667 | 49.982 |
| 0.2866782407407407 | 49.986 |
| 0.2866898148148148 | 49.986 |
| 0.2867013888888889 | 49.983 |
| 0.28671296296296295 | 49.982 |
| 0.28672453703703704 | 49.98 |
| 0.28673611111111114 | 49.983 |
| 0.2867476851851852 | 49.983 |
| 0.28675925925925927 | 49.981 |
| 0.28677083333333336 | 49.978 |
| 0.2867824074074074 | 49.977 |
| 0.2867939814814815 | 49.977 |
| 0.28680555555555554 | 49.976 |
| 0.28681712962962963 | 49.972 |
| 0.28682870370370367 | 49.973 |
| 0.28684027777777776 | 49.977 |
| 0.28685185185185186 | 49.981 |
| 0.2868634259259259 | 49.984 |
| 0.286875 | 49.984 |
| 0.2868865740740741 | 49.982 |
| 0.2868981481481481 | 49.98 |
| 0.2869097222222222 | 49.978 |
| 0.2869212962962963 | 49.978 |
| 0.28693287037037035 | 49.977 |
| 0.28694444444444445 | 49.973 |
| 0.28695601851851854 | 49.971 |
| 0.2869675925925926 | 49.968 |
| 0.2869791666666667 | 49.969 |
| 0.28699074074074077 | 49.967 |
| 0.2870023148148148 | 49.965 |
| 0.2870138888888889 | 49.961 |
| 0.287025462962963 | 49.961 |
| 0.28703703703703703 | 49.961 |
| 0.2870486111111111 | 49.966 |
| 0.2870601851851852 | 49.973 |
| 0.28707175925925926 | 49.978 |
| 0.2870833333333333 | 49.983 |
| 0.2870949074074074 | 49.988 |
| 0.2871064814814815 | 49.992 |
| 0.28711805555555553 | 49.997 |
| 0.2871296296296296 | 49.998 |
| 0.2871412037037037 | 50 |
| 0.28715277777777776 | 50.001 |
| 0.28716435185185185 | 50 |
| 0.28717592592592595 | 49.995 |
| 0.2871875 | 49.994 |
| 0.2871990740740741 | 49.993 |
| 0.2872106481481482 | 49.995 |
| 0.2872222222222222 | 49.995 |
| 0.2872337962962963 | 49.997 |
| 0.2872453703703704 | 50 |
| 0.28725694444444444 | 50.003 |
| 0.2872685185185185 | 50.01 |
| 0.28728009259259263 | 50.02 |
| 0.28729166666666667 | 50.021 |
| 0.28730324074074076 | 50.022 |
| 0.2873148148148148 | 50.024 |
| 0.2873263888888889 | 50.025 |
| 0.28733796296296293 | 50.023 |
| 0.28734953703703703 | 50.023 |
| 0.2873611111111111 | 50.026 |
| 0.28737268518518516 | 50.028 |
| 0.28738425925925926 | 50.029 |
| 0.28739583333333335 | 50.027 |
| 0.2874074074074074 | 50.024 |
| 0.2874189814814815 | 50.027 |
| 0.2874305555555556 | 50.028 |
| 0.2874421296296296 | 50.027 |
| 0.2874537037037037 | 50.029 |
| 0.2874652777777778 | 50.025 |
| 0.28747685185185184 | 50.02 |
| 0.28748842592592594 | 50.017 |
| 0.28750000000000003 | 50.017 |
| 0.28751157407407407 | 50.018 |
| 0.28752314814814817 | 50.016 |
| 0.2875347222222222 | 50.014 |
| 0.2875462962962963 | 50.014 |
| 0.28755787037037034 | 50.014 |
| 0.28756944444444443 | 50.012 |
| 0.2875810185185185 | 50.01 |
| 0.28759259259259257 | 50.01 |
| 0.28760416666666666 | 50.009 |
| 0.28761574074074076 | 50.01 |
| 0.2876273148148148 | 50.007 |
| 0.2876388888888889 | 50.005 |
| 0.287650462962963 | 50.005 |
| 0.287662037037037 | 49.999 |
| 0.2876736111111111 | 49.999 |
| 0.2876851851851852 | 49.998 |
| 0.28769675925925925 | 49.999 |
| 0.28770833333333334 | 50 |
| 0.28771990740740744 | 50.002 |
| 0.2877314814814815 | 50.006 |
| 0.28774305555555557 | 50.009 |
| 0.2877546296296296 | 50.011 |
| 0.2877662037037037 | 50.013 |
| 0.28777777777777774 | 50.014 |
| 0.28778935185185184 | 50.013 |
| 0.28780092592592593 | 50.016 |
| 0.28781249999999997 | 50.016 |
| 0.28782407407407407 | 50.016 |
| 0.28783564814814816 | 50.017 |
| 0.2878472222222222 | 50.017 |
| 0.2878587962962963 | 50.018 |
| 0.2878703703703704 | 50.02 |
| 0.2878819444444444 | 50.02 |
| 0.2878935185185185 | 50.025 |
| 0.2879050925925926 | 50.028 |
| 0.28791666666666665 | 50.027 |
| 0.28792824074074075 | 50.024 |
| 0.28793981481481484 | 50.019 |
| 0.2879513888888889 | 50.017 |
| 0.287962962962963 | 50.011 |
| 0.287974537037037 | 50.003 |
| 0.2879861111111111 | 49.998 |
| 0.28799768518518515 | 49.993 |
| 0.2880092592592593 | 49.99 |
| 0.28802083333333334 | 49.988 |
| 0.2880324074074074 | 49.982 |
| 0.28804398148148147 | 49.981 |
| 0.28805555555555556 | 49.982 |
| 0.2880671296296296 | 49.981 |
| 0.2880787037037037 | 49.982 |
| 0.2880902777777778 | 49.982 |
| 0.28810185185185183 | 49.982 |
| 0.2881134259259259 | 49.983 |
| 0.288125 | 49.982 |
| 0.28813657407407406 | 49.98 |
| 0.28814814814814815 | 49.983 |
| 0.28815972222222225 | 49.979 |
| 0.2881712962962963 | 49.978 |
| 0.2881828703703704 | 49.98 |
| 0.2881944444444445 | 49.983 |
| 0.2882060185185185 | 49.985 |
| 0.28821759259259255 | 49.985 |
| 0.2882291666666667 | 49.985 |
| 0.28824074074074074 | 49.988 |
| 0.28825231481481484 | 49.986 |
| 0.2882638888888889 | 49.982 |
| 0.28827546296296297 | 49.978 |
| 0.288287037037037 | 49.977 |
| 0.2882986111111111 | 49.975 |
| 0.2883101851851852 | 49.971 |
| 0.28832175925925924 | 49.968 |
| 0.28833333333333333 | 49.965 |
| 0.2883449074074074 | 49.962 |
| 0.28835648148148146 | 49.96 |
| 0.28836805555555556 | 49.959 |
| 0.28837962962962965 | 49.957 |
| 0.2883912037037037 | 49.961 |
| 0.2884027777777778 | 49.961 |
| 0.2884143518518519 | 49.964 |
| 0.2884259259259259 | 49.968 |
| 0.2884375 | 49.97 |
| 0.2884490740740741 | 49.97 |
| 0.28846064814814815 | 49.971 |
| 0.28847222222222224 | 49.97 |
| 0.2884837962962963 | 49.965 |
| 0.2884953703703704 | 49.96 |
| 0.2885069444444444 | 49.956 |
| 0.2885185185185185 | 49.953 |
| 0.2885300925925926 | 49.953 |
| 0.28854166666666664 | 49.956 |
| 0.28855324074074074 | 49.955 |
| 0.28856481481481483 | 49.957 |
| 0.28857638888888887 | 49.959 |
| 0.28858796296296296 | 49.962 |
| 0.28859953703703706 | 49.963 |
| 0.2886111111111111 | 49.964 |
| 0.2886226851851852 | 49.966 |
| 0.2886342592592593 | 49.966 |
| 0.2886458333333333 | 49.968 |
| 0.2886574074074074 | 49.968 |
| 0.2886689814814815 | 49.968 |
| 0.28868055555555555 | 49.968 |
| 0.28869212962962965 | 49.967 |
| 0.2887037037037037 | 49.966 |
| 0.2887152777777778 | 49.97 |
| 0.2887268518518518 | 49.967 |
| 0.2887384259259259 | 49.965 |
| 0.28875 | 49.969 |
| 0.28876157407407405 | 49.97 |
| 0.28877314814814814 | 49.974 |
| 0.28878472222222223 | 49.978 |
| 0.2887962962962963 | 49.981 |
| 0.28880787037037037 | 49.98 |
| 0.28881944444444446 | 49.972 |
| 0.2888310185185185 | 49.963 |
| 0.2888425925925926 | 49.953 |
| 0.2888541666666667 | 49.936 |
| 0.28886574074074073 | 49.921 |
| 0.2888773148148148 | 49.906 |
| 0.2888888888888889 | 49.893 |
| 0.28890046296296296 | 49.883 |
| 0.28891203703703705 | 49.879 |
| 0.2889236111111111 | 49.875 |
| 0.2889351851851852 | 49.875 |
| 0.2889467592592592 | 49.879 |
| 0.2889583333333334 | 49.887 |
| 0.2889699074074074 | 49.888 |
| 0.28898148148148145 | 49.892 |
| 0.28899305555555554 | 49.894 |
| 0.28900462962962964 | 49.898 |
| 0.2890162037037037 | 49.899 |
| 0.2890277777777778 | 49.903 |
| 0.28903935185185187 | 49.905 |
| 0.2890509259259259 | 49.905 |
| 0.2890625 | 49.907 |
| 0.2890740740740741 | 49.909 |
| 0.28908564814814813 | 49.913 |
| 0.2890972222222222 | 49.911 |
| 0.2891087962962963 | 49.912 |
| 0.28912037037037036 | 49.909 |
| 0.28913194444444446 | 49.908 |
| 0.28914351851851855 | 49.906 |
| 0.2891550925925926 | 49.902 |
| 0.2891666666666666 | 49.902 |
| 0.2891782407407408 | 49.904 |
| 0.2891898148148148 | 49.904 |
| 0.2892013888888889 | 49.904 |
| 0.28921296296296295 | 49.906 |
| 0.28922453703703704 | 49.911 |
| 0.2892361111111111 | 49.912 |
| 0.2892476851851852 | 49.916 |
| 0.28925925925925927 | 49.919 |
| 0.2892708333333333 | 49.922 |
| 0.2892824074074074 | 49.925 |
| 0.2892939814814815 | 49.932 |
| 0.28930555555555554 | 49.94 |
| 0.28931712962962963 | 49.945 |
| 0.2893287037037037 | 49.946 |
| 0.28934027777777777 | 49.947 |
| 0.28935185185185186 | 49.946 |
| 0.28936342592592595 | 49.952 |
| 0.289375 | 49.958 |
| 0.2893865740740741 | 49.962 |
| 0.2893981481481482 | 49.967 |
| 0.2894097222222222 | 49.964 |
| 0.2894212962962963 | 49.964 |
| 0.28943287037037035 | 49.961 |
| 0.28944444444444445 | 49.958 |
| 0.2894560185185185 | 49.954 |
| 0.2894675925925926 | 49.951 |
| 0.2894791666666667 | 49.945 |
| 0.2894907407407407 | 49.942 |
| 0.2895023148148148 | 49.941 |
| 0.2895138888888889 | 49.943 |
| 0.28952546296296294 | 49.942 |
| 0.28953703703703704 | 49.943 |
| 0.28954861111111113 | 49.941 |
| 0.28956018518518517 | 49.94 |
| 0.28957175925925926 | 49.938 |
| 0.28958333333333336 | 49.937 |
| 0.2895949074074074 | 49.937 |
| 0.2896064814814815 | 49.939 |
| 0.2896180555555556 | 49.936 |
| 0.2896296296296296 | 49.938 |
| 0.2896412037037037 | 49.938 |
| 0.28965277777777776 | 49.939 |
| 0.28966435185185185 | 49.945 |
| 0.2896759259259259 | 49.946 |
| 0.2896875 | 49.943 |
| 0.2896990740740741 | 49.946 |
| 0.2897106481481481 | 49.947 |
| 0.2897222222222222 | 49.952 |
| 0.2897337962962963 | 49.959 |
| 0.28974537037037035 | 49.963 |
| 0.28975694444444444 | 49.965 |
| 0.28976851851851854 | 49.969 |
| 0.2897800925925926 | 49.975 |
| 0.28979166666666667 | 49.981 |
| 0.28980324074074076 | 49.986 |
| 0.2898148148148148 | 49.986 |
| 0.2898263888888889 | 49.988 |
| 0.289837962962963 | 49.987 |
| 0.28984953703703703 | 49.989 |
| 0.2898611111111111 | 49.99 |
| 0.28987268518518516 | 49.992 |
| 0.28988425925925926 | 49.994 |
| 0.2898958333333333 | 49.993 |
| 0.28990740740740745 | 49.994 |
| 0.2899189814814815 | 49.995 |
| 0.2899305555555555 | 50.002 |
| 0.2899421296296296 | 50.006 |
| 0.2899537037037037 | 50.011 |
| 0.28996527777777775 | 50.016 |
| 0.28997685185185185 | 50.017 |
| 0.28998842592592594 | 50.016 |
| 0.29 | 50.017 |
| 0.2900115740740741 | 50.016 |
| 0.29002314814814817 | 50.015 |
| 0.2900347222222222 | 50.014 |
| 0.2900462962962963 | 50.02 |
| 0.2900578703703704 | 50.019 |
| 0.29006944444444444 | 50.023 |
| 0.29008101851851853 | 50.023 |
| 0.2900925925925926 | 50.026 |
| 0.29010416666666666 | 50.029 |
| 0.2901157407407407 | 50.03 |
| 0.29012731481481485 | 50.029 |
| 0.2901388888888889 | 50.027 |
| 0.290150462962963 | 50.026 |
| 0.290162037037037 | 50.026 |
| 0.2901736111111111 | 50.022 |
| 0.29018518518518516 | 50.02 |
| 0.29019675925925925 | 50.018 |
| 0.29020833333333335 | 50.011 |
| 0.2902199074074074 | 50.006 |
| 0.2902314814814815 | 49.999 |
| 0.2902430555555556 | 49.995 |
| 0.2902546296296296 | 49.99 |
| 0.2902662037037037 | 49.984 |
| 0.2902777777777778 | 49.978 |
| 0.29028935185185184 | 49.97 |
| 0.29030092592592593 | 49.963 |
| 0.29031250000000003 | 49.958 |
| 0.29032407407407407 | 49.955 |
| 0.29033564814814816 | 49.952 |
| 0.29034722222222226 | 49.955 |
| 0.2903587962962963 | 49.957 |
| 0.2903703703703704 | 49.959 |
| 0.29038194444444443 | 49.957 |
| 0.2903935185185185 | 49.958 |
| 0.29040509259259256 | 49.956 |
| 0.29041666666666666 | 49.955 |
| 0.29042824074074075 | 49.957 |
| 0.2904398148148148 | 49.961 |
| 0.2904513888888889 | 49.963 |
| 0.290462962962963 | 49.964 |
| 0.290474537037037 | 49.963 |
| 0.2904861111111111 | 49.963 |
| 0.2904976851851852 | 49.962 |
| 0.29050925925925924 | 49.958 |
| 0.29052083333333334 | 49.957 |
| 0.29053240740740743 | 49.951 |
| 0.2905439814814815 | 49.949 |
| 0.29055555555555557 | 49.947 |
| 0.29056712962962966 | 49.949 |
| 0.2905787037037037 | 49.949 |
| 0.2905902777777778 | 49.95 |
| 0.29060185185185183 | 49.949 |
| 0.29061342592592593 | 49.947 |
| 0.29062499999999997 | 49.944 |
| 0.29063657407407406 | 49.94 |
| 0.29064814814814816 | 49.937 |
| 0.2906597222222222 | 49.938 |
| 0.2906712962962963 | 49.939 |
| 0.2906828703703704 | 49.94 |
| 0.2906944444444444 | 49.939 |
| 0.2907060185185185 | 49.943 |
| 0.2907175925925926 | 49.947 |
| 0.29072916666666665 | 49.949 |
| 0.29074074074074074 | 49.954 |
| 0.29075231481481484 | 49.958 |
| 0.2907638888888889 | 49.962 |
| 0.29077546296296297 | 49.969 |
| 0.29078703703703707 | 49.975 |
| 0.2907986111111111 | 49.982 |
| 0.2908101851851852 | 49.986 |
| 0.29082175925925924 | 49.985 |
| 0.29083333333333333 | 49.985 |
| 0.29084490740740737 | 49.983 |
| 0.2908564814814815 | 49.981 |
| 0.29086805555555556 | 49.981 |
| 0.2908796296296296 | 49.979 |
| 0.2908912037037037 | 49.976 |
| 0.2909027777777778 | 49.973 |
| 0.2909143518518518 | 49.972 |
| 0.2909259259259259 | 49.974 |
| 0.2909375 | 49.974 |
| 0.29094907407407405 | 49.974 |
| 0.29096064814814815 | 49.975 |
| 0.29097222222222224 | 49.974 |
| 0.2909837962962963 | 49.974 |
| 0.2909953703703704 | 49.973 |
| 0.29100694444444447 | 49.975 |
| 0.2910185185185185 | 49.976 |
| 0.2910300925925926 | 49.977 |
| 0.2910416666666667 | 49.978 |
| 0.29105324074074074 | 49.977 |
| 0.2910648148148148 | 49.977 |
| 0.2910763888888889 | 49.982 |
| 0.29108796296296297 | 49.996 |
| 0.291099537037037 | 50.01 |
| 0.2911111111111111 | 50.021 |
| 0.2911226851851852 | 50.028 |
| 0.29113425925925923 | 50.032 |
| 0.2911458333333333 | 50.034 |
| 0.2911574074074074 | 50.032 |
| 0.29116898148148146 | 50.027 |
| 0.29118055555555555 | 50.024 |
| 0.29119212962962965 | 50.021 |
| 0.2912037037037037 | 50.017 |
| 0.2912152777777778 | 50.014 |
| 0.2912268518518519 | 50.014 |
| 0.2912384259259259 | 50.015 |
| 0.29125 | 50.015 |
| 0.2912615740740741 | 50.015 |
| 0.29127314814814814 | 50.015 |
| 0.29128472222222224 | 50.014 |
| 0.29129629629629633 | 50.011 |
| 0.29130787037037037 | 50.012 |
| 0.29131944444444446 | 50.017 |
| 0.2913310185185185 | 50.021 |
| 0.2913425925925926 | 50.022 |
| 0.29135416666666664 | 50.026 |
| 0.29136574074074073 | 50.035 |
| 0.2913773148148148 | 50.039 |
| 0.29138888888888886 | 50.041 |
| 0.29140046296296296 | 50.04 |
| 0.29141203703703705 | 50.042 |
| 0.2914236111111111 | 50.043 |
| 0.2914351851851852 | 50.043 |
| 0.2914467592592593 | 50.042 |
| 0.2914583333333333 | 50.042 |
| 0.2914699074074074 | 50.04 |
| 0.2914814814814815 | 50.037 |
| 0.29149305555555555 | 50.034 |
| 0.29150462962962964 | 50.033 |
| 0.29151620370370374 | 50.032 |
| 0.2915277777777778 | 50.033 |
| 0.29153935185185187 | 50.033 |
| 0.2915509259259259 | 50.036 |
| 0.2915625 | 50.04 |
| 0.29157407407407404 | 50.042 |
| 0.29158564814814814 | 50.044 |
| 0.29159722222222223 | 50.049 |
| 0.29160879629629627 | 50.057 |
| 0.29162037037037036 | 50.054 |
| 0.29163194444444446 | 50.054 |
| 0.2916435185185185 | 50.054 |
| 0.2916550925925926 | 50.057 |
| 0.2916666666666667 | 50.058 |
| 0.2916782407407407 | 50.057 |
| 0.2916898148148148 | 50.057 |
| 0.2917013888888889 | 50.055 |
| 0.29171296296296295 | 50.057 |
| 0.29172453703703705 | 50.055 |
| 0.29173611111111114 | 50.054 |
| 0.2917476851851852 | 50.053 |
| 0.2917592592592593 | 50.049 |
| 0.29177083333333337 | 50.042 |
| 0.2917824074074074 | 50.032 |
| 0.29179398148148145 | 50.023 |
| 0.29180555555555554 | 50.016 |
| 0.29181712962962963 | 50.013 |
| 0.2918287037037037 | 50.01 |
| 0.29184027777777777 | 50.008 |
| 0.29185185185185186 | 50.01 |
| 0.2918634259259259 | 50.011 |
| 0.291875 | 50.01 |
| 0.2918865740740741 | 50.01 |
| 0.29189814814814813 | 50.009 |
| 0.2919097222222222 | 50.02 |
| 0.2919212962962963 | 50.036 |
| 0.29193287037037036 | 50.047 |
| 0.29194444444444445 | 50.049 |
| 0.29195601851851855 | 50.05 |
| 0.2919675925925926 | 50.051 |
| 0.2919791666666667 | 50.052 |
| 0.2919907407407408 | 50.054 |
| 0.2920023148148148 | 50.055 |
| 0.2920138888888889 | 50.057 |
| 0.29202546296296295 | 50.056 |
| 0.29203703703703704 | 50.056 |
| 0.2920486111111111 | 50.057 |
| 0.2920601851851852 | 50.059 |
| 0.29207175925925927 | 50.058 |
| 0.2920833333333333 | 50.058 |
| 0.2920949074074074 | 50.06 |
| 0.2921064814814815 | 50.062 |
| 0.29211805555555553 | 50.062 |
| 0.29212962962962963 | 50.061 |
| 0.2921412037037037 | 50.062 |
| 0.29215277777777776 | 50.062 |
| 0.29216435185185186 | 50.062 |
| 0.29217592592592595 | 50.059 |
| 0.2921875 | 50.057 |
| 0.2921990740740741 | 50.056 |
| 0.2922106481481482 | 50.057 |
| 0.2922222222222222 | 50.062 |
| 0.2922337962962963 | 50.063 |
| 0.2922453703703704 | 50.062 |
| 0.29225694444444444 | 50.063 |
| 0.2922685185185185 | 50.064 |
| 0.2922800925925926 | 50.065 |
| 0.29229166666666667 | 50.067 |
| 0.2923032407407407 | 50.069 |
| 0.2923148148148148 | 50.068 |
| 0.2923263888888889 | 50.071 |
| 0.29233796296296294 | 50.07 |
| 0.29234953703703703 | 50.069 |
| 0.2923611111111111 | 50.067 |
| 0.29237268518518517 | 50.066 |
| 0.29238425925925926 | 50.064 |
| 0.29239583333333335 | 50.063 |
| 0.2924074074074074 | 50.063 |
| 0.2924189814814815 | 50.065 |
| 0.2924305555555556 | 50.066 |
| 0.2924421296296296 | 50.069 |
| 0.2924537037037037 | 50.074 |
| 0.2924652777777778 | 50.074 |
| 0.29247685185185185 | 50.075 |
| 0.29248842592592594 | 50.076 |
| 0.2925 | 50.076 |
| 0.2925115740740741 | 50.08 |
| 0.2925231481481481 | 50.08 |
| 0.2925347222222222 | 50.077 |
| 0.2925462962962963 | 50.071 |
| 0.29255787037037034 | 50.071 |
| 0.29256944444444444 | 50.071 |
| 0.29258101851851853 | 50.072 |
| 0.29259259259259257 | 50.072 |
| 0.29260416666666667 | 50.07 |
| 0.29261574074074076 | 50.07 |
| 0.2926273148148148 | 50.068 |
| 0.2926388888888889 | 50.066 |
| 0.292650462962963 | 50.063 |
| 0.292662037037037 | 50.06 |
| 0.2926736111111111 | 50.058 |
| 0.2926851851851852 | 50.061 |
| 0.29269675925925925 | 50.063 |
| 0.29270833333333335 | 50.063 |
| 0.29271990740740744 | 50.063 |
| 0.2927314814814815 | 50.062 |
| 0.2927430555555555 | 50.061 |
| 0.2927546296296296 | 50.06 |
| 0.2927662037037037 | 50.059 |
| 0.29277777777777775 | 50.057 |
| 0.29278935185185184 | 50.057 |
| 0.29280092592592594 | 50.057 |
| 0.2928125 | 50.055 |
| 0.29282407407407407 | 50.053 |
| 0.29283564814814816 | 50.052 |
| 0.2928472222222222 | 50.051 |
| 0.2928587962962963 | 50.051 |
| 0.2928703703703704 | 50.051 |
| 0.29288194444444443 | 50.049 |
| 0.2928935185185185 | 50.048 |
| 0.2929050925925926 | 50.047 |
| 0.29291666666666666 | 50.049 |
| 0.29292824074074075 | 50.051 |
| 0.29293981481481485 | 50.053 |
| 0.2929513888888889 | 50.058 |
| 0.292962962962963 | 50.064 |
| 0.292974537037037 | 50.067 |
| 0.2929861111111111 | 50.071 |
| 0.29299768518518515 | 50.074 |
| 0.29300925925925925 | 50.077 |
| 0.29302083333333334 | 50.079 |
| 0.2930324074074074 | 50.079 |
| 0.2930439814814815 | 50.075 |
| 0.29305555555555557 | 50.072 |
| 0.2930671296296296 | 50.069 |
| 0.2930787037037037 | 50.066 |
| 0.2930902777777778 | 50.065 |
| 0.29310185185185184 | 50.064 |
| 0.29311342592592593 | 50.061 |
| 0.293125 | 50.06 |
| 0.29313657407407406 | 50.062 |
| 0.29314814814814816 | 50.063 |
| 0.29315972222222225 | 50.064 |
| 0.2931712962962963 | 50.063 |
| 0.2931828703703704 | 50.059 |
| 0.2931944444444445 | 50.055 |
| 0.2932060185185185 | 50.052 |
| 0.29321759259259256 | 50.053 |
| 0.29322916666666665 | 50.051 |
| 0.29324074074074075 | 50.049 |
| 0.2932523148148148 | 50.049 |
| 0.2932638888888889 | 50.048 |
| 0.293275462962963 | 50.046 |
| 0.293287037037037 | 50.045 |
| 0.2932986111111111 | 50.046 |
| 0.2933101851851852 | 50.045 |
| 0.29332175925925924 | 50.044 |
| 0.29333333333333333 | 50.046 |
| 0.29334490740740743 | 50.049 |
| 0.29335648148148147 | 50.048 |
| 0.29336805555555556 | 50.048 |
| 0.29337962962962966 | 50.052 |
| 0.2933912037037037 | 50.056 |
| 0.2934027777777778 | 50.059 |
| 0.2934143518518519 | 50.062 |
| 0.2934259259259259 | 50.064 |
| 0.2934375 | 50.064 |
| 0.29344907407407406 | 50.063 |
| 0.29346064814814815 | 50.063 |
| 0.2934722222222222 | 50.058 |
| 0.2934837962962963 | 50.055 |
| 0.2934953703703704 | 50.053 |
| 0.2935069444444444 | 50.052 |
| 0.2935185185185185 | 50.051 |
| 0.2935300925925926 | 50.049 |
| 0.29354166666666665 | 50.048 |
| 0.29355324074074074 | 50.046 |
| 0.29356481481481483 | 50.046 |
| 0.2935763888888889 | 50.048 |
| 0.29358796296296297 | 50.052 |
| 0.29359953703703706 | 50.056 |
| 0.2936111111111111 | 50.058 |
| 0.2936226851851852 | 50.058 |
| 0.2936342592592593 | 50.058 |
| 0.29364583333333333 | 50.058 |
| 0.2936574074074074 | 50.058 |
| 0.2936689814814815 | 50.059 |
| 0.29368055555555556 | 50.062 |
| 0.2936921296296296 | 50.066 |
| 0.2937037037037037 | 50.067 |
| 0.2937152777777778 | 50.067 |
| 0.2937268518518518 | 50.068 |
| 0.2937384259259259 | 50.068 |
| 0.29375 | 50.066 |
| 0.29376157407407405 | 50.063 |
| 0.29377314814814814 | 50.062 |
| 0.29378472222222224 | 50.06 |
| 0.2937962962962963 | 50.062 |
| 0.29380787037037037 | 50.066 |
| 0.29381944444444447 | 50.068 |
| 0.2938310185185185 | 50.07 |
| 0.2938425925925926 | 50.074 |
| 0.2938541666666667 | 50.074 |
| 0.29386574074074073 | 50.073 |
| 0.2938773148148148 | 50.072 |
| 0.2938888888888889 | 50.07 |
| 0.29390046296296296 | 50.07 |
| 0.29391203703703705 | 50.07 |
| 0.2939236111111111 | 50.07 |
| 0.2939351851851852 | 50.072 |
| 0.2939467592592592 | 50.072 |
| 0.2939583333333333 | 50.073 |
| 0.2939699074074074 | 50.074 |
| 0.29398148148148145 | 50.075 |
| 0.29399305555555555 | 50.081 |
| 0.29400462962962964 | 50.084 |
| 0.2940162037037037 | 50.086 |
| 0.2940277777777778 | 50.085 |
| 0.29403935185185187 | 50.08 |
| 0.2940509259259259 | 50.076 |
| 0.2940625 | 50.074 |
| 0.2940740740740741 | 50.07 |
| 0.29408564814814814 | 50.067 |
| 0.29409722222222223 | 50.066 |
| 0.2941087962962963 | 50.068 |
| 0.29412037037037037 | 50.071 |
| 0.29413194444444446 | 50.076 |
| 0.29414351851851855 | 50.083 |
| 0.2941550925925926 | 50.091 |
| 0.29416666666666663 | 50.096 |
| 0.2941782407407407 | 50.099 |
| 0.2941898148148148 | 50.101 |
| 0.29420138888888886 | 50.105 |
| 0.29421296296296295 | 50.106 |
| 0.29422453703703705 | 50.104 |
| 0.2942361111111111 | 50.102 |
| 0.2942476851851852 | 50.101 |
| 0.2942592592592593 | 50.098 |
| 0.2942708333333333 | 50.097 |
| 0.2942824074074074 | 50.097 |
| 0.2942939814814815 | 50.097 |
| 0.29430555555555554 | 50.098 |
| 0.29431712962962964 | 50.095 |
| 0.29432870370370373 | 50.095 |
| 0.29434027777777777 | 50.096 |
| 0.29435185185185186 | 50.098 |
| 0.29436342592592596 | 50.1 |
| 0.294375 | 50.101 |
| 0.2943865740740741 | 50.1 |
| 0.29439814814814813 | 50.101 |
| 0.2944097222222222 | 50.098 |
| 0.29442129629629626 | 50.099 |
| 0.29443287037037036 | 50.098 |
| 0.29444444444444445 | 50.093 |
| 0.2944560185185185 | 50.088 |
| 0.2944675925925926 | 50.084 |
| 0.2944791666666667 | 50.081 |
| 0.2944907407407407 | 50.081 |
| 0.2945023148148148 | 50.078 |
| 0.2945138888888889 | 50.076 |
| 0.29452546296296295 | 50.068 |
| 0.29453703703703704 | 50.064 |
| 0.29454861111111114 | 50.061 |
| 0.2945601851851852 | 50.059 |
| 0.29457175925925927 | 50.055 |
| 0.29458333333333336 | 50.055 |
| 0.2945949074074074 | 50.052 |
| 0.2946064814814815 | 50.052 |
| 0.2946180555555556 | 50.054 |
| 0.29462962962962963 | 50.061 |
| 0.29464120370370367 | 50.064 |
| 0.29465277777777776 | 50.069 |
| 0.29466435185185186 | 50.071 |
| 0.2946759259259259 | 50.071 |
| 0.2946875 | 50.073 |
| 0.2946990740740741 | 50.071 |
| 0.2947106481481481 | 50.072 |
| 0.2947222222222222 | 50.069 |
| 0.2947337962962963 | 50.066 |
| 0.29474537037037035 | 50.062 |
| 0.29475694444444445 | 50.06 |
| 0.29476851851851854 | 50.059 |
| 0.2947800925925926 | 50.056 |
| 0.2947916666666667 | 50.055 |
| 0.29480324074074077 | 50.052 |
| 0.2948148148148148 | 50.051 |
| 0.2948263888888889 | 50.055 |
| 0.294837962962963 | 50.062 |
| 0.29484953703703703 | 50.067 |
| 0.2948611111111111 | 50.071 |
| 0.29487268518518517 | 50.075 |
| 0.29488425925925926 | 50.075 |
| 0.2948958333333333 | 50.075 |
| 0.2949074074074074 | 50.077 |
| 0.2949189814814815 | 50.074 |
| 0.29493055555555553 | 50.073 |
| 0.2949421296296296 | 50.073 |
| 0.2949537037037037 | 50.078 |
| 0.29496527777777776 | 50.081 |
| 0.29497685185185185 | 50.085 |
| 0.29498842592592595 | 50.083 |
| 0.295 | 50.079 |
| 0.2950115740740741 | 50.074 |
| 0.2950231481481482 | 50.068 |
| 0.2950347222222222 | 50.064 |
| 0.2950462962962963 | 50.065 |
| 0.2950578703703704 | 50.063 |
| 0.29506944444444444 | 50.06 |
| 0.29508101851851853 | 50.058 |
| 0.29509259259259263 | 50.056 |
| 0.29510416666666667 | 50.056 |
| 0.2951157407407407 | 50.056 |
| 0.2951273148148148 | 50.053 |
| 0.2951388888888889 | 50.054 |
| 0.29515046296296293 | 50.053 |
| 0.29516203703703703 | 50.052 |
| 0.2951736111111111 | 50.051 |
| 0.29518518518518516 | 50.049 |
| 0.29519675925925926 | 50.046 |
| 0.29520833333333335 | 50.042 |
| 0.2952199074074074 | 50.042 |
| 0.2952314814814815 | 50.04 |
| 0.2952430555555556 | 50.039 |
| 0.2952546296296296 | 50.036 |
| 0.2952662037037037 | 50.032 |
| 0.2952777777777778 | 50.034 |
| 0.29528935185185184 | 50.036 |
| 0.29530092592592594 | 50.04 |
| 0.29531250000000003 | 50.042 |
| 0.29532407407407407 | 50.048 |
| 0.29533564814814817 | 50.054 |
| 0.2953472222222222 | 50.059 |
| 0.2953587962962963 | 50.059 |
| 0.29537037037037034 | 50.06 |
| 0.29538194444444443 | 50.062 |
| 0.2953935185185185 | 50.061 |
| 0.29540509259259257 | 50.058 |
| 0.29541666666666666 | 50.053 |
| 0.29542824074074076 | 50.048 |
| 0.2954398148148148 | 50.042 |
| 0.2954513888888889 | 50.037 |
| 0.295462962962963 | 50.035 |
| 0.295474537037037 | 50.034 |
| 0.2954861111111111 | 50.03 |
| 0.2954976851851852 | 50.024 |
| 0.29550925925925925 | 50.022 |
| 0.29552083333333334 | 50.017 |
| 0.29553240740740744 | 50.019 |
| 0.2955439814814815 | 50.019 |
| 0.29555555555555557 | 50.021 |
| 0.29556712962962967 | 50.024 |
| 0.2955787037037037 | 50.024 |
| 0.29559027777777774 | 50.027 |
| 0.29560185185185184 | 50.031 |
| 0.29561342592592593 | 50.04 |
| 0.29562499999999997 | 50.045 |
| 0.29563657407407407 | 50.046 |
| 0.29564814814814816 | 50.043 |
| 0.2956597222222222 | 50.039 |
| 0.2956712962962963 | 50.032 |
| 0.2956828703703704 | 50.026 |
| 0.2956944444444444 | 50.024 |
| 0.2957060185185185 | 50.022 |
| 0.2957175925925926 | 50.022 |
| 0.29572916666666665 | 50.021 |
| 0.29574074074074075 | 50.022 |
| 0.29575231481481484 | 50.02 |
| 0.2957638888888889 | 50.018 |
| 0.295775462962963 | 50.019 |
| 0.29578703703703707 | 50.019 |
| 0.2957986111111111 | 50.021 |
| 0.29581018518518515 | 50.022 |
| 0.29582175925925924 | 50.019 |
| 0.29583333333333334 | 50.016 |
| 0.2958449074074074 | 50.015 |
| 0.29585648148148147 | 50.017 |
| 0.29586805555555556 | 50.019 |
| 0.2958796296296296 | 50.018 |
| 0.2958912037037037 | 50.02 |
| 0.2959027777777778 | 50.016 |
| 0.29591435185185183 | 50.016 |
| 0.2959259259259259 | 50.011 |
| 0.2959375 | 50.006 |
| 0.29594907407407406 | 50 |
| 0.29596064814814815 | 49.994 |
| 0.29597222222222225 | 49.988 |
| 0.2959837962962963 | 49.983 |
| 0.2959953703703704 | 49.978 |
| 0.2960069444444445 | 49.976 |
| 0.2960185185185185 | 49.975 |
| 0.2960300925925926 | 49.976 |
| 0.2960416666666667 | 49.976 |
| 0.29605324074074074 | 49.977 |
| 0.2960648148148148 | 49.979 |
| 0.2960763888888889 | 49.98 |
| 0.29608796296296297 | 49.984 |
| 0.296099537037037 | 49.988 |
| 0.2961111111111111 | 49.989 |
| 0.2961226851851852 | 49.995 |
| 0.29613425925925924 | 49.997 |
| 0.29614583333333333 | 50.001 |
| 0.2961574074074074 | 50.004 |
| 0.29616898148148146 | 50.008 |
| 0.29618055555555556 | 50.01 |
| 0.29619212962962965 | 50.012 |
| 0.2962037037037037 | 50.013 |
| 0.2962152777777778 | 50.013 |
| 0.2962268518518519 | 50.012 |
| 0.2962384259259259 | 50.015 |
| 0.29625 | 50.011 |
| 0.2962615740740741 | 50.012 |
| 0.29627314814814815 | 50.012 |
| 0.29628472222222224 | 50.01 |
| 0.2962962962962963 | 50.012 |
| 0.2963078703703704 | 50.016 |
| 0.2963194444444444 | 50.018 |
| 0.2963310185185185 | 50.017 |
| 0.2963425925925926 | 50.018 |
| 0.29635416666666664 | 50.019 |
| 0.29636574074074074 | 50.017 |
| 0.29637731481481483 | 50.014 |
| 0.29638888888888887 | 50.008 |
| 0.29640046296296296 | 50.004 |
| 0.29641203703703706 | 50 |
| 0.2964236111111111 | 50 |
| 0.2964351851851852 | 50 |
| 0.2964467592592593 | 50.006 |
| 0.2964583333333333 | 50.011 |
| 0.2964699074074074 | 50.012 |
| 0.2964814814814815 | 50.011 |
| 0.29649305555555555 | 50.009 |
| 0.29650462962962965 | 50.008 |
| 0.29651620370370374 | 50.006 |
| 0.2965277777777778 | 50.007 |
| 0.2965393518518518 | 50.007 |
| 0.2965509259259259 | 50.006 |
| 0.2965625 | 50.005 |
| 0.29657407407407405 | 50.007 |
| 0.29658564814814814 | 50.004 |
| 0.29659722222222223 | 50.003 |
| 0.2966087962962963 | 50.004 |
| 0.29662037037037037 | 50.001 |
| 0.29663194444444446 | 50 |
| 0.2966435185185185 | 50 |
| 0.2966550925925926 | 50.002 |
| 0.2966666666666667 | 50.006 |
| 0.29667824074074073 | 50.008 |
| 0.2966898148148148 | 50.008 |
| 0.2967013888888889 | 50.009 |
| 0.29671296296296296 | 50.012 |
| 0.29672453703703705 | 50.013 |
| 0.29673611111111114 | 50.011 |
| 0.2967476851851852 | 50.004 |
| 0.2967592592592592 | 49.999 |
| 0.2967708333333333 | 49.991 |
| 0.2967824074074074 | 49.979 |
| 0.29679398148148145 | 49.973 |
| 0.29680555555555554 | 49.969 |
| 0.29681712962962964 | 49.967 |
| 0.2968287037037037 | 49.968 |
| 0.2968402777777778 | 49.968 |
| 0.29685185185185187 | 49.971 |
| 0.2968634259259259 | 49.976 |
| 0.296875 | 49.981 |
| 0.2968865740740741 | 49.985 |
| 0.29689814814814813 | 49.988 |
| 0.2969097222222222 | 49.988 |
| 0.2969212962962963 | 49.987 |
| 0.29693287037037036 | 49.987 |
| 0.29694444444444446 | 49.991 |
| 0.29695601851851855 | 49.993 |
| 0.2969675925925926 | 49.995 |
| 0.2969791666666667 | 49.997 |
| 0.2969907407407408 | 49.999 |
| 0.2970023148148148 | 49.999 |
| 0.29701388888888886 | 50.002 |
| 0.29702546296296295 | 50.006 |
| 0.29703703703703704 | 50.004 |
| 0.2970486111111111 | 50 |
| 0.2970601851851852 | 49.996 |
| 0.29707175925925927 | 49.993 |
| 0.2970833333333333 | 49.988 |
| 0.2970949074074074 | 49.983 |
| 0.2971064814814815 | 49.982 |
| 0.29711805555555554 | 49.983 |
| 0.29712962962962963 | 49.982 |
| 0.2971412037037037 | 49.98 |
| 0.29715277777777777 | 49.979 |
| 0.29716435185185186 | 49.977 |
| 0.29717592592592595 | 49.973 |
| 0.2971875 | 49.97 |
| 0.2971990740740741 | 49.971 |
| 0.2972106481481482 | 49.97 |
| 0.2972222222222222 | 49.97 |
| 0.2972337962962963 | 49.968 |
| 0.29724537037037035 | 49.967 |
| 0.29725694444444445 | 49.969 |
| 0.2972685185185185 | 49.971 |
| 0.2972800925925926 | 49.973 |
| 0.2972916666666667 | 49.973 |
| 0.2973032407407407 | 49.973 |
| 0.2973148148148148 | 49.972 |
| 0.2973263888888889 | 49.97 |
| 0.29733796296296294 | 49.97 |
| 0.29734953703703704 | 49.97 |
| 0.29736111111111113 | 49.971 |
| 0.29737268518518517 | 49.972 |
| 0.29738425925925926 | 49.974 |
| 0.29739583333333336 | 49.975 |
| 0.2974074074074074 | 49.977 |
| 0.2974189814814815 | 49.98 |
| 0.2974305555555556 | 49.983 |
| 0.2974421296296296 | 49.987 |
| 0.2974537037037037 | 49.987 |
| 0.29746527777777776 | 49.99 |
| 0.29747685185185185 | 49.993 |
| 0.2974884259259259 | 49.992 |
| 0.2975 | 49.993 |
| 0.2975115740740741 | 49.996 |
| 0.2975231481481481 | 50.002 |
| 0.2975347222222222 | 50.006 |
| 0.2975462962962963 | 50.013 |
| 0.29755787037037035 | 50.018 |
| 0.29756944444444444 | 50.023 |
| 0.29758101851851854 | 50.025 |
| 0.2975925925925926 | 50.025 |
| 0.29760416666666667 | 50.026 |
| 0.29761574074074076 | 50.027 |
| 0.2976273148148148 | 50.028 |
| 0.2976388888888889 | 50.031 |
| 0.297650462962963 | 50.037 |
| 0.29766203703703703 | 50.04 |
| 0.2976736111111111 | 50.043 |
| 0.2976851851851852 | 50.045 |
| 0.29769675925925926 | 50.045 |
| 0.2977083333333333 | 50.04 |
| 0.2977199074074074 | 50.037 |
| 0.2977314814814815 | 50.032 |
| 0.2977430555555555 | 50.031 |
| 0.2977546296296296 | 50.029 |
| 0.2977662037037037 | 50.027 |
| 0.29777777777777775 | 50.027 |
| 0.29778935185185185 | 50.025 |
| 0.29780092592592594 | 50.025 |
| 0.2978125 | 50.027 |
| 0.2978240740740741 | 50.026 |
| 0.29783564814814817 | 50.025 |
| 0.2978472222222222 | 50.025 |
| 0.2978587962962963 | 50.024 |
| 0.2978703703703704 | 50.022 |
| 0.29788194444444444 | 50.02 |
| 0.29789351851851853 | 50.02 |
| 0.2979050925925926 | 50.022 |
| 0.29791666666666666 | 50.02 |
| 0.29792824074074076 | 50.018 |
| 0.29793981481481485 | 50.014 |
| 0.2979513888888889 | 50.012 |
| 0.29796296296296293 | 50.01 |
| 0.297974537037037 | 50.008 |
| 0.2979861111111111 | 50.006 |
| 0.29799768518518516 | 50.004 |
| 0.29800925925925925 | 50.001 |
| 0.29802083333333335 | 49.997 |
| 0.2980324074074074 | 49.993 |
| 0.2980439814814815 | 49.988 |
| 0.2980555555555556 | 49.983 |
| 0.2980671296296296 | 49.979 |
| 0.2980787037037037 | 49.976 |
| 0.2980902777777778 | 49.977 |
| 0.29810185185185184 | 49.978 |
| 0.29811342592592593 | 49.976 |
| 0.29812500000000003 | 49.975 |
| 0.29813657407407407 | 49.976 |
| 0.29814814814814816 | 49.977 |
| 0.29815972222222226 | 49.981 |
| 0.2981712962962963 | 49.983 |
| 0.29818287037037033 | 49.984 |
| 0.29819444444444443 | 49.984 |
| 0.2982060185185185 | 49.986 |
| 0.29821759259259256 | 49.989 |
| 0.29822916666666666 | 49.991 |
| 0.29824074074074075 | 49.992 |
| 0.2982523148148148 | 49.994 |
| 0.2982638888888889 | 49.998 |
| 0.298275462962963 | 50.002 |
| 0.298287037037037 | 50.006 |
| 0.2982986111111111 | 50.009 |
| 0.2983101851851852 | 50.011 |
| 0.29832175925925924 | 50.012 |
| 0.29833333333333334 | 50.01 |
| 0.29834490740740743 | 50.007 |
| 0.2983564814814815 | 50.008 |
| 0.29836805555555557 | 50.006 |
| 0.29837962962962966 | 50.006 |
| 0.2983912037037037 | 50.007 |
| 0.2984027777777778 | 50.008 |
| 0.29841435185185183 | 50.007 |
| 0.29842592592592593 | 50.006 |
| 0.29843749999999997 | 50.006 |
| 0.29844907407407406 | 50.012 |
| 0.29846064814814816 | 50.015 |
| 0.2984722222222222 | 50.016 |
| 0.2984837962962963 | 50.014 |
| 0.2984953703703704 | 50.012 |
| 0.2985069444444444 | 50.009 |
| 0.2985185185185185 | 50.006 |
| 0.2985300925925926 | 50.002 |
| 0.29854166666666665 | 50 |
| 0.29855324074074074 | 49.998 |
| 0.29856481481481484 | 49.998 |
| 0.2985763888888889 | 49.997 |
| 0.29858796296296297 | 49.997 |
| 0.29859953703703707 | 49.998 |
| 0.2986111111111111 | 49.997 |
| 0.2986226851851852 | 49.994 |
| 0.2986342592592593 | 49.991 |
| 0.29864583333333333 | 49.99 |
| 0.29865740740740737 | 49.988 |
| 0.29866898148148147 | 49.987 |
| 0.29868055555555556 | 49.983 |
| 0.2986921296296296 | 49.979 |
| 0.2987037037037037 | 49.977 |
| 0.2987152777777778 | 49.975 |
| 0.2987268518518518 | 49.976 |
| 0.2987384259259259 | 49.979 |
| 0.29875 | 49.979 |
| 0.29876157407407405 | 49.985 |
| 0.29877314814814815 | 49.988 |
| 0.29878472222222224 | 49.99 |
| 0.2987962962962963 | 49.993 |
| 0.2988078703703704 | 49.996 |
| 0.29881944444444447 | 49.998 |
| 0.2988310185185185 | 50 |
| 0.2988425925925926 | 50.001 |
| 0.2988541666666667 | 50.001 |
| 0.29886574074074074 | 49.998 |
| 0.29887731481481483 | 49.996 |
| 0.2988888888888889 | 49.993 |
| 0.29890046296296297 | 49.989 |
| 0.298912037037037 | 49.986 |
| 0.2989236111111111 | 49.979 |
| 0.2989351851851852 | 49.979 |
| 0.29894675925925923 | 49.977 |
| 0.2989583333333333 | 49.978 |
| 0.2989699074074074 | 49.982 |
| 0.29898148148148146 | 49.987 |
| 0.29899305555555555 | 49.987 |
| 0.29900462962962965 | 49.984 |
| 0.2990162037037037 | 49.984 |
| 0.2990277777777778 | 49.985 |
| 0.2990393518518519 | 49.983 |
| 0.2990509259259259 | 49.98 |
| 0.2990625 | 49.977 |
| 0.2990740740740741 | 49.975 |
| 0.29908564814814814 | 49.974 |
| 0.29909722222222224 | 49.972 |
| 0.29910879629629633 | 49.97 |
| 0.29912037037037037 | 49.965 |
| 0.2991319444444444 | 49.96 |
| 0.2991435185185185 | 49.958 |
| 0.2991550925925926 | 49.958 |
| 0.29916666666666664 | 49.96 |
| 0.29917824074074073 | 49.959 |
| 0.2991898148148148 | 49.96 |
| 0.29920138888888886 | 49.963 |
| 0.29921296296296296 | 49.966 |
| 0.29922453703703705 | 49.969 |
| 0.2992361111111111 | 49.972 |
| 0.2992476851851852 | 49.975 |
| 0.2992592592592593 | 49.976 |
| 0.2992708333333333 | 49.978 |
| 0.2992824074074074 | 49.98 |
| 0.2992939814814815 | 49.981 |
| 0.29930555555555555 | 49.981 |
| 0.29931712962962964 | 49.978 |
| 0.29932870370370374 | 49.975 |
| 0.2993402777777778 | 49.971 |
| 0.29935185185185187 | 49.969 |
| 0.2993634259259259 | 49.973 |
| 0.299375 | 49.975 |
| 0.29938657407407404 | 49.975 |
| 0.29939814814814814 | 49.975 |
| 0.29940972222222223 | 49.972 |
| 0.29942129629629627 | 49.971 |
| 0.29943287037037036 | 49.968 |
| 0.29944444444444446 | 49.966 |
| 0.2994560185185185 | 49.962 |
| 0.2994675925925926 | 49.96 |
| 0.2994791666666667 | 49.956 |
| 0.2994907407407407 | 49.953 |
| 0.2995023148148148 | 49.955 |
| 0.2995138888888889 | 49.955 |
| 0.29952546296296295 | 49.956 |
| 0.29953703703703705 | 49.951 |
| 0.29954861111111114 | 49.949 |
| 0.2995601851851852 | 49.945 |
| 0.2995717592592593 | 49.947 |
| 0.29958333333333337 | 49.945 |
| 0.2995949074074074 | 49.945 |
| 0.29960648148148145 | 49.944 |
| 0.29961805555555554 | 49.945 |
| 0.29962962962962963 | 49.943 |
| 0.2996412037037037 | 49.943 |
| 0.29965277777777777 | 49.94 |
| 0.29966435185185186 | 49.94 |
| 0.2996759259259259 | 49.939 |
| 0.2996875 | 49.938 |
| 0.2996990740740741 | 49.935 |
| 0.29971064814814813 | 49.934 |
| 0.2997222222222222 | 49.932 |
| 0.2997337962962963 | 49.931 |
| 0.29974537037037036 | 49.933 |
| 0.29975694444444445 | 49.937 |
| 0.29976851851851855 | 49.941 |
| 0.2997800925925926 | 49.944 |
| 0.2997916666666667 | 49.946 |
| 0.2998032407407408 | 49.946 |
| 0.2998148148148148 | 49.947 |
| 0.2998263888888889 | 49.948 |
| 0.299837962962963 | 49.947 |
| 0.29984953703703704 | 49.946 |
| 0.2998611111111111 | 49.942 |
| 0.2998726851851852 | 49.937 |
| 0.29988425925925927 | 49.932 |
| 0.2998958333333333 | 49.929 |
| 0.2999074074074074 | 49.926 |
| 0.2999189814814815 | 49.924 |
| 0.29993055555555553 | 49.922 |
| 0.29994212962962963 | 49.921 |
| 0.2999537037037037 | 49.918 |
| 0.29996527777777776 | 49.917 |
| 0.29997685185185186 | 49.916 |
| 0.29998842592592595 | 49.913 |
| 0.3 | 49.91 |
| 0.3000115740740741 | 49.912 |
| 0.3000231481481482 | 49.911 |
| 0.3000347222222222 | 49.911 |
| 0.3000462962962963 | 49.911 |
| 0.3000578703703704 | 49.911 |
| 0.30006944444444444 | 49.912 |
| 0.3000810185185185 | 49.913 |
| 0.3000925925925926 | 49.913 |
| 0.30010416666666667 | 49.91 |
| 0.3001157407407407 | 49.909 |
| 0.3001273148148148 | 49.907 |
| 0.3001388888888889 | 49.908 |
| 0.30015046296296294 | 49.906 |
| 0.30016203703703703 | 49.903 |
| 0.3001736111111111 | 49.905 |
| 0.30018518518518517 | 49.909 |
| 0.30019675925925926 | 49.911 |
| 0.30020833333333335 | 49.911 |
| 0.3002199074074074 | 49.911 |
| 0.3002314814814815 | 49.911 |
| 0.3002430555555556 | 49.908 |
| 0.3002546296296296 | 49.908 |
| 0.3002662037037037 | 49.906 |
| 0.3002777777777778 | 49.903 |
| 0.30028935185185185 | 49.9 |
| 0.30030092592592594 | 49.901 |
| 0.3003125 | 49.903 |
| 0.3003240740740741 | 49.902 |
| 0.3003356481481481 | 49.902 |
| 0.3003472222222222 | 49.904 |
| 0.3003587962962963 | 49.903 |
| 0.30037037037037034 | 49.904 |
| 0.30038194444444444 | 49.904 |
| 0.30039351851851853 | 49.903 |
| 0.30040509259259257 | 49.903 |
| 0.30041666666666667 | 49.901 |
| 0.30042824074074076 | 49.9 |
| 0.3004398148148148 | 49.9 |
| 0.3004513888888889 | 49.903 |
| 0.300462962962963 | 49.904 |
| 0.300474537037037 | 49.902 |
| 0.3004861111111111 | 49.903 |
| 0.3004976851851852 | 49.903 |
| 0.30050925925925925 | 49.902 |
| 0.30052083333333335 | 49.903 |
| 0.30053240740740744 | 49.906 |
| 0.3005439814814815 | 49.908 |
| 0.3005555555555555 | 49.906 |
| 0.3005671296296296 | 49.907 |
| 0.3005787037037037 | 49.912 |
| 0.30059027777777775 | 49.915 |
| 0.30060185185185184 | 49.917 |
| 0.30061342592592594 | 49.919 |
| 0.300625 | 49.921 |
| 0.30063657407407407 | 49.917 |
| 0.30064814814814816 | 49.914 |
| 0.3006597222222222 | 49.91 |
| 0.3006712962962963 | 49.907 |
| 0.3006828703703704 | 49.909 |
| 0.30069444444444443 | 49.912 |
| 0.3007060185185185 | 49.915 |
| 0.3007175925925926 | 49.916 |
| 0.30072916666666666 | 49.916 |
| 0.30074074074074075 | 49.91 |
| 0.30075231481481485 | 49.908 |
| 0.3007638888888889 | 49.905 |
| 0.300775462962963 | 49.903 |
| 0.300787037037037 | 49.9 |
| 0.3007986111111111 | 49.896 |
| 0.30081018518518515 | 49.891 |
| 0.30082175925925925 | 49.889 |
| 0.30083333333333334 | 49.889 |
| 0.3008449074074074 | 49.892 |
| 0.3008564814814815 | 49.899 |
| 0.30086805555555557 | 49.908 |
| 0.3008796296296296 | 49.914 |
| 0.3008912037037037 | 49.915 |
| 0.3009027777777778 | 49.916 |
| 0.30091435185185184 | 49.915 |
| 0.30092592592592593 | 49.914 |
| 0.3009375 | 49.914 |
| 0.30094907407407406 | 49.911 |
| 0.30096064814814816 | 49.907 |
| 0.30097222222222225 | 49.904 |
| 0.3009837962962963 | 49.903 |
| 0.3009953703703704 | 49.904 |
| 0.3010069444444445 | 49.905 |
| 0.3010185185185185 | 49.907 |
| 0.30103009259259256 | 49.907 |
| 0.30104166666666665 | 49.908 |
| 0.30105324074074075 | 49.906 |
| 0.3010648148148148 | 49.91 |
| 0.3010763888888889 | 49.911 |
| 0.301087962962963 | 49.915 |
| 0.301099537037037 | 49.915 |
| 0.3011111111111111 | 49.914 |
| 0.3011226851851852 | 49.914 |
| 0.30113425925925924 | 49.913 |
| 0.30114583333333333 | 49.914 |
| 0.30115740740740743 | 49.916 |
| 0.30116898148148147 | 49.917 |
| 0.30118055555555556 | 49.918 |
| 0.30119212962962966 | 49.917 |
| 0.3012037037037037 | 49.917 |
| 0.3012152777777778 | 49.914 |
| 0.3012268518518519 | 49.911 |
| 0.3012384259259259 | 49.909 |
| 0.30125 | 49.907 |
| 0.30126157407407406 | 49.908 |
| 0.30127314814814815 | 49.91 |
| 0.3012847222222222 | 49.908 |
| 0.3012962962962963 | 49.909 |
| 0.3013078703703704 | 49.91 |
| 0.3013194444444444 | 49.91 |
| 0.3013310185185185 | 49.907 |
| 0.3013425925925926 | 49.903 |
| 0.30135416666666665 | 49.899 |
| 0.30136574074074074 | 49.898 |
| 0.30137731481481483 | 49.895 |
| 0.3013888888888889 | 49.892 |
| 0.30140046296296297 | 49.889 |
| 0.30141203703703706 | 49.886 |
| 0.3014236111111111 | 49.885 |
| 0.3014351851851852 | 49.885 |
| 0.3014467592592593 | 49.883 |
| 0.30145833333333333 | 49.88 |
| 0.3014699074074074 | 49.878 |
| 0.3014814814814815 | 49.879 |
| 0.30149305555555556 | 49.877 |
| 0.3015046296296296 | 49.877 |
| 0.3015162037037037 | 49.877 |
| 0.3015277777777778 | 49.879 |
| 0.3015393518518518 | 49.879 |
| 0.3015509259259259 | 49.88 |
| 0.3015625 | 49.882 |
| 0.30157407407407405 | 49.883 |
| 0.30158564814814814 | 49.884 |
| 0.30159722222222224 | 49.887 |
| 0.3016087962962963 | 49.889 |
| 0.30162037037037037 | 49.893 |
| 0.30163194444444447 | 49.9 |
| 0.3016435185185185 | 49.907 |
| 0.3016550925925926 | 49.912 |
| 0.3016666666666667 | 49.916 |
| 0.30167824074074073 | 49.918 |
| 0.3016898148148148 | 49.922 |
| 0.3017013888888889 | 49.922 |
| 0.30171296296296296 | 49.921 |
| 0.301724537037037 | 49.92 |
| 0.3017361111111111 | 49.92 |
| 0.3017476851851852 | 49.919 |
| 0.3017592592592592 | 49.919 |
| 0.3017708333333333 | 49.917 |
| 0.3017824074074074 | 49.915 |
| 0.30179398148148145 | 49.915 |
| 0.30180555555555555 | 49.918 |
| 0.30181712962962964 | 49.92 |
| 0.3018287037037037 | 49.925 |
| 0.3018402777777778 | 49.926 |
| 0.30185185185185187 | 49.927 |
| 0.3018634259259259 | 49.932 |
| 0.301875 | 49.935 |
| 0.3018865740740741 | 49.939 |
| 0.30189814814814814 | 49.943 |
| 0.30190972222222223 | 49.945 |
| 0.3019212962962963 | 49.946 |
| 0.30193287037037037 | 49.948 |
| 0.30194444444444446 | 49.947 |
| 0.30195601851851855 | 49.947 |
| 0.3019675925925926 | 49.949 |
| 0.30197916666666663 | 49.951 |
| 0.3019907407407407 | 49.952 |
| 0.3020023148148148 | 49.95 |
| 0.30201388888888886 | 49.953 |
| 0.30202546296296295 | 49.955 |
| 0.30203703703703705 | 49.957 |
| 0.3020486111111111 | 49.958 |
| 0.3020601851851852 | 49.96 |
| 0.3020717592592593 | 49.963 |
| 0.3020833333333333 | 49.964 |
| 0.3020949074074074 | 49.962 |
| 0.3021064814814815 | 49.961 |
| 0.30211805555555554 | 49.96 |
| 0.30212962962962964 | 49.959 |
| 0.30214120370370373 | 49.958 |
| 0.30215277777777777 | 49.956 |
| 0.30216435185185186 | 49.954 |
| 0.30217592592592596 | 49.956 |
| 0.3021875 | 49.96 |
| 0.3021990740740741 | 49.962 |
| 0.30221064814814813 | 49.966 |
| 0.3022222222222222 | 49.97 |
| 0.30223379629629626 | 49.973 |
| 0.30224537037037036 | 49.975 |
| 0.30225694444444445 | 49.976 |
| 0.3022685185185185 | 49.977 |
| 0.3022800925925926 | 49.977 |
| 0.3022916666666667 | 49.98 |
| 0.3023032407407407 | 49.979 |
| 0.3023148148148148 | 49.977 |
| 0.3023263888888889 | 49.979 |
| 0.30233796296296295 | 49.984 |
| 0.30234953703703704 | 49.986 |
| 0.30236111111111114 | 49.988 |
| 0.3023726851851852 | 49.989 |
| 0.30238425925925927 | 49.99 |
| 0.30239583333333336 | 49.99 |
| 0.3024074074074074 | 49.989 |
| 0.3024189814814815 | 49.991 |
| 0.3024305555555556 | 49.994 |
| 0.30244212962962963 | 49.996 |
| 0.30245370370370367 | 50 |
| 0.30246527777777776 | 50.002 |
| 0.30247685185185186 | 50.001 |
| 0.3024884259259259 | 49.999 |
| 0.3025 | 49.997 |
| 0.3025115740740741 | 49.995 |
| 0.3025231481481481 | 49.995 |
| 0.3025347222222222 | 49.993 |
| 0.3025462962962963 | 49.991 |
| 0.30255787037037035 | 49.99 |
| 0.30256944444444445 | 49.986 |
| 0.30258101851851854 | 49.987 |
| 0.3025925925925926 | 49.988 |
| 0.3026041666666667 | 49.988 |
| 0.30261574074074077 | 49.986 |
| 0.3026273148148148 | 49.985 |
| 0.3026388888888889 | 49.981 |
| 0.302650462962963 | 49.981 |
| 0.30266203703703703 | 49.984 |
| 0.3026736111111111 | 49.985 |
| 0.30268518518518517 | 49.988 |
| 0.30269675925925926 | 49.993 |
| 0.3027083333333333 | 49.992 |
| 0.3027199074074074 | 49.991 |
| 0.3027314814814815 | 49.989 |
| 0.30274305555555553 | 49.984 |
| 0.3027546296296296 | 49.982 |
| 0.3027662037037037 | 49.979 |
| 0.30277777777777776 | 49.976 |
| 0.30278935185185185 | 49.974 |
| 0.30280092592592595 | 49.974 |
| 0.3028125 | 49.972 |
| 0.3028240740740741 | 49.973 |
| 0.3028356481481482 | 49.977 |
| 0.3028472222222222 | 49.973 |
| 0.3028587962962963 | 49.967 |
| 0.3028703703703704 | 49.963 |
| 0.30288194444444444 | 49.961 |
| 0.30289351851851853 | 49.961 |
| 0.30290509259259263 | 49.961 |
| 0.30291666666666667 | 49.959 |
| 0.3029282407407407 | 49.956 |
| 0.3029398148148148 | 49.954 |
| 0.3029513888888889 | 49.956 |
| 0.30296296296296293 | 49.954 |
| 0.30297453703703703 | 49.958 |
| 0.3029861111111111 | 49.962 |
| 0.30299768518518516 | 49.967 |
| 0.30300925925925926 | 49.972 |
| 0.30302083333333335 | 49.978 |
| 0.3030324074074074 | 49.98 |
| 0.3030439814814815 | 49.979 |
| 0.3030555555555556 | 49.975 |
| 0.3030671296296296 | 49.975 |
| 0.3030787037037037 | 49.972 |
| 0.3030902777777778 | 49.965 |
| 0.30310185185185184 | 49.959 |
| 0.30311342592592594 | 49.959 |
| 0.30312500000000003 | 49.962 |
| 0.30313657407407407 | 49.965 |
| 0.30314814814814817 | 49.966 |
| 0.3031597222222222 | 49.97 |
| 0.3031712962962963 | 49.973 |
| 0.30318287037037034 | 49.974 |
| 0.30319444444444443 | 49.98 |
| 0.3032060185185185 | 49.985 |
| 0.30321759259259257 | 49.989 |
| 0.30322916666666666 | 49.988 |
| 0.30324074074074076 | 49.988 |
| 0.3032523148148148 | 49.988 |
| 0.3032638888888889 | 49.989 |
| 0.303275462962963 | 49.989 |
| 0.303287037037037 | 49.991 |
| 0.3032986111111111 | 49.991 |
| 0.3033101851851852 | 49.991 |
| 0.30332175925925925 | 49.991 |
| 0.30333333333333334 | 49.989 |
| 0.30334490740740744 | 49.988 |
| 0.3033564814814815 | 49.988 |
| 0.30336805555555557 | 49.986 |
| 0.30337962962962967 | 49.986 |
| 0.3033912037037037 | 49.985 |
| 0.30340277777777774 | 49.987 |
| 0.30341435185185184 | 49.991 |
| 0.30342592592592593 | 49.993 |
| 0.30343749999999997 | 49.996 |
| 0.30344907407407407 | 49.997 |
| 0.30346064814814816 | 49.997 |